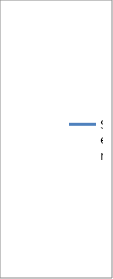
| Category | Series 0 |
|---|---|
| 0 | 8590.865 |
| 1 | 8567.337 |
| 2 | 8543.74 |
| 3 | 8519.288 |
| 4 | 8493.365 |
| 5 | 8468.144 |
| 6 | 8441.712 |
| 7 | 8416.721 |
| 8 | 8391.058 |
| 9 | 8363.827 |
| 10 | 8337.202 |
| 11 | 8310.673 |
| 12 | 8284.644 |
| 13 | 8258.212 |
| 14 | 8231.74 |
| 15 | 8205.144 |
| 16 | 8178.163 |
| 17 | 8151.058 |
| 18 | 8123.683 |
| 19 | 8097.038 |
| 20 | 8070.327 |
| 21 | 8042.817 |
| 22 | 8014.567 |
| 23 | 7988.115 |
| 24 | 7960.673 |
| 25 | 7933.577 |
| 26 | 7905.827 |
| 27 | 7877.971 |
| 28 | 7850.048 |
| 29 | 7822.567 |
| 30 | 7795.356 |
| 31 | 7769.183 |
| 32 | 7742.01 |
| 33 | 7714.462 |
| 34 | 7686.644 |
| 35 | 7658.221 |
| 36 | 7631.788 |
| 37 | 7604.596 |
| 38 | 7576.99 |
| 39 | 7550.231 |
| 40 | 7523.221 |
| 41 | 7495.654 |
| 42 | 7468.663 |
| 43 | 7440.923 |
| 44 | 7413.74 |
| 45 | 7387.481 |
| 46 | 7361.221 |
| 47 | 7334.51 |
| 48 | 7307.625 |
| 49 | 7281.423 |
| 50 | 7256.038 |
| 51 | 7230.106 |
| 52 | 7204.433 |
| 53 | 7177.356 |
| 54 | 7151.067 |
| 55 | 7124.558 |
| 56 | 7098.5 |
| 57 | 7073.923 |
| 58 | 7048.721 |
| 59 | 7023.462 |
| 60 | 6997.192 |
| 61 | 6969.567 |
| 62 | 6943.115 |
| 63 | 6917.76 |
| 64 | 6892.413 |
| 65 | 6866.452 |
| 66 | 6840.24 |
| 67 | 6815.144 |
| 68 | 6789.913 |
| 69 | 6766.029 |
| 70 | 6742.231 |
| 71 | 6718.038 |
| 72 | 6694.019 |
| 73 | 6669.875 |
| 74 | 6645.981 |
| 75 | 6623.077 |
| 76 | 6599.846 |
| 77 | 6576.567 |
| 78 | 6552.673 |
| 79 | 6529.76 |
| 80 | 6507.212 |
| 81 | 6485.385 |
| 82 | 6464.183 |
| 83 | 6441.587 |
| 84 | 6419.423 |
| 85 | 6397.606 |
| 86 | 6376.875 |
| 87 | 6355.76 |
| 88 | 6334.308 |
| 89 | 6313.202 |
| 90 | 6292.115 |
| 91 | 6271.154 |
| 92 | 6251.452 |
| 93 | 6231.317 |
| 94 | 6211.279 |
| 95 | 6191.144 |
| 96 | 6171.442 |
| 97 | 6151.769 |
| 98 | 6132.981 |
| 99 | 6112.462 |
| 100 | 6094.231 |
| 101 | 6075.375 |
| 102 | 6056.981 |
| 103 | 6037.74 |
| 104 | 6020.375 |
| 105 | 6002.317 |
| 106 | 5984.731 |
| 107 | 5967.365 |
| 108 | 5949.327 |
| 109 | 5931.673 |
| 110 | 5914.606 |
| 111 | 5897.712 |
| 112 | 5880.365 |
| 113 | 5863.231 |
| 114 | 5847.894 |
| 115 | 5831.26 |
| 116 | 5814.587 |
| 117 | 5798.394 |
| 118 | 5782.519 |
| 119 | 5767.346 |
| 120 | 5751.481 |
| 121 | 5735.375 |
| 122 | 5720.048 |
| 123 | 5704.538 |
| 124 | 5689.519 |
| 125 | 5673.788 |
| 126 | 5658.337 |
| 127 | 5643.212 |
| 128 | 5628.308 |
| 129 | 5613.596 |
| 130 | 5599.615 |
| 131 | 5584.317 |
| 132 | 5570.173 |
| 133 | 5555.548 |
| 134 | 5540.827 |
| 135 | 5526.856 |
| 136 | 5512.933 |
| 137 | 5498.173 |
| 138 | 5483.885 |
| 139 | 5470.183 |
| 140 | 5455.519 |
| 141 | 5441.567 |
| 142 | 5426.606 |
| 143 | 5413.038 |
| 144 | 5399.25 |
| 145 | 5384.99 |
| 146 | 5370.654 |
| 147 | 5356.673 |
| 148 | 5342.952 |
| 149 | 5329.856 |
| 150 | 5316.019 |
| 151 | 5302.625 |
| 152 | 5289.173 |
| 153 | 5276.712 |
| 154 | 5263.615 |
| 155 | 5250.875 |
| 156 | 5238.673 |
| 157 | 5226.202 |
| 158 | 5213.702 |
| 159 | 5202.125 |
| 160 | 5189.644 |
| 161 | 5177.26 |
| 162 | 5165.029 |
| 163 | 5152.981 |
| 164 | 5141.567 |
| 165 | 5129.481 |
| 166 | 5117.394 |
| 167 | 5105.75 |
| 168 | 5093.779 |
| 169 | 5082.192 |
| 170 | 5071.663 |
| 171 | 5060.49 |
| 172 | 5048.99 |
| 173 | 5038.577 |
| 174 | 5027.106 |
| 175 | 5016.125 |
| 176 | 5005.404 |
| 177 | 4994.615 |
| 178 | 4983.913 |
| 179 | 4973.865 |
| 180 | 4963.106 |
| 181 | 4952.51 |
| 182 | 4942.058 |
| 183 | 4931.923 |
| 184 | 4922.231 |
| 185 | 4912.26 |
| 186 | 4902.51 |
| 187 | 4892.558 |
| 188 | 4882.962 |
| 189 | 4873.423 |
| 190 | 4864.058 |
| 191 | 4853.875 |
| 192 | 4844.529 |
| 193 | 4835.462 |
| 194 | 4827.125 |
| 195 | 4818.192 |
| 196 | 4809 |
| 197 | 4800.538 |
| 198 | 4791.558 |
| 199 | 4782.817 |
| 200 | 4774.663 |
| 201 | 4766.442 |
| 202 | 4757.606 |
| 203 | 4749.029 |
| 204 | 4741.298 |
| 205 | 4733.077 |
| 206 | 4724.452 |
| 207 | 4715.942 |
| 208 | 4708.481 |
| 209 | 4700.74 |
| 210 | 4692.442 |
| 211 | 4685.192 |
| 212 | 4677.683 |
| 213 | 4670.183 |
| 214 | 4662.288 |
| 215 | 4654.712 |
| 216 | 4647.538 |
| 217 | 4640.788 |
| 218 | 4633.99 |
| 219 | 4626.654 |
| 220 | 4619.481 |
| 221 | 4612.827 |
| 222 | 4606.019 |
| 223 | 4598.721 |
| 224 | 4592.115 |
| 225 | 4585.452 |
| 226 | 4578.933 |
| 227 | 4572.481 |
| 228 | 4566.596 |
| 229 | 4560.413 |
| 230 | 4554.221 |
| 231 | 4548.144 |
| 232 | 4542.048 |
| 233 | 4535.76 |
| 234 | 4529.596 |
| 235 | 4523.837 |
| 236 | 4517.875 |
| 237 | 4512.471 |
| 238 | 4506.865 |
| 239 | 4501.654 |
| 240 | 4496.558 |
| 241 | 4491.567 |
| 242 | 4486.433 |
| 243 | 4482.26 |
| 244 | 4477.038 |
| 245 | 4471.971 |
| 246 | 4466.769 |
| 247 | 4462.125 |
| 248 | 4458.519 |
| 249 | 4453.769 |
| 250 | 4448.606 |
| 251 | 4443.76 |
| 252 | 4439.356 |
| 253 | 4434.654 |
| 254 | 4429.567 |
| 255 | 4424.019 |
| 256 | 4418.798 |
| 257 | 4414.308 |
| 258 | 4408.683 |
| 259 | 4404.529 |
| 260 | 4400.135 |
| 261 | 4394.183 |
| 262 | 4387.798 |
| 263 | 4382.452 |
| 264 | 4377.087 |
| 265 | 4371.385 |
| 266 | 4366.192 |
| 267 | 4361.087 |
| 268 | 4356.51 |
| 269 | 4352.077 |
| 270 | 4347.663 |
| 271 | 4343.5 |
| 272 | 4338.913 |
| 273 | 4334.635 |
| 274 | 4331.038 |
| 275 | 4328.394 |
| 276 | 4325.337 |
| 277 | 4322.75 |
| 278 | 4320.135 |
| 279 | 4318.481 |
| 280 | 4316.74 |
| 281 | 4315.327 |
| 282 | 4314.375 |
| 283 | 4313.827 |
| 284 | 4313.942 |
| 285 | 4313.298 |
| 286 | 4312.615 |
| 287 | 4312.327 |
| 288 | 4312.5 |
| 289 | 4314.154 |
| 290 | 4315.308 |
| 291 | 4317.625 |
| 292 | 4319.433 |
| 293 | 4321.596 |
| 294 | 4324.942 |
| 295 | 4327.327 |
| 296 | 4329.279 |
| 297 | 4331.615 |
| 298 | 4335.269 |
| 299 | 4338.894 |
| 300 | 4342.452 |
| 301 | 4347.481 |
| 302 | 4352.423 |
| 303 | 4358.75 |
| 304 | 4365.298 |
| 305 | 4372.51 |
| 306 | 4380.067 |
| 307 | 4387.923 |
| 308 | 4397.038 |
| 309 | 4404.913 |
| 310 | 4413.75 |
| 311 | 4423.365 |
| 312 | 4433.269 |
| 313 | 4443.202 |
| 314 | 4454.846 |
| 315 | 4465.375 |
| 316 | 4476.933 |
| 317 | 4489.192 |
| 318 | 4502.288 |
| 319 | 4514.221 |
| 320 | 4527.952 |
| 321 | 4542.067 |
| 322 | 4557.24 |
| 323 | 4571.846 |
| 324 | 4586.99 |
| 325 | 4603.298 |
| 326 | 4619.327 |
| 327 | 4635.183 |
| 328 | 4652.221 |
| 329 | 4670.433 |
| 330 | 4689.067 |
| 331 | 4708.721 |
| 332 | 4729.356 |
| 333 | 4750.635 |
| 334 | 4771.654 |
| 335 | 4793.587 |
| 336 | 4816.481 |
| 337 | 4840.192 |
| 338 | 4864.702 |
| 339 | 4889.077 |
| 340 | 4913.212 |
| 341 | 4937.019 |
| 342 | 4961.202 |
| 343 | 4986.365 |
| 344 | 5011.471 |
| 345 | 5037.51 |
| 346 | 5063.635 |
| 347 | 5090.394 |
| 348 | 5117.317 |
| 349 | 5143.183 |
| 350 | 5170.567 |
| 351 | 5196.74 |
| 352 | 5222.952 |
| 353 | 5249.077 |
| 354 | 5275.5 |
| 355 | 5301.99 |
| 356 | 5327.952 |
| 357 | 5353.837 |
| 358 | 5379.827 |
| 359 | 5405.837 |
| 360 | 5430.663 |
| 361 | 5457.731 |
| 362 | 5485.173 |
| 363 | 5512.75 |
| 364 | 5539.442 |
| 365 | 5567.173 |
| 366 | 5595.683 |
| 367 | 5623.519 |
| 368 | 5652.5 |
| 369 | 5683.144 |
| 370 | 5713.606 |
| 371 | 5745.548 |
| 372 | 5776.865 |
| 373 | 5809.721 |
| 374 | 5842.029 |
| 375 | 5874.846 |
| 376 | 5908.202 |
| 377 | 5942.163 |
| 378 | 5976.385 |
| 379 | 6010.577 |
| 380 | 6045.49 |
| 381 | 6081.779 |
| 382 | 6118.433 |
| 383 | 6154.538 |
| 384 | 6191.029 |
| 385 | 6227.942 |
| 386 | 6264.731 |
| 387 | 6301.817 |
| 388 | 6338.25 |
| 389 | 6375.615 |
| 390 | 6413.644 |
| 391 | 6452.327 |
| 392 | 6491.067 |
| 393 | 6530.067 |
| 394 | 6569.683 |
| 395 | 6610.635 |
| 396 | 6652.519 |
| 397 | 6693.596 |
| 398 | 6735.356 |
| 399 | 6778.288 |
| 400 | 6819.971 |
| 401 | 6862.346 |
| 402 | 6904.462 |
| 403 | 6946.048 |
| 404 | 6987.731 |
| 405 | 7030.337 |
| 406 | 7071.837 |
| 407 | 7112.394 |
| 408 | 7153.356 |
| 409 | 7193.308 |
| 410 | 7231.481 |
| 411 | 7270.038 |
| 412 | 7307.731 |
| 413 | 7343.904 |
| 414 | 7380.942 |
| 415 | 7416.308 |
| 416 | 7451.048 |
| 417 | 7485.817 |
| 418 | 7520.663 |
| 419 | 7553.587 |
| 420 | 7586.481 |
| 421 | 7618.356 |
| 422 | 7650.567 |
| 423 | 7683.856 |
| 424 | 7717.971 |
| 425 | 7751.538 |
| 426 | 7785.875 |
| 427 | 7820.894 |
| 428 | 7854.51 |
| 429 | 7889.74 |
| 430 | 7923.76 |
| 431 | 7958.125 |
| 432 | 7993.5 |
| 433 | 8028.183 |
| 434 | 8062.712 |
| 435 | 8097.856 |
| 436 | 8132.288 |
| 437 | 8167.115 |
| 438 | 8200.721 |
| 439 | 8235.212 |
| 440 | 8269.76 |
| 441 | 8303.183 |
| 442 | 8337.221 |
| 443 | 8370.163 |
| 444 | 8402.519 |
| 445 | 8435.731 |
| 446 | 8468.269 |
| 447 | 8499.625 |
| 448 | 8530.75 |
| 449 | 8561.519 |
| 450 | 8593.154 |
| 451 | 8623.731 |
| 452 | 8654.288 |
| 453 | 8685.279 |
| 454 | 8715.567 |
| 455 | 8745.625 |
| 456 | 8775.788 |
| 457 | 8803.654 |
| 458 | 8831.837 |
| 459 | 8861.462 |
| 460 | 8889.952 |
| 461 | 8917.99 |
| 462 | 8945.692 |
| 463 | 8973.683 |
| 464 | 9001.827 |
| 465 | 9027.615 |
| 466 | 9054.058 |
| 467 | 9080.202 |
| 468 | 9106.5 |
| 469 | 9131.692 |
| 470 | 9156.798 |
| 471 | 9181.25 |
| 472 | 9205.442 |
| 473 | 9229.731 |
| 474 | 9252.76 |
| 475 | 9276.077 |
| 476 | 9297.885 |
| 477 | 9320.962 |
| 478 | 9342.827 |
| 479 | 9364.606 |
| 480 | 9386.587 |
| 481 | 9407.683 |
| 482 | 9428.615 |
| 483 | 9449.308 |
| 484 | 9469.663 |
| 485 | 9489.317 |
| 486 | 9508.769 |
| 487 | 9528.231 |
| 488 | 9548.019 |
| 489 | 9567.712 |
| 490 | 9587.971 |
| 491 | 9607.26 |
| 492 | 9626.346 |
| 493 | 9645.567 |
| 494 | 9665.212 |
| 495 | 9684.269 |
| 496 | 9703.279 |
| 497 | 9721.788 |
| 498 | 9739.885 |
| 499 | 9758.298 |
| 500 | 9775.635 |
| 501 | 9793.596 |
| 502 | 9810.856 |
| 503 | 9828.529 |
| 504 | 9845.433 |
| 505 | 9861.913 |
| 506 | 9877.615 |
| 507 | 9894.144 |
| 508 | 9909.615 |
| 509 | 9925.221 |
| 510 | 9940.279 |
| 511 | 9954.769 |
| 512 | 9970.087 |
| 513 | 9984.981 |
| 514 | 9999.779 |
| 515 | 10014.058 |
| 516 | 10027.769 |
| 517 | 10042.394 |
| 518 | 10056.019 |
| 519 | 10070.269 |
| 520 | 10083.683 |
| 521 | 10096.731 |
| 522 | 10110.24 |
| 523 | 10122.99 |
| 524 | 10136.077 |
| 525 | 10147.942 |
| 526 | 10160.163 |
| 527 | 10172.212 |
| 528 | 10184.202 |
| 529 | 10195.692 |
| 530 | 10207.212 |
| 531 | 10218.74 |
| 532 | 10229.606 |
| 533 | 10240.279 |
| 534 | 10251.135 |
| 535 | 10261.115 |
| 536 | 10271.558 |
| 537 | 10281.058 |
| 538 | 10290.933 |
| 539 | 10301.067 |
| 540 | 10310.683 |
| 541 | 10320.865 |
| 542 | 10330.125 |
| 543 | 10339.269 |
| 544 | 10348.51 |
| 545 | 10358.433 |
| 546 | 10368.442 |
| 547 | 10377.115 |
| 548 | 10385.894 |
| 549 | 10395.279 |
| 550 | 10404.087 |
| 551 | 10413.221 |
| 552 | 10422.221 |
| 553 | 10431.327 |
| 554 | 10439.837 |
| 555 | 10448.663 |
| 556 | 10456.077 |
| 557 | 10464.567 |
| 558 | 10472.394 |
| 559 | 10480.279 |
| 560 | 10488.24 |
| 561 | 10496.308 |
| 562 | 10504.279 |
| 563 | 10511.923 |
| 564 | 10519.394 |
| 565 | 10526.606 |
| 566 | 10533.567 |
| 567 | 10541.231 |
| 568 | 10546.981 |
| 569 | 10553.202 |
| 570 | 10559.971 |
| 571 | 10566.327 |
| 572 | 10573.279 |
| 573 | 10579.692 |
| 574 | 10585.817 |
| 575 | 10591.731 |
| 576 | 10597.481 |
| 577 | 10603.712 |
| 578 | 10609.462 |
| 579 | 10614.76 |
| 580 | 10620.538 |
| 581 | 10625.913 |
| 582 | 10630.952 |
| 583 | 10636.221 |
| 584 | 10641.74 |
| 585 | 10646.952 |
| 586 | 10651.615 |
| 587 | 10657.442 |
| 588 | 10662.221 |
| 589 | 10667.163 |
| 590 | 10671.702 |
| 591 | 10675.962 |
| 592 | 10680.606 |
| 593 | 10684.529 |
| 594 | 10688.548 |
| 595 | 10692.308 |
| 596 | 10695.731 |
| 597 | 10699.337 |
| 598 | 10702.385 |
| 599 | 10706.298 |
| 600 | 10709.221 |
| 601 | 10712.423 |
| 602 | 10714.981 |
| 603 | 10718.019 |
| 604 | 10721.087 |
| 605 | 10723.981 |
| 606 | 10727.096 |
| 607 | 10729.712 |
| 608 | 10733.692 |
| 609 | 10736.76 |
| 610 | 10739.365 |
| 611 | 10742.481 |
| 612 | 10745.692 |
| 613 | 10748.25 |
| 614 | 10751.096 |
| 615 | 10754.135 |
| 616 | 10757.067 |
| 617 | 10760.154 |
| 618 | 10762.644 |
| 619 | 10765.135 |
| 620 | 10768.096 |
| 621 | 10770.885 |
| 622 | 10774.452 |
| 623 | 10777.038 |
| 624 | 10779.346 |
| 625 | 10781.865 |
| 626 | 10784.74 |
| 627 | 10787.192 |
| 628 | 10789.99 |
| 629 | 10792.846 |
| 630 | 10795.798 |
| 631 | 10798.192 |
| 632 | 10800.837 |
| 633 | 10803.519 |
| 634 | 10806.01 |
| 635 | 10808.538 |
| 636 | 10811.183 |
| 637 | 10813.567 |
| 638 | 10815.798 |
| 639 | 10818.5 |
| 640 | 10821.365 |
| 641 | 10823.558 |
| 642 | 10826 |
| 643 | 10828.721 |
| 644 | 10830.606 |
| 645 | 10832.913 |
| 646 | 10835.327 |
| 647 | 10837.837 |
| 648 | 10839.481 |
| 649 | 10841.654 |
| 650 | 10843.404 |
| 651 | 10845.087 |
| 652 | 10846.683 |
| 653 | 10848.029 |
| 654 | 10849.981 |
| 655 | 10851.346 |
| 656 | 10852.577 |
| 657 | 10853.846 |
| 658 | 10855 |
| 659 | 10855.837 |
| 660 | 10856.894 |
| 661 | 10857.394 |
| 662 | 10858.615 |
| 663 | 10859.74 |
| 664 | 10860.615 |
| 665 | 10862.596 |
| 666 | 10863.567 |
| 667 | 10865.01 |
| 668 | 10866.279 |
| 669 | 10867.51 |
| 670 | 10869.413 |
| 671 | 10871.404 |
| 672 | 10872.933 |
| 673 | 10874.452 |
| 674 | 10876.269 |
| 675 | 10877.99 |
| 676 | 10879.442 |
| 677 | 10880.615 |
| 678 | 10882.288 |
| 679 | 10883.788 |
| 680 | 10885.308 |
| 681 | 10886.577 |
| 682 | 10888.202 |
| 683 | 10889.673 |
| 684 | 10890.971 |
| 685 | 10892.231 |
| 686 | 10893.519 |
| 687 | 10895.375 |
| 688 | 10896.731 |
| 689 | 10897.971 |
| 690 | 10899.385 |
| 691 | 10901.029 |
| 692 | 10902.587 |
| 693 | 10903.846 |
| 694 | 10905.24 |
| 695 | 10906.51 |
| 696 | 10908.5 |
| 697 | 10909.942 |
| 698 | 10911.183 |
| 699 | 10912.673 |
| 700 | 10914.038 |
| 701 | 10915.221 |
| 702 | 10916.01 |
| 703 | 10916.942 |
| 704 | 10918.202 |
| 705 | 10919.26 |
| 706 | 10920.269 |
| 707 | 10921.702 |
| 708 | 10922.51 |
| 709 | 10923.769 |
| 710 | 10924.529 |
| 711 | 10925.317 |
| 712 | 10926.019 |
| 713 | 10926.26 |
| 714 | 10926.702 |
| 715 | 10926.779 |
| 716 | 10926.644 |
| 717 | 10926.596 |
| 718 | 10926.221 |
| 719 | 10926.817 |
| 720 | 10926.26 |
| 721 | 10925.654 |
| 722 | 10925.548 |
| 723 | 10925.856 |
| 724 | 10925.808 |
| 725 | 10925.673 |
| 726 | 10926.154 |
| 727 | 10926.106 |
| 728 | 10926.394 |
| 729 | 10926.779 |
| 730 | 10926.577 |
| 731 | 10926.702 |
| 732 | 10927.327 |
| 733 | 10927.538 |
| 734 | 10927.24 |
| 735 | 10927.692 |
| 736 | 10927.962 |
| 737 | 10927.567 |
| 738 | 10927.587 |
| 739 | 10927.365 |
| 740 | 10927.115 |
| 741 | 10927.221 |
| 742 | 10926.894 |
| 743 | 10925.808 |
| 744 | 10925.519 |
| 745 | 10924.481 |
| 746 | 10923.442 |
| 747 | 10922.26 |
| 748 | 10921.462 |
| 749 | 10920.029 |
| 750 | 10918.913 |
| 751 | 10918.558 |
| 752 | 10917.731 |
| 753 | 10916.288 |
| 754 | 10915.346 |
| 755 | 10914.49 |
| 756 | 10913.712 |
| 757 | 10912.548 |
| 758 | 10911.019 |
| 759 | 10909.827 |
| 760 | 10909.221 |
| 761 | 10908.327 |
| 762 | 10907.317 |
| 763 | 10906.875 |
| 764 | 10906.279 |
| 765 | 10905.413 |
| 766 | 10904.471 |
| 767 | 10902.837 |
| 768 | 10901.173 |
| 769 | 10899.538 |
| 770 | 10897.952 |
| 771 | 10896.096 |
| 772 | 10894.856 |
| 773 | 10892.808 |
| 774 | 10890.798 |
| 775 | 10888.942 |
| 776 | 10887.356 |
| 777 | 10885.308 |
| 778 | 10883.029 |
| 779 | 10880.721 |
| 780 | 10878.462 |
| 781 | 10876.173 |
| 782 | 10874.192 |
| 783 | 10872.462 |
| 784 | 10870.231 |
| 785 | 10868.308 |
| 786 | 10865.76 |
| 787 | 10864.769 |
| 788 | 10863.25 |
| 789 | 10861.269 |
| 790 | 10859.788 |
| 791 | 10857.827 |
| 792 | 10856.096 |
| 793 | 10854.106 |
| 794 | 10852.154 |
| 795 | 10850.413 |
| 796 | 10848.394 |
| 797 | 10846.183 |
| 798 | 10844.548 |
| 799 | 10842.288 |
| 800 | 10839.346 |
| 801 | 10836.971 |
| 802 | 10834.413 |
| 803 | 10831.49 |
| 804 | 10828.663 |
| 805 | 10826.019 |
| 806 | 10823.221 |
| 807 | 10820.183 |
| 808 | 10817.144 |
| 809 | 10814.019 |
| 810 | 10811.183 |
| 811 | 10808.221 |
| 812 | 10805.038 |
| 813 | 10802.24 |
| 814 | 10799.183 |
| 815 | 10795.471 |
| 816 | 10792.529 |
| 817 | 10788.769 |
| 818 | 10784.692 |
| 819 | 10782.067 |
| 820 | 10778.183 |
| 821 | 10773.952 |
| 822 | 10770.885 |
| 823 | 10767.154 |
| 824 | 10763.087 |
| 825 | 10757.923 |
| 826 | 10753.25 |
| 827 | 10748.971 |
| 828 | 10744.337 |
| 829 | 10738.856 |
| 830 | 10733.856 |
| 831 | 10727.971 |
| 832 | 10722.471 |
| 833 | 10717.288 |
| 834 | 10711.529 |
| 835 | 10705.923 |
| 836 | 10700.192 |
| 837 | 10693.913 |
| 838 | 10687.529 |
| 839 | 10681.221 |
| 840 | 10674.423 |
| 841 | 10667.673 |
| 842 | 10662.058 |
| 843 | 10655.519 |
| 844 | 10649.702 |
| 845 | 10643.423 |
| 846 | 10638.25 |
| 847 | 10632.433 |
| 848 | 10627.356 |
| 849 | 10620.837 |
| 850 | 10614.846 |
| 851 | 10608.846 |
| 852 | 10602.365 |
| 853 | 10595.625 |
| 854 | 10588.356 |
| 855 | 10581.644 |
| 856 | 10573.904 |
| 857 | 10566.096 |
| 858 | 10558.442 |
| 859 | 10550.038 |
| 860 | 10541.577 |
| 861 | 10533.058 |
| 862 | 10523.731 |
| 863 | 10515.413 |
| 864 | 10506.721 |
| 865 | 10498.144 |
| 866 | 10488.596 |
| 867 | 10478.798 |
| 868 | 10469.365 |
| 869 | 10459.317 |
| 870 | 10450.029 |
| 871 | 10440.731 |
| 872 | 10429.923 |
| 873 | 10420.471 |
| 874 | 10409.817 |
| 875 | 10398.471 |
| 876 | 10388.25 |
| 877 | 10377.827 |
| 878 | 10367.048 |
| 879 | 10356.144 |
| 880 | 10345.048 |
| 881 | 10333.096 |
| 882 | 10320.788 |
| 883 | 10308.538 |
| 884 | 10295.981 |
| 885 | 10284.058 |
| 886 | 10271.154 |
| 887 | 10256.99 |
| 888 | 10243.769 |
| 889 | 10228.75 |
| 890 | 10213.692 |
| 891 | 10198.683 |
| 892 | 10184.567 |
| 893 | 10168.99 |
| 894 | 10154.279 |
| 895 | 10137.673 |
| 896 | 10121.885 |
| 897 | 10105.538 |
| 898 | 10089.952 |
| 899 | 10073.606 |
| 900 | 10056.173 |
| 901 | 10040.038 |
| 902 | 10026.26 |
| 903 | 10010.529 |
| 904 | 9995.375 |
| 905 | 9980.942 |
| 906 | 9966.077 |
| 907 | 9950.394 |
| 908 | 9935.308 |
| 909 | 9918.788 |
| 910 | 9902.394 |
| 911 | 9887.173 |
| 912 | 9871.087 |
| 913 | 9854.865 |
| 914 | 9837.673 |
| 915 | 9820.317 |
| 916 | 9802.375 |
| 917 | 9783.99 |
| 918 | 9766.125 |
| 919 | 9745.875 |
| 920 | 9726.115 |
| 921 | 9706.212 |
| 922 | 9686.212 |
| 923 | 9665.212 |
| 924 | 9643.298 |
| 925 | 9621.904 |
| 926 | 9598.923 |
| 927 | 9576.096 |
| 928 | 9554.779 |
| 929 | 9532.721 |
| 930 | 9511.096 |
| 931 | 9488.933 |
| 932 | 9464.577 |
| 933 | 9440.635 |
| 934 | 9418.269 |
| 935 | 9394.327 |
| 936 | 9370.144 |
| 937 | 9345.923 |
| 938 | 9320.115 |
| 939 | 9294.135 |
| 940 | 9269.894 |
| 941 | 9243.837 |
| 942 | 9217.202 |
| 943 | 9189.327 |
| 944 | 9161.115 |
| 945 | 9132.981 |
| 946 | 9103.298 |
| 947 | 9073.894 |
| 948 | 9045.971 |
| 949 | 9016.837 |
| 950 | 8986.683 |
| 951 | 8955.615 |
| 952 | 8925.269 |
| 953 | 8896.317 |
| 954 | 8865.75 |
| 955 | 8835.788 |
| 956 | 8806.731 |
| 957 | 8777.962 |
| 958 | 8748.25 |
| 959 | 8718.731 |
| 960 | 8691.308 |
| 961 | 8664.567 |
| 962 | 8638.308 |
| 963 | 8612.096 |
| 964 | 8587.221 |
| 965 | 8563.019 |
| 966 | 8538.952 |
| 967 | 8515.51 |
| 968 | 8491.25 |
| 969 | 8468.856 |
| 970 | 8446.625 |
| 971 | 8423.798 |
| 972 | 8402.346 |
| 973 | 8379.75 |
| 974 | 8359.952 |
| 975 | 8337.231 |
| 976 | 8315.154 |
| 977 | 8292.221 |
| 978 | 8267.663 |
| 979 | 8245.74 |
| 980 | 8221.01 |
| 981 | 8199.904 |
| 982 | 8177.125 |
| 983 | 8155.135 |
| 984 | 8132.115 |
| 985 | 8109.692 |
| 986 | 8087.885 |
| 987 | 8069.173 |
| 988 | 8050.096 |
| 989 | 8031.471 |
| 990 | 8016.144 |
| 991 | 8000.471 |
| 992 | 7985.452 |
| 993 | 7972.625 |
| 994 | 7961.923 |
| 995 | 7950.221 |
| 996 | 7940.673 |
| 997 | 7932.221 |
| 998 | 7923.846 |
| 999 | 7916.288 |
| 1000 | 7907.865 |
| 1001 | 7902.49 |
| 1002 | 7896.202 |
| 1003 | 7891.952 |
| 1004 | 7888.279 |
| 1005 | 7888.625 |
| 1006 | 7888.885 |
| 1007 | 7889.779 |
| 1008 | 7892.029 |
| 1009 | 7896.173 |
| 1010 | 7901.731 |
| 1011 | 7909.577 |
| 1012 | 7917.202 |
| 1013 | 7928.019 |
| 1014 | 7938.817 |
| 1015 | 7952.135 |
| 1016 | 7968.75 |
| 1017 | 7986.865 |
| 1018 | 8006.981 |
| 1019 | 8027.808 |
| 1020 | 8050.75 |
| 1021 | 8076.356 |
| 1022 | 8103.558 |
| 1023 | 8134.221 |
| 1024 | 8166.308 |
| 1025 | 8201.567 |
| 1026 | 8238.981 |
| 1027 | 8278.846 |
| 1028 | 8318.808 |
| 1029 | 8360.558 |
| 1030 | 8402.846 |
| 1031 | 8445.606 |
| 1032 | 8490.798 |
| 1033 | 8536.769 |
| 1034 | 8582.865 |
| 1035 | 8629.673 |
| 1036 | 8675.644 |
| 1037 | 8721.087 |
| 1038 | 8768.577 |
| 1039 | 8815.115 |
| 1040 | 8860.144 |
| 1041 | 8905.577 |
| 1042 | 8950.51 |
| 1043 | 8994.817 |
| 1044 | 9039.337 |
| 1045 | 9082 |
| 1046 | 9124.712 |
| 1047 | 9168.192 |
| 1048 | 9212.058 |
| 1049 | 9254.452 |
| 1050 | 9298.837 |
| 1051 | 9341.144 |
| 1052 | 9384.635 |
| 1053 | 9425.731 |
| 1054 | 9467.202 |
| 1055 | 9508.125 |
| 1056 | 9548.462 |
| 1057 | 9589.865 |
| 1058 | 9631.375 |
| 1059 | 9670.779 |
| 1060 | 9709.827 |
| 1061 | 9749.404 |
| 1062 | 9788.067 |
| 1063 | 9826.49 |
| 1064 | 9865.183 |
| 1065 | 9902.692 |
| 1066 | 9939.587 |
| 1067 | 9974.548 |
| 1068 | 10010.433 |
| 1069 | 10046 |
| 1070 | 10080.538 |
| 1071 | 10114.923 |
| 1072 | 10148.183 |
| 1073 | 10180.135 |
| 1074 | 10213.635 |
| 1075 | 10244.269 |
| 1076 | 10276.019 |
| 1077 | 10304.952 |
| 1078 | 10334.212 |
| 1079 | 10363.24 |
| 1080 | 10391.385 |
| 1081 | 10420.087 |
| 1082 | 10447.24 |
| 1083 | 10475.087 |
| 1084 | 10502.904 |
| 1085 | 10531.077 |
| 1086 | 10557.663 |
| 1087 | 10584.837 |
| 1088 | 10612.337 |
| 1089 | 10638.26 |
| 1090 | 10663.144 |
| 1091 | 10688.24 |
| 1092 | 10714.24 |
| 1093 | 10738.462 |
| 1094 | 10762.635 |
| 1095 | 10785.644 |
| 1096 | 10807.615 |
| 1097 | 10829.74 |
| 1098 | 10852.423 |
| 1099 | 10873.827 |
| 1100 | 10894.577 |
| 1101 | 10915.106 |
| 1102 | 10934.798 |
| 1103 | 10952.712 |
| 1104 | 10971.385 |
| 1105 | 10990.26 |
| 1106 | 11007.529 |
| 1107 | 11024.538 |
| 1108 | 11041.462 |
| 1109 | 11057.481 |
| 1110 | 11072.606 |
| 1111 | 11087.894 |
| 1112 | 11102.952 |
| 1113 | 11117.154 |
| 1114 | 11131.923 |
| 1115 | 11146.413 |
| 1116 | 11160.673 |
| 1117 | 11175.404 |
| 1118 | 11189.587 |
| 1119 | 11203.846 |
| 1120 | 11216.346 |
| 1121 | 11229.019 |
| 1122 | 11241.856 |
| 1123 | 11253.712 |
| 1124 | 11265.394 |
| 1125 | 11276.356 |
| 1126 | 11287.798 |
| 1127 | 11299.029 |
| 1128 | 11309.885 |
| 1129 | 11320 |
| 1130 | 11330.875 |
| 1131 | 11341.125 |
| 1132 | 11350.779 |
| 1133 | 11360.548 |
| 1134 | 11369.5 |
| 1135 | 11378 |
| 1136 | 11387.221 |
| 1137 | 11395.433 |
| 1138 | 11403.663 |
| 1139 | 11412.279 |
| 1140 | 11419.76 |
| 1141 | 11427.817 |
| 1142 | 11434.971 |
| 1143 | 11441.827 |
| 1144 | 11448.663 |
| 1145 | 11455.702 |
| 1146 | 11463.317 |
| 1147 | 11470.49 |
| 1148 | 11477.683 |
| 1149 | 11484.827 |
| 1150 | 11491.26 |
| 1151 | 11498.25 |
| 1152 | 11504.644 |
| 1153 | 11511.692 |
| 1154 | 11517.596 |
| 1155 | 11523.673 |
| 1156 | 11529.317 |
| 1157 | 11534.865 |
| 1158 | 11541.029 |
| 1159 | 11545.837 |
| 1160 | 11552.269 |
| 1161 | 11557.913 |
| 1162 | 11562.913 |
| 1163 | 11567.856 |
| 1164 | 11572.644 |
| 1165 | 11577.26 |
| 1166 | 11581.76 |
| 1167 | 11585.808 |
| 1168 | 11589.635 |
| 1169 | 11593.673 |
| 1170 | 11596.923 |
| 1171 | 11600.048 |
| 1172 | 11603.51 |
| 1173 | 11606.375 |
| 1174 | 11609.058 |
| 1175 | 11611.202 |
| 1176 | 11614.01 |
| 1177 | 11616.519 |
| 1178 | 11618.75 |
| 1179 | 11620.846 |
| 1180 | 11622.529 |
| 1181 | 11624.077 |
| 1182 | 11626.692 |
| 1183 | 11628.385 |
| 1184 | 11629.952 |
| 1185 | 11631.202 |
| 1186 | 11632.462 |
| 1187 | 11633.885 |
| 1188 | 11635.192 |
| 1189 | 11636.452 |
| 1190 | 11637.904 |
| 1191 | 11638.404 |
| 1192 | 11639.279 |
| 1193 | 11640.058 |
| 1194 | 11640.433 |
| 1195 | 11640.615 |
| 1196 | 11641.231 |
| 1197 | 11641.933 |
| 1198 | 11642.192 |
| 1199 | 11642.558 |
| 1200 | 11642.135 |
| 1201 | 11642.298 |
| 1202 | 11642.702 |
| 1203 | 11643.26 |
| 1204 | 11643.51 |
| 1205 | 11643.577 |
| 1206 | 11643.596 |
| 1207 | 11643.5 |
| 1208 | 11643.192 |
| 1209 | 11643.481 |
| 1210 | 11644.24 |
| 1211 | 11644.298 |
| 1212 | 11644.471 |
| 1213 | 11644.702 |
| 1214 | 11645.346 |
| 1215 | 11644.952 |
| 1216 | 11644.481 |
| 1217 | 11643.75 |
| 1218 | 11642.894 |
| 1219 | 11641.942 |
| 1220 | 11640.933 |
| 1221 | 11639.827 |
| 1222 | 11639.077 |
| 1223 | 11638.404 |
| 1224 | 11637.231 |
| 1225 | 11636.692 |
| 1226 | 11635.635 |
| 1227 | 11634.452 |
| 1228 | 11633.538 |
| 1229 | 11632.288 |
| 1230 | 11630.933 |
| 1231 | 11629.615 |
| 1232 | 11627.702 |
| 1233 | 11626.837 |
| 1234 | 11625.144 |
| 1235 | 11623.279 |
| 1236 | 11621.817 |
| 1237 | 11620.615 |
| 1238 | 11619.144 |
| 1239 | 11617.471 |
| 1240 | 11615.692 |
| 1241 | 11614.192 |
| 1242 | 11612.26 |
| 1243 | 11609.971 |
| 1244 | 11607.567 |
| 1245 | 11605.538 |
| 1246 | 11603.135 |
| 1247 | 11600.76 |
| 1248 | 11598.721 |
| 1249 | 11596.788 |
| 1250 | 11594.712 |
| 1251 | 11592.5 |
| 1252 | 11590.163 |
| 1253 | 11587.692 |
| 1254 | 11585.365 |
| 1255 | 11583.019 |
| 1256 | 11580.106 |
| 1257 | 11577.452 |
| 1258 | 11574.49 |
| 1259 | 11571.913 |
| 1260 | 11569.337 |
| 1261 | 11566.423 |
| 1262 | 11563.721 |
| 1263 | 11561.577 |
| 1264 | 11558.875 |
| 1265 | 11555.894 |
| 1266 | 11552.885 |
| 1267 | 11550.212 |
| 1268 | 11547.356 |
| 1269 | 11544.49 |
| 1270 | 11541.702 |
| 1271 | 11538.837 |
| 1272 | 11536 |
| 1273 | 11532.308 |
| 1274 | 11528.952 |
| 1275 | 11525.731 |
| 1276 | 11522.067 |
| 1277 | 11518.923 |
| 1278 | 11515 |
| 1279 | 11511.452 |
| 1280 | 11508.221 |
| 1281 | 11504.74 |
| 1282 | 11501.337 |
| 1283 | 11497.106 |
| 1284 | 11492.952 |
| 1285 | 11488.577 |
| 1286 | 11484.077 |
| 1287 | 11479.365 |
| 1288 | 11475.327 |
| 1289 | 11471.144 |
| 1290 | 11466.644 |
| 1291 | 11462.423 |
| 1292 | 11458.481 |
| 1293 | 11454.087 |
| 1294 | 11449.75 |
| 1295 | 11445.096 |
| 1296 | 11439.981 |
| 1297 | 11435.356 |
| 1298 | 11430.221 |
| 1299 | 11425.24 |
| 1300 | 11420.462 |
| 1301 | 11415.154 |
| 1302 | 11410.519 |
| 1303 | 11405.683 |
| 1304 | 11400.615 |
| 1305 | 11395.404 |
| 1306 | 11389.654 |
| 1307 | 11383.548 |
| 1308 | 11378.279 |
| 1309 | 11371.846 |
| 1310 | 11366.173 |
| 1311 | 11360.654 |
| 1312 | 11355.231 |
| 1313 | 11349.644 |
| 1314 | 11343.269 |
| 1315 | 11337.519 |
| 1316 | 11331.135 |
| 1317 | 11324.808 |
| 1318 | 11319.087 |
| 1319 | 11312.577 |
| 1320 | 11306.404 |
| 1321 | 11299.865 |
| 1322 | 11293.558 |
| 1323 | 11287.404 |
| 1324 | 11280.846 |
| 1325 | 11273.625 |
| 1326 | 11266.913 |
| 1327 | 11259.894 |
| 1328 | 11252.673 |
| 1329 | 11245.808 |
| 1330 | 11238.452 |
| 1331 | 11230.942 |
| 1332 | 11223.01 |
| 1333 | 11215.51 |
| 1334 | 11207.529 |
| 1335 | 11198.769 |
| 1336 | 11190.808 |
| 1337 | 11182.577 |
| 1338 | 11174.192 |
| 1339 | 11165.337 |
| 1340 | 11156.615 |
| 1341 | 11147.125 |
| 1342 | 11138.529 |
| 1343 | 11129.202 |
| 1344 | 11119.26 |
| 1345 | 11109.923 |
| 1346 | 11100.625 |
| 1347 | 11090.567 |
| 1348 | 11080.846 |
| 1349 | 11070.75 |
| 1350 | 11060.135 |
| 1351 | 11048.913 |
| 1352 | 11038.625 |
| 1353 | 11027.529 |
| 1354 | 11015.952 |
| 1355 | 11004.135 |
| 1356 | 10992.769 |
| 1357 | 10981.365 |
| 1358 | 10969.26 |
| 1359 | 10956.433 |
| 1360 | 10944.798 |
| 1361 | 10931.442 |
| 1362 | 10918.548 |
| 1363 | 10905.471 |
| 1364 | 10892.712 |
| 1365 | 10878.856 |
| 1366 | 10865.183 |
| 1367 | 10850.808 |
| 1368 | 10836.519 |
| 1369 | 10822.202 |
| 1370 | 10808.327 |
| 1371 | 10793.413 |
| 1372 | 10777.74 |
| 1373 | 10761.962 |
| 1374 | 10746.702 |
| 1375 | 10730.654 |
| 1376 | 10714.615 |
| 1377 | 10698.673 |
| 1378 | 10682.279 |
| 1379 | 10665.404 |
| 1380 | 10649.087 |
| 1381 | 10631.904 |
| 1382 | 10614.385 |
| 1383 | 10596.933 |
| 1384 | 10578.923 |
| 1385 | 10561.058 |
| 1386 | 10542.606 |
| 1387 | 10523.423 |
| 1388 | 10504.644 |
| 1389 | 10485 |
| 1390 | 10465.702 |
| 1391 | 10445.798 |
| 1392 | 10426.019 |
| 1393 | 10405.269 |
| 1394 | 10383.798 |
| 1395 | 10361.779 |
| 1396 | 10340.712 |
| 1397 | 10319.115 |
| 1398 | 10297.481 |
| 1399 | 10275.01 |
| 1400 | 10252.163 |
| 1401 | 10229 |
| 1402 | 10205.721 |
| 1403 | 10181.654 |
| 1404 | 10157.385 |
| 1405 | 10132.769 |
| 1406 | 10107.692 |
| 1407 | 10083.49 |
| 1408 | 10058.202 |
| 1409 | 10031.904 |
| 1410 | 10006.106 |
| 1411 | 9979.731 |
| 1412 | 9952.894 |
| 1413 | 9926.298 |
| 1414 | 9898.721 |
| 1415 | 9871.673 |
| 1416 | 9844.288 |
| 1417 | 9816.702 |
| 1418 | 9788.192 |
| 1419 | 9759.837 |
| 1420 | 9731.423 |
| 1421 | 9702.913 |
| 1422 | 9674.356 |
| 1423 | 9644.712 |
| 1424 | 9614.019 |
| 1425 | 9584.279 |
| 1426 | 9553.885 |
| 1427 | 9523.885 |
| 1428 | 9493.327 |
| 1429 | 9462.865 |
| 1430 | 9432.087 |
| 1431 | 9401.962 |
| 1432 | 9370.308 |
| 1433 | 9339.038 |
| 1434 | 9307.26 |
| 1435 | 9275 |
| 1436 | 9242.385 |
| 1437 | 9210.75 |
| 1438 | 9178.308 |
| 1439 | 9145.298 |
| 1440 | 9089.885 |
| 1441 | 9058.529 |
| 1442 | 9027.337 |
| 1443 | 8994.577 |
| 1444 | 8961.558 |
| 1445 | 8928.442 |
| 1446 | 8895.875 |
| 1447 | 8861.231 |
| 1448 | 8826.865 |
| 1449 | 8793.731 |
| 1450 | 8759.115 |
| 1451 | 8724.519 |
| 1452 | 8690.99 |
| 1453 | 8655.577 |
| 1454 | 8621.087 |
| 1455 | 8586.029 |
| 1456 | 8551.385 |
| 1457 | 8516.76 |
| 1458 | 8481.856 |
| 1459 | 8446.519 |
| 1460 | 8412.077 |
| 1461 | 8377.596 |
| 1462 | 8341.067 |
| 1463 | 8305.596 |
| 1464 | 8270.077 |
| 1465 | 8235.135 |
| 1466 | 8198.663 |
| 1467 | 8163.663 |
| 1468 | 8127.144 |
| 1469 | 8092.173 |
| 1470 | 8056.375 |
| 1471 | 8021.942 |
| 1472 | 7986.933 |
| 1473 | 7952.317 |
| 1474 | 7918.173 |
| 1475 | 7884.452 |
| 1476 | 7849.5 |
| 1477 | 7814.202 |
| 1478 | 7779.933 |
| 1479 | 7745.702 |
| 1480 | 7711.933 |
| 1481 | 7677.683 |
| 1482 | 7643.692 |
| 1483 | 7608.99 |
| 1484 | 7575.413 |
| 1485 | 7541.365 |
| 1486 | 7507.913 |
| 1487 | 7474.952 |
| 1488 | 7441.567 |
| 1489 | 7407.779 |
| 1490 | 7375.231 |
| 1491 | 7343.442 |
| 1492 | 7310.933 |
| 1493 | 7277.827 |
| 1494 | 7245.721 |
| 1495 | 7213.058 |
| 1496 | 7180.615 |
| 1497 | 7149.038 |
| 1498 | 7117.375 |
| 1499 | 7087.673 |
| 1500 | 7056.788 |
| 1501 | 7026.75 |
| 1502 | 6996.673 |
| 1503 | 6966.615 |
| 1504 | 6935.856 |
| 1505 | 6905.115 |
| 1506 | 6874.654 |
| 1507 | 6844.327 |
| 1508 | 6814.212 |
| 1509 | 6785.125 |
| 1510 | 6755.76 |
| 1511 | 6727.231 |
| 1512 | 6697.308 |
| 1513 | 6667.894 |
| 1514 | 6638.596 |
| 1515 | 6610.51 |
| 1516 | 6581.962 |
| 1517 | 6554.202 |
| 1518 | 6525.529 |
| 1519 | 6497.798 |
| 1520 | 6468.221 |
| 1521 | 6441.365 |
| 1522 | 6413.654 |
| 1523 | 6386.058 |
| 1524 | 6358.231 |
| 1525 | 6330.375 |
| 1526 | 6303.712 |
| 1527 | 6277.923 |
| 1528 | 6250.481 |
| 1529 | 6224.202 |
| 1530 | 6197.779 |
| 1531 | 6172.067 |
| 1532 | 6146.885 |
| 1533 | 6122.577 |
| 1534 | 6098.317 |
| 1535 | 6072.49 |
| 1536 | 6047.01 |
| 1537 | 6022.442 |
| 1538 | 5998.269 |
| 1539 | 5974.356 |
| 1540 | 5950.538 |
| 1541 | 5926.913 |
| 1542 | 5905.356 |
| 1543 | 5882.471 |
| 1544 | 5859.269 |
| 1545 | 5836.577 |
| 1546 | 5813.971 |
| 1547 | 5792.01 |
| 1548 | 5769.75 |
| 1549 | 5748.327 |
| 1550 | 5727.337 |
| 1551 | 5706.731 |
| 1552 | 5685.587 |
| 1553 | 5664.856 |
| 1554 | 5644.519 |
| 1555 | 5623.952 |
| 1556 | 5604.606 |
| 1557 | 5584.904 |
| 1558 | 5565.115 |
| 1559 | 5545.712 |
| 1560 | 5526.635 |
| 1561 | 5507.75 |
| 1562 | 5488.702 |
| 1563 | 5469.971 |
| 1564 | 5451.971 |
| 1565 | 5433.481 |
| 1566 | 5415.135 |
| 1567 | 5397.115 |
| 1568 | 5378.596 |
| 1569 | 5360.769 |
| 1570 | 5343.288 |
| 1571 | 5325.606 |
| 1572 | 5307.606 |
| 1573 | 5289.375 |
| 1574 | 5272.01 |
| 1575 | 5254.692 |
| 1576 | 5236.75 |
| 1577 | 5219.135 |
| 1578 | 5201.385 |
| 1579 | 5184.788 |
| 1580 | 5167.51 |
| 1581 | 5151.25 |
| 1582 | 5134.5 |
| 1583 | 5118.26 |
| 1584 | 5101.5 |
| 1585 | 5085.125 |
| 1586 | 5068.567 |
| 1587 | 5052.038 |
| 1588 | 5035.875 |
| 1589 | 5019.683 |
| 1590 | 5003.99 |
| 1591 | 4988.692 |
| 1592 | 4973.452 |
| 1593 | 4958.548 |
| 1594 | 4942.548 |
| 1595 | 4926.904 |
| 1596 | 4912.135 |
| 1597 | 4897.788 |
| 1598 | 4883.221 |
| 1599 | 4869.26 |
| 1600 | 4855.317 |
| 1601 | 4841.154 |
| 1602 | 4827.808 |
| 1603 | 4813.519 |
| 1604 | 4799.385 |
| 1605 | 4785.183 |
| 1606 | 4770.846 |
| 1607 | 4757.26 |
| 1608 | 4744.375 |
| 1609 | 4731.24 |
| 1610 | 4718.01 |
| 1611 | 4704.779 |
| 1612 | 4691.654 |
| 1613 | 4679.24 |
| 1614 | 4666.538 |
| 1615 | 4654.221 |
| 1616 | 4641.788 |
| 1617 | 4628.837 |
| 1618 | 4617.048 |
| 1619 | 4604.769 |
| 1620 | 4592.538 |
| 1621 | 4580.183 |
| 1622 | 4568.606 |
| 1623 | 4557.173 |
| 1624 | 4545.087 |
| 1625 | 4534.385 |
| 1626 | 4523.731 |
| 1627 | 4513.298 |
| 1628 | 4501.308 |
| 1629 | 4490.75 |
| 1630 | 4480.048 |
| 1631 | 4469.788 |
| 1632 | 4459.346 |
| 1633 | 4448.346 |
| 1634 | 4437.894 |
| 1635 | 4427.635 |
| 1636 | 4416.952 |
| 1637 | 4407.462 |
| 1638 | 4398.029 |
| 1639 | 4388.337 |
| 1640 | 4378.692 |
| 1641 | 4368.75 |
| 1642 | 4358.731 |
| 1643 | 4349.423 |
| 1644 | 4339.885 |
| 1645 | 4330.615 |
| 1646 | 4321.721 |
| 1647 | 4312.327 |
| 1648 | 4303.279 |
| 1649 | 4294.606 |
| 1650 | 4285.635 |
| 1651 | 4276.365 |
| 1652 | 4267.654 |
| 1653 | 4259.933 |
| 1654 | 4250.971 |
| 1655 | 4242.452 |
| 1656 | 4234.596 |
| 1657 | 4226.221 |
| 1658 | 4218.106 |
| 1659 | 4210.452 |
| 1660 | 4202.394 |
| 1661 | 4194.962 |
| 1662 | 4187.337 |
| 1663 | 4179.058 |
| 1664 | 4171.471 |
| 1665 | 4163.221 |
| 1666 | 4155.413 |
| 1667 | 4147.942 |
| 1668 | 4140.433 |
| 1669 | 4132.346 |
| 1670 | 4125.308 |
| 1671 | 4118.288 |
| 1672 | 4111.75 |
| 1673 | 4105.394 |
| 1674 | 4098.74 |
| 1675 | 4092.442 |
| 1676 | 4085.981 |
| 1677 | 4079.163 |
| 1678 | 4072.577 |
| 1679 | 4066.183 |
| 1680 | 4059.817 |
| 1681 | 4053.288 |
| 1682 | 4047.202 |
| 1683 | 4041.317 |
| 1684 | 4035.99 |
| 1685 | 4030.519 |
| 1686 | 4024.702 |
| 1687 | 4018.971 |
| 1688 | 4013.442 |
| 1689 | 4007.519 |
| 1690 | 4001.846 |
| 1691 | 3995.75 |
| 1692 | 3989.817 |
| 1693 | 3983.952 |
| 1694 | 3978.356 |
| 1695 | 3972.538 |
| 1696 | 3966.481 |
| 1697 | 3960.779 |
| 1698 | 3954.606 |
| 1699 | 3948.529 |
| 1700 | 3942.721 |
| 1701 | 3936.308 |
| 1702 | 3930.904 |
| 1703 | 3923.673 |
| 1704 | 3917.49 |
| 1705 | 3911.798 |
| 1706 | 3906.058 |
| 1707 | 3900.154 |
| 1708 | 3894.856 |
| 1709 | 3889.702 |
| 1710 | 3884.702 |
| 1711 | 3880.115 |
| 1712 | 3875.115 |
| 1713 | 3870.894 |
| 1714 | 3866.51 |
| 1715 | 3863.577 |
| 1716 | 3860.346 |
| 1717 | 3857.356 |
| 1718 | 3853.529 |
| 1719 | 3852.192 |
| 1720 | 3849.827 |
| 1721 | 3847.981 |
| 1722 | 3846.038 |
| 1723 | 3845.875 |
| 1724 | 3846.25 |
| 1725 | 3845.452 |
| 1726 | 3845.337 |
| 1727 | 3845.788 |
| 1728 | 3845.712 |
| 1729 | 3846.769 |
| 1730 | 3847.75 |
| 1731 | 3849.846 |
| 1732 | 3851.74 |
| 1733 | 3853.471 |
| 1734 | 3855.971 |
| 1735 | 3859.01 |
| 1736 | 3861.269 |
| 1737 | 3863.798 |
| 1738 | 3866.635 |
| 1739 | 3869.865 |
| 1740 | 3873.327 |
| 1741 | 3877.327 |
| 1742 | 3882.308 |
| 1743 | 3888.24 |
| 1744 | 3894.904 |
| 1745 | 3901.26 |
| 1746 | 3908.894 |
| 1747 | 3916.192 |
| 1748 | 3923.49 |
| 1749 | 3930.952 |
| 1750 | 3939.856 |
| 1751 | 3949.683 |
| 1752 | 3960.442 |
| 1753 | 3969.529 |
| 1754 | 3980.558 |
| 1755 | 3991.702 |
| 1756 | 4004.25 |
| 1757 | 4017.452 |
| 1758 | 4030.529 |
| 1759 | 4043.981 |
| 1760 | 4057.769 |
| 1761 | 4072.048 |
| 1762 | 4087.125 |
| 1763 | 4102.702 |
| 1764 | 4118.115 |
| 1765 | 4134.029 |
| 1766 | 4151.269 |
| 1767 | 4168.885 |
| 1768 | 4187.519 |
| 1769 | 4206.106 |
| 1770 | 4227.663 |
| 1771 | 4248.971 |
| 1772 | 4271.798 |
| 1773 | 4296.519 |
| 1774 | 4321.904 |
| 1775 | 4347.163 |
| 1776 | 4373.115 |
| 1777 | 4400.5 |
| 1778 | 4428.038 |
| 1779 | 4456.385 |
| 1780 | 4484.971 |
| 1781 | 4512.769 |
| 1782 | 4540.346 |
| 1783 | 4569.269 |
| 1784 | 4599.077 |
| 1785 | 4629.25 |
| 1786 | 4660.279 |
| 1787 | 4691.231 |
| 1788 | 4723.163 |
| 1789 | 4755.038 |
| 1790 | 4786.308 |
| 1791 | 4815.644 |
| 1792 | 4845.788 |
| 1793 | 4875.548 |
| 1794 | 4905.269 |
| 1795 | 4934.51 |
| 1796 | 4964.413 |
| 1797 | 4994.673 |
| 1798 | 5023.923 |
| 1799 | 5054.087 |
| 1800 | 5083.413 |
| 1801 | 5114.163 |
| 1802 | 5144.212 |
| 1803 | 5175.587 |
| 1804 | 5207.01 |
| 1805 | 5238.663 |
| 1806 | 5271.269 |
| 1807 | 5303.221 |
| 1808 | 5336.615 |
| 1809 | 5369.423 |
| 1810 | 5405.269 |
| 1811 | 5440.221 |
| 1812 | 5476.587 |
| 1813 | 5514.067 |
| 1814 | 5552.596 |
| 1815 | 5591.173 |
| 1816 | 5630.471 |
| 1817 | 5670.125 |
| 1818 | 5710.635 |
| 1819 | 5751.212 |
| 1820 | 5792.74 |
| 1821 | 5835.212 |
| 1822 | 5878.404 |
| 1823 | 5921.173 |
| 1824 | 5965.279 |
| 1825 | 6010.202 |
| 1826 | 6055.173 |
| 1827 | 6098.663 |
| 1828 | 6142.798 |
| 1829 | 6189.038 |
| 1830 | 6233.913 |
| 1831 | 6277.846 |
| 1832 | 6323.317 |
| 1833 | 6370.212 |
| 1834 | 6417.923 |
| 1835 | 6466.288 |
| 1836 | 6516.76 |
| 1837 | 6567.933 |
| 1838 | 6618.981 |
| 1839 | 6669.413 |
| 1840 | 6720.163 |
| 1841 | 6772.375 |
| 1842 | 6823.481 |
| 1843 | 6875.913 |
| 1844 | 6929.327 |
| 1845 | 6983.202 |
| 1846 | 7033.75 |
| 1847 | 7085.721 |
| 1848 | 7137.635 |
| 1849 | 7187.077 |
| 1850 | 7235.548 |
| 1851 | 7282.077 |
| 1852 | 7330.269 |
| 1853 | 7377.346 |
| 1854 | 7421.375 |
| 1855 | 7466.24 |
| 1856 | 7509.163 |
| 1857 | 7551.106 |
| 1858 | 7593.058 |
| 1859 | 7634.625 |
| 1860 | 7676.26 |
| 1861 | 7718.51 |
| 1862 | 7758.894 |
| 1863 | 7799.933 |
| 1864 | 7840.413 |
| 1865 | 7881.538 |
| 1866 | 7923.346 |
| 1867 | 7965.894 |
| 1868 | 8009.346 |
| 1869 | 8053.394 |
| 1870 | 8096.635 |
| 1871 | 8140.077 |
| 1872 | 8184.288 |
| 1873 | 8228.596 |
| 1874 | 8273.817 |
| 1875 | 8318.183 |
| 1876 | 8362.317 |
| 1877 | 8405.471 |
| 1878 | 8448.856 |
| 1879 | 8493.356 |
| 1880 | 8536.904 |
| 1881 | 8580.817 |
| 1882 | 8623.433 |
| 1883 | 8665.067 |
| 1884 | 8706.24 |
| 1885 | 8748.75 |
| 1886 | 8789.971 |
| 1887 | 8831.01 |
| 1888 | 8872 |
| 1889 | 8912.548 |
| 1890 | 8952.019 |
| 1891 | 8992.163 |
| 1892 | 9031.548 |
| 1893 | 9069.067 |
| 1894 | 9107.702 |
| 1895 | 9145.865 |
| 1896 | 9183.606 |
| 1897 | 9221.279 |
| 1898 | 9259.404 |
| 1899 | 9296.279 |
| 1900 | 9332.558 |
| 1901 | 9368.423 |
| 1902 | 9404.058 |
| 1903 | 9438.798 |
| 1904 | 9473 |
| 1905 | 9505.087 |
| 1906 | 9539.75 |
| 1907 | 9572.481 |
| 1908 | 9603.788 |
| 1909 | 9635.721 |
| 1910 | 9666.385 |
| 1911 | 9696.981 |
| 1912 | 9728.183 |
| 1913 | 9758.721 |
| 1914 | 9788.087 |
| 1915 | 9816.202 |
| 1916 | 9843.635 |
| 1917 | 9871.567 |
| 1918 | 9898.885 |
| 1919 | 9926.558 |
| 1920 | 9953.183 |
| 1921 | 9979.26 |
| 1922 | 10004.606 |
| 1923 | 10030.288 |
| 1924 | 10055.567 |
| 1925 | 10080.115 |
| 1926 | 10105.587 |
| 1927 | 10131.385 |
| 1928 | 10155.933 |
| 1929 | 10182.798 |
| 1930 | 10207.308 |
| 1931 | 10231.298 |
| 1932 | 10254.221 |
| 1933 | 10277.942 |
| 1934 | 10301.971 |
| 1935 | 10325.558 |
| 1936 | 10349.606 |
| 1937 | 10372.644 |
| 1938 | 10395.712 |
| 1939 | 10420.356 |
| 1940 | 10443.192 |
| 1941 | 10465.337 |
| 1942 | 10487.202 |
| 1943 | 10508.212 |
| 1944 | 10529.596 |
| 1945 | 10549.769 |
| 1946 | 10569.5 |
| 1947 | 10589.798 |
| 1948 | 10609.24 |
| 1949 | 10628.567 |
| 1950 | 10647.125 |
| 1951 | 10664.894 |
| 1952 | 10683.683 |
| 1953 | 10701.5 |
| 1954 | 10719.452 |
| 1955 | 10736.433 |
| 1956 | 10754.346 |
| 1957 | 10771.26 |
| 1958 | 10787.827 |
| 1959 | 10803.904 |
| 1960 | 10820.837 |
| 1961 | 10836.808 |
| 1962 | 10852.365 |
| 1963 | 10867.577 |
| 1964 | 10882.99 |
| 1965 | 10897.375 |
| 1966 | 10911.827 |
| 1967 | 10926.394 |
| 1968 | 10940.144 |
| 1969 | 10954.51 |
| 1970 | 10968.981 |
| 1971 | 10982.096 |
| 1972 | 10995.317 |
| 1973 | 11008.048 |
| 1974 | 11020.577 |
| 1975 | 11032.798 |
| 1976 | 11045.346 |
| 1977 | 11057.481 |
| 1978 | 11068.567 |
| 1979 | 11079.894 |
| 1980 | 11091.125 |
| 1981 | 11101.596 |
| 1982 | 11112.769 |
| 1983 | 11124.058 |
| 1984 | 11135 |
| 1985 | 11145.769 |
| 1986 | 11156.731 |
| 1987 | 11167.317 |
| 1988 | 11177.827 |
| 1989 | 11188.692 |
| 1990 | 11199.183 |
| 1991 | 11209.635 |
| 1992 | 11219.5 |
| 1993 | 11230.192 |
| 1994 | 11240.529 |
| 1995 | 11250.096 |
| 1996 | 11260.74 |
| 1997 | 11269.904 |
| 1998 | 11279.692 |
| 1999 | 11289.337 |
| 2000 | 11298.769 |
| 2001 | 11307.654 |
| 2002 | 11316.385 |
| 2003 | 11324.673 |
| 2004 | 11333.298 |
| 2005 | 11341.615 |
| 2006 | 11349.846 |
| 2007 | 11357.635 |
| 2008 | 11365.692 |
| 2009 | 11373.558 |
| 2010 | 11381.317 |
| 2011 | 11388.702 |
| 2012 | 11396.163 |
| 2013 | 11402.971 |
| 2014 | 11410.058 |
| 2015 | 11416.356 |
| 2016 | 11423.442 |
| 2017 | 11429.971 |
| 2018 | 11437.077 |
| 2019 | 11443.913 |
| 2020 | 11450.606 |
| 2021 | 11457.394 |
| 2022 | 11463.808 |
| 2023 | 11470.279 |
| 2024 | 11476.74 |
| 2025 | 11483.106 |
| 2026 | 11489.442 |
| 2027 | 11494.702 |
| 2028 | 11500.769 |
| 2029 | 11506.625 |
| 2030 | 11511.933 |
| 2031 | 11517.25 |
| 2032 | 11522.048 |
| 2033 | 11526.933 |
| 2034 | 11531.567 |
| 2035 | 11536 |
| 2036 | 11540.538 |
| 2037 | 11544.529 |
| 2038 | 11548.683 |
| 2039 | 11552.769 |
| 2040 | 11556.875 |
| 2041 | 11560.769 |
| 2042 | 11564.221 |
| 2043 | 11567.538 |
| 2044 | 11571.721 |
| 2045 | 11575.087 |
| 2046 | 11579.125 |
| 2047 | 11582.356 |
| 2048 | 11586 |
| 2049 | 11589.769 |
| 2050 | 11592.625 |
| 2051 | 11596.356 |
| 2052 | 11600.173 |
| 2053 | 11603.683 |
| 2054 | 11607.144 |
| 2055 | 11610.885 |
| 2056 | 11614.01 |
| 2057 | 11617.904 |
| 2058 | 11620.904 |
| 2059 | 11624.135 |
| 2060 | 11626.875 |
| 2061 | 11629.798 |
| 2062 | 11633.519 |
| 2063 | 11636.894 |
| 2064 | 11640.115 |
| 2065 | 11643.308 |
| 2066 | 11646.538 |
| 2067 | 11649.788 |
| 2068 | 11652.192 |
| 2069 | 11655.077 |
| 2070 | 11658.173 |
| 2071 | 11660.817 |
| 2072 | 11663.827 |
| 2073 | 11666.49 |
| 2074 | 11669.529 |
| 2075 | 11672.067 |
| 2076 | 11674.625 |
| 2077 | 11677.49 |
| 2078 | 11680.019 |
| 2079 | 11682.471 |
| 2080 | 11685.25 |
| 2081 | 11687.75 |
| 2082 | 11690.49 |
| 2083 | 11693.25 |
| 2084 | 11695.394 |
| 2085 | 11696.981 |
| 2086 | 11699.154 |
| 2087 | 11701.529 |
| 2088 | 11703.327 |
| 2089 | 11705.817 |
| 2090 | 11707.654 |
| 2091 | 11709.01 |
| 2092 | 11710.154 |
| 2093 | 11712.106 |
| 2094 | 11713.298 |
| 2095 | 11714.837 |
| 2096 | 11716.644 |
| 2097 | 11718.067 |
| 2098 | 11718.76 |
| 2099 | 11720.019 |
| 2100 | 11721.548 |
| 2101 | 11722.683 |
| 2102 | 11723.75 |
| 2103 | 11724.654 |
| 2104 | 11725.702 |
| 2105 | 11726.99 |
| 2106 | 11728.327 |
| 2107 | 11729.346 |
| 2108 | 11730.183 |
| 2109 | 11730.644 |
| 2110 | 11731.76 |
| 2111 | 11733.385 |
| 2112 | 11734.856 |
| 2113 | 11735.49 |
| 2114 | 11736.51 |
| 2115 | 11737.606 |
| 2116 | 11738.385 |
| 2117 | 11739.356 |
| 2118 | 11740.163 |
| 2119 | 11741.788 |
| 2120 | 11742.625 |
| 2121 | 11743.606 |
| 2122 | 11744.413 |
| 2123 | 11745.519 |
| 2124 | 11746.173 |
| 2125 | 11747.077 |
| 2126 | 11748.135 |
| 2127 | 11748.942 |
| 2128 | 11749.846 |
| 2129 | 11750.731 |
| 2130 | 11751.298 |
| 2131 | 11752.577 |
| 2132 | 11752.769 |
| 2133 | 11753.644 |
| 2134 | 11754.885 |
| 2135 | 11755.49 |
| 2136 | 11755.942 |
| 2137 | 11756.981 |
| 2138 | 11757.683 |
| 2139 | 11758.952 |
| 2140 | 11759.971 |
| 2141 | 11760.74 |
| 2142 | 11761.212 |
| 2143 | 11762.019 |
| 2144 | 11762.048 |
| 2145 | 11762.798 |
| 2146 | 11763.413 |
| 2147 | 11763.933 |
| 2148 | 11764.26 |
| 2149 | 11764.615 |
| 2150 | 11765.029 |
| 2151 | 11765.192 |
| 2152 | 11765.212 |
| 2153 | 11765.327 |
| 2154 | 11765.49 |
| 2155 | 11765.471 |
| 2156 | 11765.471 |
| 2157 | 11764.846 |
| 2158 | 11764.231 |
| 2159 | 11764.125 |
| 2160 | 11763.606 |
| 2161 | 11762.942 |
| 2162 | 11762.51 |
| 2163 | 11762.144 |
| 2164 | 11761.654 |
| 2165 | 11760.817 |
| 2166 | 11760.413 |
| 2167 | 11759.673 |
| 2168 | 11759.702 |
| 2169 | 11759.288 |
| 2170 | 11758.75 |
| 2171 | 11758.183 |
| 2172 | 11757.837 |
| 2173 | 11757.154 |
| 2174 | 11756.567 |
| 2175 | 11755.298 |
| 2176 | 11754.5 |
| 2177 | 11753.692 |
| 2178 | 11752.885 |
| 2179 | 11751.981 |
| 2180 | 11750.221 |
| 2181 | 11748.875 |
| 2182 | 11747.625 |
| 2183 | 11745.933 |
| 2184 | 11744.981 |
| 2185 | 11743.106 |
| 2186 | 11741.712 |
| 2187 | 11739.731 |
| 2188 | 11738.019 |
| 2189 | 11736.01 |
| 2190 | 11734.163 |
| 2191 | 11732.452 |
| 2192 | 11730.048 |
| 2193 | 11727.827 |
| 2194 | 11725.798 |
| 2195 | 11723.731 |
| 2196 | 11721.519 |
| 2197 | 11719.519 |
| 2198 | 11717.077 |
| 2199 | 11714.779 |
| 2200 | 11712.74 |
| 2201 | 11710.99 |
| 2202 | 11708.952 |
| 2203 | 11706.865 |
| 2204 | 11704.846 |
| 2205 | 11702.269 |
| 2206 | 11699.933 |
| 2207 | 11697.74 |
| 2208 | 11694.856 |
| 2209 | 11692.731 |
| 2210 | 11690.135 |
| 2211 | 11687.394 |
| 2212 | 11684.096 |
| 2213 | 11680.788 |
| 2214 | 11677.673 |
| 2215 | 11674.279 |
| 2216 | 11669.567 |
| 2217 | 11666.356 |
| 2218 | 11662.567 |
| 2219 | 11658.673 |
| 2220 | 11654.683 |
| 2221 | 11650.135 |
| 2222 | 11645.875 |
| 2223 | 11641.846 |
| 2224 | 11637.692 |
| 2225 | 11634.481 |
| 2226 | 11630.769 |
| 2227 | 11626.788 |
| 2228 | 11623.442 |
| 2229 | 11619.192 |
| 2230 | 11615.75 |
| 2231 | 11611.654 |
| 2232 | 11607.365 |
| 2233 | 11603.029 |
| 2234 | 11598.606 |
| 2235 | 11594.452 |
| 2236 | 11590.702 |
| 2237 | 11586.365 |
| 2238 | 11581.875 |
| 2239 | 11578.019 |
| 2240 | 11573.471 |
| 2241 | 11569 |
| 2242 | 11564.731 |
| 2243 | 11560.067 |
| 2244 | 11555.163 |
| 2245 | 11549.692 |
| 2246 | 11545.212 |
| 2247 | 11540.423 |
| 2248 | 11535.615 |
| 2249 | 11530.308 |
| 2250 | 11524.885 |
| 2251 | 11519.596 |
| 2252 | 11514.808 |
| 2253 | 11508.99 |
| 2254 | 11503.558 |
| 2255 | 11498.067 |
| 2256 | 11492.269 |
| 2257 | 11487.096 |
| 2258 | 11481.548 |
| 2259 | 11475.596 |
| 2260 | 11470.442 |
| 2261 | 11463.942 |
| 2262 | 11457.779 |
| 2263 | 11451.096 |
| 2264 | 11444.231 |
| 2265 | 11437.721 |
| 2266 | 11430.942 |
| 2267 | 11423.51 |
| 2268 | 11415.433 |
| 2269 | 11408.154 |
| 2270 | 11400.096 |
| 2271 | 11390.779 |
| 2272 | 11382.308 |
| 2273 | 11373.337 |
| 2274 | 11364.269 |
| 2275 | 11355.067 |
| 2276 | 11345.837 |
| 2277 | 11335.856 |
| 2278 | 11326.192 |
| 2279 | 11316.356 |
| 2280 | 11305.923 |
| 2281 | 11296.452 |
| 2282 | 11285.808 |
| 2283 | 11276.048 |
| 2284 | 11266.529 |
| 2285 | 11256.654 |
| 2286 | 11246.846 |
| 2287 | 11236.279 |
| 2288 | 11227.962 |
| 2289 | 11217.779 |
| 2290 | 11207.548 |
| 2291 | 11197.76 |
| 2292 | 11187.558 |
| 2293 | 11177.413 |
| 2294 | 11166.692 |
| 2295 | 11155.538 |
| 2296 | 11143.846 |
| 2297 | 11132.029 |
| 2298 | 11120.567 |
| 2299 | 11109.048 |
| 2300 | 11096.385 |
| 2301 | 11083.606 |
| 2302 | 11070.337 |
| 2303 | 11057.183 |
| 2304 | 11043.115 |
| 2305 | 11029.942 |
| 2306 | 11015.519 |
| 2307 | 11000.99 |
| 2308 | 10986.135 |
| 2309 | 10972.231 |
| 2310 | 10957.827 |
| 2311 | 10943.01 |
| 2312 | 10927.856 |
| 2313 | 10913.423 |
| 2314 | 10898.356 |
| 2315 | 10882.163 |
| 2316 | 10866.125 |
| 2317 | 10850.135 |
| 2318 | 10834.26 |
| 2319 | 10818.087 |
| 2320 | 10801.442 |
| 2321 | 10784.394 |
| 2322 | 10766.913 |
| 2323 | 10749.971 |
| 2324 | 10731.788 |
| 2325 | 10713.731 |
| 2326 | 10695.394 |
| 2327 | 10676.365 |
| 2328 | 10656.731 |
| 2329 | 10636.635 |
| 2330 | 10615.337 |
| 2331 | 10594.981 |
| 2332 | 10574.49 |
| 2333 | 10553.971 |
| 2334 | 10532.712 |
| 2335 | 10511.702 |
| 2336 | 10489.837 |
| 2337 | 10468.798 |
| 2338 | 10446.452 |
| 2339 | 10423.5 |
| 2340 | 10400.721 |
| 2341 | 10379.452 |
| 2342 | 10356.269 |
| 2343 | 10333.288 |
| 2344 | 10312.135 |
| 2345 | 10290.337 |
| 2346 | 10268.49 |
| 2347 | 10246.24 |
| 2348 | 10224.577 |
| 2349 | 10202.558 |
| 2350 | 10181.577 |
| 2351 | 10158.106 |
| 2352 | 10134.74 |
| 2353 | 10111.673 |
| 2354 | 10086.981 |
| 2355 | 10063.163 |
| 2356 | 10037.308 |
| 2357 | 10011.913 |
| 2358 | 9986.683 |
| 2359 | 9960.538 |
| 2360 | 9932.981 |
| 2361 | 9905.25 |
| 2362 | 9877.029 |
| 2363 | 9847.423 |
| 2364 | 9818.808 |
| 2365 | 9789.644 |
| 2366 | 9759.683 |
| 2367 | 9730.019 |
| 2368 | 9699.144 |
| 2369 | 9669.087 |
| 2370 | 9638 |
| 2371 | 9606.5 |
| 2372 | 9573.875 |
| 2373 | 9541.481 |
| 2374 | 9509.163 |
| 2375 | 9476.702 |
| 2376 | 9442.808 |
| 2377 | 9409.221 |
| 2378 | 9375.163 |
| 2379 | 9338.817 |
| 2380 | 9303.971 |
| 2381 | 9269 |
| 2382 | 9231.663 |
| 2383 | 9195.846 |
| 2384 | 9157.981 |
| 2385 | 9120.846 |
| 2386 | 9082.865 |
| 2387 | 9044.471 |
| 2388 | 9005.644 |
| 2389 | 8965.308 |
| 2390 | 8924.135 |
| 2391 | 8884.346 |
| 2392 | 8842.577 |
| 2393 | 8801.01 |
| 2394 | 8759.048 |
| 2395 | 8717.933 |
| 2396 | 8674.25 |
| 2397 | 8633.952 |
| 2398 | 8591.74 |
| 2399 | 8550.981 |
| 2400 | 8509.433 |
| 2401 | 8470.481 |
| 2402 | 8430.49 |
| 2403 | 8392.337 |
| 2404 | 8355.865 |
| 2405 | 8320.529 |
| 2406 | 8284.74 |
| 2407 | 8250.173 |
| 2408 | 8214.163 |
| 2409 | 8179.327 |
| 2410 | 8144.75 |
| 2411 | 8111.067 |
| 2412 | 8076.875 |
| 2413 | 8041.673 |
| 2414 | 8007.096 |
| 2415 | 7974.337 |
| 2416 | 7940.519 |
| 2417 | 7906.394 |
| 2418 | 7873.577 |
| 2419 | 7838.221 |
| 2420 | 7802.76 |
| 2421 | 7767.913 |
| 2422 | 7732.856 |
| 2423 | 7699.288 |
| 2424 | 7665.577 |
| 2425 | 7632.192 |
| 2426 | 7600.346 |
| 2427 | 7569.51 |
| 2428 | 7539.654 |
| 2429 | 7511.385 |
| 2430 | 7482.654 |
| 2431 | 7454.365 |
| 2432 | 7428.942 |
| 2433 | 7405.106 |
| 2434 | 7379.587 |
| 2435 | 7356.567 |
| 2436 | 7334.26 |
| 2437 | 7313.856 |
| 2438 | 7293.885 |
| 2439 | 7275.808 |
| 2440 | 7257.971 |
| 2441 | 7241.202 |
| 2442 | 7224.885 |
| 2443 | 7211.788 |
| 2444 | 7196.923 |
| 2445 | 7184.635 |
| 2446 | 7174.115 |
| 2447 | 7163.875 |
| 2448 | 7156.51 |
| 2449 | 7150.962 |
| 2450 | 7147.875 |
| 2451 | 7145.192 |
| 2452 | 7143.76 |
| 2453 | 7146.731 |
| 2454 | 7150.779 |
| 2455 | 7158.587 |
| 2456 | 7168.221 |
| 2457 | 7182.529 |
| 2458 | 7199.019 |
| 2459 | 7217.288 |
| 2460 | 7238.279 |
| 2461 | 7262.692 |
| 2462 | 7293.029 |
| 2463 | 7325.875 |
| 2464 | 7361.452 |
| 2465 | 7400.529 |
| 2466 | 7444.077 |
| 2467 | 7489.615 |
| 2468 | 7536.019 |
| 2469 | 7585.798 |
| 2470 | 7635.279 |
| 2471 | 7688.606 |
| 2472 | 7742.769 |
| 2473 | 7798 |
| 2474 | 7852.654 |
| 2475 | 7910.288 |
| 2476 | 7967.721 |
| 2477 | 8024.529 |
| 2478 | 8081 |
| 2479 | 8139.49 |
| 2480 | 8198.519 |
| 2481 | 8253.308 |
| 2482 | 8309.183 |
| 2483 | 8365.288 |
| 2484 | 8421.423 |
| 2485 | 8477.529 |
| 2486 | 8531.74 |
| 2487 | 8584.644 |
| 2488 | 8637.029 |
| 2489 | 8690.702 |
| 2490 | 8742.337 |
| 2491 | 8795.106 |
| 2492 | 8847.087 |
| 2493 | 8899.702 |
| 2494 | 8951.712 |
| 2495 | 9004.058 |
| 2496 | 9054.923 |
| 2497 | 9105.817 |
| 2498 | 9157.442 |
| 2499 | 9208.885 |
| 2500 | 9259.683 |
| 2501 | 9310.923 |
| 2502 | 9360.606 |
| 2503 | 9411.087 |
| 2504 | 9458.933 |
| 2505 | 9506.587 |
| 2506 | 9552.067 |
| 2507 | 9598.413 |
| 2508 | 9644.683 |
| 2509 | 9689.683 |
| 2510 | 9734.269 |
| 2511 | 9778.51 |
| 2512 | 9821.5 |
| 2513 | 9864.096 |
| 2514 | 9906.769 |
| 2515 | 9947.144 |
| 2516 | 9987.644 |
| 2517 | 10026.913 |
| 2518 | 10065.846 |
| 2519 | 10105.952 |
| 2520 | 10144.875 |
| 2521 | 10183.577 |
| 2522 | 10221.846 |
| 2523 | 10259.288 |
| 2524 | 10295.337 |
| 2525 | 10331.606 |
| 2526 | 10367.76 |
| 2527 | 10404.125 |
| 2528 | 10440.279 |
| 2529 | 10476.01 |
| 2530 | 10509.712 |
| 2531 | 10543.298 |
| 2532 | 10577.971 |
| 2533 | 10610.202 |
| 2534 | 10641.76 |
| 2535 | 10673.183 |
| 2536 | 10704.423 |
| 2537 | 10735.394 |
| 2538 | 10764.337 |
| 2539 | 10792.894 |
| 2540 | 10822.587 |
| 2541 | 10850.154 |
| 2542 | 10877.51 |
| 2543 | 10904.433 |
| 2544 | 10929.51 |
| 2545 | 10954.654 |
| 2546 | 10978.058 |
| 2547 | 11002.029 |
| 2548 | 11025.029 |
| 2549 | 11047.048 |
| 2550 | 11069.26 |
| 2551 | 11089.779 |
| 2552 | 11111.442 |
| 2553 | 11132.452 |
| 2554 | 11152.481 |
| 2555 | 11172.317 |
| 2556 | 11191.135 |
| 2557 | 11210.923 |
| 2558 | 11229.683 |
| 2559 | 11248.144 |
| 2560 | 11266.817 |
| 2561 | 11283.827 |
| 2562 | 11300.385 |
| 2563 | 11317.721 |
| 2564 | 11333.827 |
| 2565 | 11350.279 |
| 2566 | 11365.827 |
| 2567 | 11381.337 |
| 2568 | 11395.625 |
| 2569 | 11410.269 |
| 2570 | 11425.106 |
| 2571 | 11439.913 |
| 2572 | 11453.952 |
| 2573 | 11467.75 |
| 2574 | 11480.769 |
| 2575 | 11493.048 |
| 2576 | 11505.231 |
| 2577 | 11517.212 |
| 2578 | 11528.077 |
| 2579 | 11539.135 |
| 2580 | 11550.288 |
| 2581 | 11561.606 |
| 2582 | 11572.663 |
| 2583 | 11583.529 |
| 2584 | 11594.346 |
| 2585 | 11604.769 |
| 2586 | 11615.442 |
| 2587 | 11625.413 |
| 2588 | 11636.423 |
| 2589 | 11646.846 |
| 2590 | 11656.538 |
| 2591 | 11667.019 |
| 2592 | 11676.779 |
| 2593 | 11686.5 |
| 2594 | 11697.125 |
| 2595 | 11706.894 |
| 2596 | 11716.529 |
| 2597 | 11725.558 |
| 2598 | 11734.74 |
| 2599 | 11743.769 |
| 2600 | 11751.971 |
| 2601 | 11760.423 |
| 2602 | 11768.673 |
| 2603 | 11776.99 |
| 2604 | 11784.827 |
| 2605 | 11791.779 |
| 2606 | 11798.433 |
| 2607 | 11805.519 |
| 2608 | 11812.183 |
| 2609 | 11818.721 |
| 2610 | 11825.692 |
| 2611 | 11831.548 |
| 2612 | 11837 |
| 2613 | 11842.596 |
| 2614 | 11848.346 |
| 2615 | 11853.798 |
| 2616 | 11859.942 |
| 2617 | 11864.885 |
| 2618 | 11870.01 |
| 2619 | 11875.058 |
| 2620 | 11880.288 |
| 2621 | 11884.923 |
| 2622 | 11889.25 |
| 2623 | 11893.019 |
| 2624 | 11896.904 |
| 2625 | 11901.029 |
| 2626 | 11904.635 |
| 2627 | 11908.683 |
| 2628 | 11912.115 |
| 2629 | 11916.058 |
| 2630 | 11919.923 |
| 2631 | 11923.452 |
| 2632 | 11926.577 |
| 2633 | 11929.462 |
| 2634 | 11932.779 |
| 2635 | 11935.394 |
| 2636 | 11938.808 |
| 2637 | 11941.404 |
| 2638 | 11943.538 |
| 2639 | 11945.846 |
| 2640 | 11948.394 |
| 2641 | 11950.298 |
| 2642 | 11952.875 |
| 2643 | 11955.25 |
| 2644 | 11958.135 |
| 2645 | 11960.51 |
| 2646 | 11962.817 |
| 2647 | 11964.846 |
| 2648 | 11967.712 |
| 2649 | 11970.423 |
| 2650 | 11972.913 |
| 2651 | 11975.721 |
| 2652 | 11977.904 |
| 2653 | 11980.587 |
| 2654 | 11982.904 |
| 2655 | 11985.202 |
| 2656 | 11987.385 |
| 2657 | 11988.952 |
| 2658 | 11991.288 |
| 2659 | 11992.183 |
| 2660 | 11994.029 |
| 2661 | 11995.548 |
| 2662 | 11997.144 |
| 2663 | 11998.596 |
| 2664 | 11999.817 |
| 2665 | 12001.192 |
| 2666 | 12001.885 |
| 2667 | 12003.269 |
| 2668 | 12003.606 |
| 2669 | 12004.692 |
| 2670 | 12005.904 |
| 2671 | 12006.731 |
| 2672 | 12007.375 |
| 2673 | 12008.067 |
| 2674 | 12008.663 |
| 2675 | 12009.212 |
| 2676 | 12008.904 |
| 2677 | 12010.135 |
| 2678 | 12010.038 |
| 2679 | 12009.933 |
| 2680 | 12009.654 |
| 2681 | 12009.442 |
| 2682 | 12009.5 |
| 2683 | 12009.923 |
| 2684 | 12009.952 |
| 2685 | 12009.375 |
| 2686 | 12009.49 |
| 2687 | 12009.423 |
| 2688 | 12009.24 |
| 2689 | 12008.942 |
| 2690 | 12008.356 |
| 2691 | 12007.731 |
| 2692 | 12007.433 |
| 2693 | 12007.135 |
| 2694 | 12006.317 |
| 2695 | 12005.471 |
| 2696 | 12005.433 |
| 2697 | 12004.942 |
| 2698 | 12004.24 |
| 2699 | 12004.048 |
| 2700 | 12003.442 |
| 2701 | 12002.875 |
| 2702 | 12002.144 |
| 2703 | 12001.74 |
| 2704 | 12000.596 |
| 2705 | 11999.529 |
| 2706 | 11998.279 |
| 2707 | 11997.606 |
| 2708 | 11996.942 |
| 2709 | 11995.837 |
| 2710 | 11994.933 |
| 2711 | 11993.654 |
| 2712 | 11992.654 |
| 2713 | 11990.971 |
| 2714 | 11989.769 |
| 2715 | 11988.788 |
| 2716 | 11987.49 |
| 2717 | 11986.096 |
| 2718 | 11985.183 |
| 2719 | 11983.596 |
| 2720 | 11981.327 |
| 2721 | 11979.5 |
| 2722 | 11977.683 |
| 2723 | 11976.192 |
| 2724 | 11974.596 |
| 2725 | 11972.731 |
| 2726 | 11971.019 |
| 2727 | 11969.067 |
| 2728 | 11967.548 |
| 2729 | 11965.587 |
| 2730 | 11963.702 |
| 2731 | 11960.923 |
| 2732 | 11959 |
| 2733 | 11956.144 |
| 2734 | 11954.221 |
| 2735 | 11951.692 |
| 2736 | 11948.798 |
| 2737 | 11946.481 |
| 2738 | 11944.125 |
| 2739 | 11941.558 |
| 2740 | 11938.981 |
| 2741 | 11936.865 |
| 2742 | 11933.587 |
| 2743 | 11930.356 |
| 2744 | 11927.365 |
| 2745 | 11924.106 |
| 2746 | 11921.51 |
| 2747 | 11918.606 |
| 2748 | 11915.192 |
| 2749 | 11911.846 |
| 2750 | 11908.913 |
| 2751 | 11905.635 |
| 2752 | 11902.413 |
| 2753 | 11899.423 |
| 2754 | 11895.663 |
| 2755 | 11891.942 |
| 2756 | 11888.375 |
| 2757 | 11885.327 |
| 2758 | 11881.298 |
| 2759 | 11877.76 |
| 2760 | 11873.971 |
| 2761 | 11869.962 |
| 2762 | 11866.404 |
| 2763 | 11862.567 |
| 2764 | 11858.625 |
| 2765 | 11854.385 |
| 2766 | 11850.231 |
| 2767 | 11845.952 |
| 2768 | 11841.202 |
| 2769 | 11836.577 |
| 2770 | 11832.154 |
| 2771 | 11827.837 |
| 2772 | 11822.712 |
| 2773 | 11818.019 |
| 2774 | 11813.337 |
| 2775 | 11808.183 |
| 2776 | 11802.856 |
| 2777 | 11797.221 |
| 2778 | 11791.413 |
| 2779 | 11785.279 |
| 2780 | 11779.163 |
| 2781 | 11773.192 |
| 2782 | 11766.99 |
| 2783 | 11760.346 |
| 2784 | 11754.558 |
| 2785 | 11748.452 |
| 2786 | 11741.885 |
| 2787 | 11735.548 |
| 2788 | 11728.971 |
| 2789 | 11722.087 |
| 2790 | 11715.154 |
| 2791 | 11707.673 |
| 2792 | 11700.25 |
| 2793 | 11692.529 |
| 2794 | 11684.827 |
| 2795 | 11677.375 |
| 2796 | 11669.462 |
| 2797 | 11661.471 |
| 2798 | 11653.26 |
| 2799 | 11644.779 |
| 2800 | 11636.077 |
| 2801 | 11627.346 |
| 2802 | 11618.375 |
| 2803 | 11608.962 |
| 2804 | 11599.413 |
| 2805 | 11590.635 |
| 2806 | 11580.971 |
| 2807 | 11571.567 |
| 2808 | 11560.827 |
| 2809 | 11551.346 |
| 2810 | 11540.5 |
| 2811 | 11529.519 |
| 2812 | 11518.202 |
| 2813 | 11506.663 |
| 2814 | 11494.904 |
| 2815 | 11482.981 |
| 2816 | 11470.913 |
| 2817 | 11458.644 |
| 2818 | 11446.423 |
| 2819 | 11432.99 |
| 2820 | 11419.798 |
| 2821 | 11407.019 |
| 2822 | 11394.279 |
| 2823 | 11380.615 |
| 2824 | 11367.519 |
| 2825 | 11353.933 |
| 2826 | 11340.548 |
| 2827 | 11326.269 |
| 2828 | 11312.202 |
| 2829 | 11297.173 |
| 2830 | 11282.385 |
| 2831 | 11266.99 |
| 2832 | 11249.865 |
| 2833 | 11233.394 |
| 2834 | 11216.615 |
| 2835 | 11198.962 |
| 2836 | 11181.452 |
| 2837 | 11163.279 |
| 2838 | 11144.99 |
| 2839 | 11125.942 |
| 2840 | 11105.923 |
| 2841 | 11086.173 |
| 2842 | 11065.058 |
| 2843 | 11045.029 |
| 2844 | 11024.423 |
| 2845 | 11002.587 |
| 2846 | 10981.058 |
| 2847 | 10957.971 |
| 2848 | 10934.942 |
| 2849 | 10912.096 |
| 2850 | 10888.135 |
| 2851 | 10864.865 |
| 2852 | 10840.577 |
| 2853 | 10816.952 |
| 2854 | 10792.587 |
| 2855 | 10768.817 |
| 2856 | 10743.817 |
| 2857 | 10717.269 |
| 2858 | 10690.192 |
| 2859 | 10664.538 |
| 2860 | 10636.365 |
| 2861 | 10609.423 |
| 2862 | 10581.471 |
| 2863 | 10554.788 |
| 2864 | 10526.654 |
| 2865 | 10497.077 |
| 2866 | 10467.798 |
| 2867 | 10438.173 |
| 2868 | 10407.548 |
| 2869 | 10377.346 |
| 2870 | 10346.654 |
| 2871 | 10315.817 |
| 2872 | 10284.952 |
| 2873 | 10252.933 |
| 2874 | 10221.798 |
| 2875 | 10189.827 |
| 2876 | 10157.24 |
| 2877 | 10125.615 |
| 2878 | 10093.01 |
| 2879 | 10060.144 |
| 2880 | 9913.133 |
| 2881 | 9881.631 |
| 2882 | 9850.969 |
| 2883 | 9819.246 |
| 2884 | 9786.847 |
| 2885 | 9755.526 |
| 2886 | 9724.505 |
| 2887 | 9691.556 |
| 2888 | 9659.403 |
| 2889 | 9627.921 |
| 2890 | 9595.436 |
| 2891 | 9562.174 |
| 2892 | 9528.665 |
| 2893 | 9495.592 |
| 2894 | 9462.432 |
| 2895 | 9428.922 |
| 2896 | 9395.125 |
| 2897 | 9360.975 |
| 2898 | 9327.022 |
| 2899 | 9290.669 |
| 2900 | 9256.119 |
| 2901 | 9220.458 |
| 2902 | 9182.85 |
| 2903 | 9145.994 |
| 2904 | 9109.059 |
| 2905 | 9070.516 |
| 2906 | 9033.296 |
| 2907 | 8995.837 |
| 2908 | 8957.38 |
| 2909 | 8918.288 |
| 2910 | 8879.314 |
| 2911 | 8840.682 |
| 2912 | 8801.299 |
| 2913 | 8761.3 |
| 2914 | 8722.398 |
| 2915 | 8682.238 |
| 2916 | 8642.245 |
| 2917 | 8602.635 |
| 2918 | 8563.706 |
| 2919 | 8524.354 |
| 2920 | 8485.218 |
| 2921 | 8446.189 |
| 2922 | 8407.349 |
| 2923 | 8369.02 |
| 2924 | 8328.974 |
| 2925 | 8289.196 |
| 2926 | 8250.494 |
| 2927 | 8211.098 |
| 2928 | 8171.183 |
| 2929 | 8131.986 |
| 2930 | 8092.936 |
| 2931 | 8053.583 |
| 2932 | 8014.794 |
| 2933 | 7976.224 |
| 2934 | 7937.3 |
| 2935 | 7898.888 |
| 2936 | 7859.11 |
| 2937 | 7821.744 |
| 2938 | 7784.432 |
| 2939 | 7747.49 |
| 2940 | 7710.877 |
| 2941 | 7674.301 |
| 2942 | 7636.808 |
| 2943 | 7600.152 |
| 2944 | 7563.687 |
| 2945 | 7527.313 |
| 2946 | 7491.442 |
| 2947 | 7455.302 |
| 2948 | 7419.812 |
| 2949 | 7382.566 |
| 2950 | 7346.679 |
| 2951 | 7311.43 |
| 2952 | 7276.236 |
| 2953 | 7240.179 |
| 2954 | 7205.114 |
| 2955 | 7169.86 |
| 2956 | 7134.967 |
| 2957 | 7101.221 |
| 2958 | 7067.461 |
| 2959 | 7033.36 |
| 2960 | 6998.736 |
| 2961 | 6964.917 |
| 2962 | 6930.802 |
| 2963 | 6897.589 |
| 2964 | 6863.661 |
| 2965 | 6830.384 |
| 2966 | 6798.051 |
| 2967 | 6766.095 |
| 2968 | 6734.264 |
| 2969 | 6701.388 |
| 2970 | 6669.914 |
| 2971 | 6638.558 |
| 2972 | 6606.176 |
| 2973 | 6575.24 |
| 2974 | 6545.309 |
| 2975 | 6514.75 |
| 2976 | 6484.197 |
| 2977 | 6454.622 |
| 2978 | 6424.122 |
| 2979 | 6394.936 |
| 2980 | 6365.917 |
| 2981 | 6338.345 |
| 2982 | 6309.053 |
| 2983 | 6280.388 |
| 2984 | 6252.228 |
| 2985 | 6224.007 |
| 2986 | 6196.723 |
| 2987 | 6169.614 |
| 2988 | 6141.577 |
| 2989 | 6115.136 |
| 2990 | 6088.953 |
| 2991 | 6062.257 |
| 2992 | 6036.082 |
| 2993 | 6010.851 |
| 2994 | 5984.603 |
| 2995 | 5959.682 |
| 2996 | 5934.471 |
| 2997 | 5910.011 |
| 2998 | 5885.428 |
| 2999 | 5861.182 |
| 3000 | 5837.815 |
| 3001 | 5814.426 |
| 3002 | 5791.595 |
| 3003 | 5768.55 |
| 3004 | 5745.71 |
| 3005 | 5724.013 |
| 3006 | 5701.391 |
| 3007 | 5679.498 |
| 3008 | 5657.425 |
| 3009 | 5636.011 |
| 3010 | 5613.141 |
| 3011 | 5592.233 |
| 3012 | 5570.958 |
| 3013 | 5549.057 |
| 3014 | 5528.407 |
| 3015 | 5507.659 |
| 3016 | 5486.077 |
| 3017 | 5464.76 |
| 3018 | 5443.69 |
| 3019 | 5422.198 |
| 3020 | 5401.463 |
| 3021 | 5381.247 |
| 3022 | 5360.221 |
| 3023 | 5340.181 |
| 3024 | 5320.421 |
| 3025 | 5300.491 |
| 3026 | 5280.781 |
| 3027 | 5261.137 |
| 3028 | 5241.216 |
| 3029 | 5221.437 |
| 3030 | 5202.838 |
| 3031 | 5184.026 |
| 3032 | 5164.696 |
| 3033 | 5146.624 |
| 3034 | 5128.113 |
| 3035 | 5110.014 |
| 3036 | 5091.953 |
| 3037 | 5074.449 |
| 3038 | 5056.738 |
| 3039 | 5038.612 |
| 3040 | 5021.196 |
| 3041 | 5004.133 |
| 3042 | 4987.232 |
| 3043 | 4970.36 |
| 3044 | 4952.956 |
| 3045 | 4936.718 |
| 3046 | 4920.294 |
| 3047 | 4904.43 |
| 3048 | 4887.968 |
| 3049 | 4872.649 |
| 3050 | 4856.221 |
| 3051 | 4839.906 |
| 3052 | 4823.865 |
| 3053 | 4808.701 |
| 3054 | 4793.673 |
| 3055 | 4778.337 |
| 3056 | 4763.304 |
| 3057 | 4747.862 |
| 3058 | 4732.427 |
| 3059 | 4717.809 |
| 3060 | 4703.468 |
| 3061 | 4688.413 |
| 3062 | 4673.771 |
| 3063 | 4659.391 |
| 3064 | 4644.919 |
| 3065 | 4630.643 |
| 3066 | 4617.341 |
| 3067 | 4603.737 |
| 3068 | 4589.365 |
| 3069 | 4576.448 |
| 3070 | 4563.229 |
| 3071 | 4549.686 |
| 3072 | 4536.478 |
| 3073 | 4522.731 |
| 3074 | 4509.433 |
| 3075 | 4496.44 |
| 3076 | 4483.025 |
| 3077 | 4469.974 |
| 3078 | 4456.902 |
| 3079 | 4444.617 |
| 3080 | 4432.247 |
| 3081 | 4419.792 |
| 3082 | 4407.287 |
| 3083 | 4394.516 |
| 3084 | 4381.729 |
| 3085 | 4369.74 |
| 3086 | 4358.225 |
| 3087 | 4346.599 |
| 3088 | 4334.557 |
| 3089 | 4322.983 |
| 3090 | 4312.138 |
| 3091 | 4300.531 |
| 3092 | 4289.621 |
| 3093 | 4278.191 |
| 3094 | 4266.396 |
| 3095 | 4255.209 |
| 3096 | 4244.312 |
| 3097 | 4233.577 |
| 3098 | 4222.412 |
| 3099 | 4211.651 |
| 3100 | 4200.603 |
| 3101 | 4191.189 |
| 3102 | 4180.511 |
| 3103 | 4170.117 |
| 3104 | 4160.296 |
| 3105 | 4150.798 |
| 3106 | 4141.64 |
| 3107 | 4131.954 |
| 3108 | 4122.679 |
| 3109 | 4113.063 |
| 3110 | 4103.308 |
| 3111 | 4093.858 |
| 3112 | 4083.949 |
| 3113 | 4074.282 |
| 3114 | 4065.553 |
| 3115 | 4056.111 |
| 3116 | 4048.033 |
| 3117 | 4039.107 |
| 3118 | 4029.96 |
| 3119 | 4022.029 |
| 3120 | 4012.683 |
| 3121 | 4004.039 |
| 3122 | 3995.335 |
| 3123 | 3987.444 |
| 3124 | 3978.59 |
| 3125 | 3970.592 |
| 3126 | 3962.376 |
| 3127 | 3953.926 |
| 3128 | 3946.116 |
| 3129 | 3937.976 |
| 3130 | 3929.49 |
| 3131 | 3920.615 |
| 3132 | 3911.512 |
| 3133 | 3903.054 |
| 3134 | 3893.578 |
| 3135 | 3885.241 |
| 3136 | 3876.256 |
| 3137 | 3866.939 |
| 3138 | 3857.766 |
| 3139 | 3848.229 |
| 3140 | 3838.94 |
| 3141 | 3829.433 |
| 3142 | 3820.437 |
| 3143 | 3811.497 |
| 3144 | 3802.155 |
| 3145 | 3792.681 |
| 3146 | 3784.28 |
| 3147 | 3776.049 |
| 3148 | 3767.257 |
| 3149 | 3758.77 |
| 3150 | 3751.061 |
| 3151 | 3742.38 |
| 3152 | 3734.46 |
| 3153 | 3726.819 |
| 3154 | 3719.971 |
| 3155 | 3713.306 |
| 3156 | 3706.676 |
| 3157 | 3700.28 |
| 3158 | 3694.047 |
| 3159 | 3688.523 |
| 3160 | 3683.669 |
| 3161 | 3678.222 |
| 3162 | 3673.47 |
| 3163 | 3670.115 |
| 3164 | 3667.214 |
| 3165 | 3664.259 |
| 3166 | 3662.011 |
| 3167 | 3660.331 |
| 3168 | 3658.429 |
| 3169 | 3657.273 |
| 3170 | 3656.647 |
| 3171 | 3656.664 |
| 3172 | 3657.262 |
| 3173 | 3657.736 |
| 3174 | 3658.312 |
| 3175 | 3658.734 |
| 3176 | 3660.182 |
| 3177 | 3661.334 |
| 3178 | 3662.549 |
| 3179 | 3664.63 |
| 3180 | 3665.683 |
| 3181 | 3667.687 |
| 3182 | 3670.476 |
| 3183 | 3673.87 |
| 3184 | 3677.966 |
| 3185 | 3683.159 |
| 3186 | 3688.607 |
| 3187 | 3694.497 |
| 3188 | 3700.462 |
| 3189 | 3707.668 |
| 3190 | 3715.629 |
| 3191 | 3724.955 |
| 3192 | 3732.906 |
| 3193 | 3741.828 |
| 3194 | 3751.32 |
| 3195 | 3761.091 |
| 3196 | 3772.48 |
| 3197 | 3784.196 |
| 3198 | 3795.475 |
| 3199 | 3808.443 |
| 3200 | 3821.761 |
| 3201 | 3835.049 |
| 3202 | 3849.285 |
| 3203 | 3864.585 |
| 3204 | 3879.134 |
| 3205 | 3894.328 |
| 3206 | 3911.41 |
| 3207 | 3929.612 |
| 3208 | 3948.01 |
| 3209 | 3965.939 |
| 3210 | 3986.12 |
| 3211 | 4007.389 |
| 3212 | 4029.589 |
| 3213 | 4052.651 |
| 3214 | 4076.09 |
| 3215 | 4099.826 |
| 3216 | 4125.133 |
| 3217 | 4151.942 |
| 3218 | 4179.286 |
| 3219 | 4206.459 |
| 3220 | 4235.505 |
| 3221 | 4263.694 |
| 3222 | 4292.323 |
| 3223 | 4321.753 |
| 3224 | 4351.876 |
| 3225 | 4382.972 |
| 3226 | 4415.113 |
| 3227 | 4446.53 |
| 3228 | 4477.8 |
| 3229 | 4509.677 |
| 3230 | 4541.516 |
| 3231 | 4573.693 |
| 3232 | 4605.321 |
| 3233 | 4635.506 |
| 3234 | 4666.546 |
| 3235 | 4697.244 |
| 3236 | 4726.853 |
| 3237 | 4757.377 |
| 3238 | 4787.409 |
| 3239 | 4818.342 |
| 3240 | 4848.803 |
| 3241 | 4879.206 |
| 3242 | 4910.71 |
| 3243 | 4942.911 |
| 3244 | 4975.314 |
| 3245 | 5007.347 |
| 3246 | 5040.715 |
| 3247 | 5074.741 |
| 3248 | 5109.058 |
| 3249 | 5143.952 |
| 3250 | 5180.182 |
| 3251 | 5217.153 |
| 3252 | 5255.268 |
| 3253 | 5293.664 |
| 3254 | 5334.344 |
| 3255 | 5375.857 |
| 3256 | 5415.778 |
| 3257 | 5457.152 |
| 3258 | 5499.011 |
| 3259 | 5541.98 |
| 3260 | 5586.491 |
| 3261 | 5630.109 |
| 3262 | 5674.998 |
| 3263 | 5721.914 |
| 3264 | 5767.373 |
| 3265 | 5813.001 |
| 3266 | 5859.248 |
| 3267 | 5904.776 |
| 3268 | 5951.138 |
| 3269 | 5997.347 |
| 3270 | 6043.998 |
| 3271 | 6090.356 |
| 3272 | 6139.233 |
| 3273 | 6189.739 |
| 3274 | 6240.588 |
| 3275 | 6293.722 |
| 3276 | 6346.169 |
| 3277 | 6399.831 |
| 3278 | 6455.054 |
| 3279 | 6509.695 |
| 3280 | 6565.688 |
| 3281 | 6621.11 |
| 3282 | 6678.065 |
| 3283 | 6733.426 |
| 3284 | 6789.308 |
| 3285 | 6844.275 |
| 3286 | 6898.951 |
| 3287 | 6953.232 |
| 3288 | 7006.275 |
| 3289 | 7058.372 |
| 3290 | 7109.603 |
| 3291 | 7160.043 |
| 3292 | 7209.452 |
| 3293 | 7257.597 |
| 3294 | 7306.367 |
| 3295 | 7354.042 |
| 3296 | 7400.21 |
| 3297 | 7445.163 |
| 3298 | 7489.589 |
| 3299 | 7532.5 |
| 3300 | 7576.019 |
| 3301 | 7619.725 |
| 3302 | 7663.184 |
| 3303 | 7705.713 |
| 3304 | 7750.065 |
| 3305 | 7794.194 |
| 3306 | 7840.572 |
| 3307 | 7886.115 |
| 3308 | 7932.538 |
| 3309 | 7979.608 |
| 3310 | 8027.278 |
| 3311 | 8074.92 |
| 3312 | 8123.261 |
| 3313 | 8172.355 |
| 3314 | 8220.501 |
| 3315 | 8269.433 |
| 3316 | 8317.567 |
| 3317 | 8366.073 |
| 3318 | 8412.43 |
| 3319 | 8459.665 |
| 3320 | 8506.224 |
| 3321 | 8552.802 |
| 3322 | 8599.11 |
| 3323 | 8643.924 |
| 3324 | 8687.819 |
| 3325 | 8732.151 |
| 3326 | 8775.014 |
| 3327 | 8816.695 |
| 3328 | 8858.275 |
| 3329 | 8899.634 |
| 3330 | 8940.106 |
| 3331 | 8981.527 |
| 3332 | 9022.808 |
| 3333 | 9064.287 |
| 3334 | 9105.747 |
| 3335 | 9146.945 |
| 3336 | 9185.828 |
| 3337 | 9227.733 |
| 3338 | 9267.869 |
| 3339 | 9308.51 |
| 3340 | 9348.583 |
| 3341 | 9386.674 |
| 3342 | 9425.221 |
| 3343 | 9462.2 |
| 3344 | 9498.286 |
| 3345 | 9533.567 |
| 3346 | 9568.289 |
| 3347 | 9603.145 |
| 3348 | 9636.948 |
| 3349 | 9670.924 |
| 3350 | 9704.32 |
| 3351 | 9737.987 |
| 3352 | 9769.97 |
| 3353 | 9802.241 |
| 3354 | 9832.649 |
| 3355 | 9862.603 |
| 3356 | 9892.338 |
| 3357 | 9921.641 |
| 3358 | 9949.979 |
| 3359 | 9977.784 |
| 3360 | 10004.606 |
| 3361 | 10031.039 |
| 3362 | 10057.837 |
| 3363 | 10084.745 |
| 3364 | 10111.344 |
| 3365 | 10137.851 |
| 3366 | 10164.442 |
| 3367 | 10191.492 |
| 3368 | 10217.072 |
| 3369 | 10242.517 |
| 3370 | 10268.661 |
| 3371 | 10294.256 |
| 3372 | 10319.096 |
| 3373 | 10344.021 |
| 3374 | 10368.564 |
| 3375 | 10394.187 |
| 3376 | 10419.129 |
| 3377 | 10442.724 |
| 3378 | 10466.954 |
| 3379 | 10490.165 |
| 3380 | 10512.638 |
| 3381 | 10534.975 |
| 3382 | 10556.992 |
| 3383 | 10579.366 |
| 3384 | 10601.231 |
| 3385 | 10622.247 |
| 3386 | 10641.817 |
| 3387 | 10662.086 |
| 3388 | 10682.3 |
| 3389 | 10701.771 |
| 3390 | 10721.162 |
| 3391 | 10739.84 |
| 3392 | 10758.048 |
| 3393 | 10775.045 |
| 3394 | 10792.329 |
| 3395 | 10810.365 |
| 3396 | 10827.209 |
| 3397 | 10844.689 |
| 3398 | 10861.968 |
| 3399 | 10878.003 |
| 3400 | 10894.277 |
| 3401 | 10911.481 |
| 3402 | 10927.565 |
| 3403 | 10942.981 |
| 3404 | 10958.33 |
| 3405 | 10973.246 |
| 3406 | 10988.063 |
| 3407 | 11003.153 |
| 3408 | 11017.988 |
| 3409 | 11031.775 |
| 3410 | 11045.435 |
| 3411 | 11058.798 |
| 3412 | 11071.261 |
| 3413 | 11084.194 |
| 3414 | 11096.574 |
| 3415 | 11109.247 |
| 3416 | 11121.837 |
| 3417 | 11132.877 |
| 3418 | 11143.744 |
| 3419 | 11155.313 |
| 3420 | 11167.095 |
| 3421 | 11178.515 |
| 3422 | 11188.924 |
| 3423 | 11199.789 |
| 3424 | 11210.123 |
| 3425 | 11220.718 |
| 3426 | 11231.475 |
| 3427 | 11241.733 |
| 3428 | 11252.355 |
| 3429 | 11262.747 |
| 3430 | 11273.294 |
| 3431 | 11283.589 |
| 3432 | 11293.669 |
| 3433 | 11304.539 |
| 3434 | 11314.916 |
| 3435 | 11324.206 |
| 3436 | 11334.743 |
| 3437 | 11344.218 |
| 3438 | 11353.387 |
| 3439 | 11363.028 |
| 3440 | 11372.449 |
| 3441 | 11381.618 |
| 3442 | 11391.118 |
| 3443 | 11400.043 |
| 3444 | 11408.933 |
| 3445 | 11417.88 |
| 3446 | 11426.958 |
| 3447 | 11435.089 |
| 3448 | 11443.237 |
| 3449 | 11451.213 |
| 3450 | 11459.532 |
| 3451 | 11467.271 |
| 3452 | 11474.577 |
| 3453 | 11481.575 |
| 3454 | 11488.87 |
| 3455 | 11496.222 |
| 3456 | 11502.996 |
| 3457 | 11510.087 |
| 3458 | 11517.062 |
| 3459 | 11523.914 |
| 3460 | 11530.985 |
| 3461 | 11538.183 |
| 3462 | 11544.927 |
| 3463 | 11551.859 |
| 3464 | 11557.79 |
| 3465 | 11564.125 |
| 3466 | 11570.168 |
| 3467 | 11575.759 |
| 3468 | 11581.047 |
| 3469 | 11586.996 |
| 3470 | 11592.09 |
| 3471 | 11597.055 |
| 3472 | 11602.578 |
| 3473 | 11607.228 |
| 3474 | 11611.804 |
| 3475 | 11616.393 |
| 3476 | 11620.99 |
| 3477 | 11625.121 |
| 3478 | 11629.33 |
| 3479 | 11633.837 |
| 3480 | 11638.092 |
| 3481 | 11642.89 |
| 3482 | 11646.878 |
| 3483 | 11651.716 |
| 3484 | 11655.477 |
| 3485 | 11659.357 |
| 3486 | 11663.238 |
| 3487 | 11666.721 |
| 3488 | 11670.409 |
| 3489 | 11674.919 |
| 3490 | 11679.134 |
| 3491 | 11683.045 |
| 3492 | 11686.637 |
| 3493 | 11690.824 |
| 3494 | 11694.03 |
| 3495 | 11697.471 |
| 3496 | 11701.1 |
| 3497 | 11704.689 |
| 3498 | 11708.912 |
| 3499 | 11712.598 |
| 3500 | 11716.386 |
| 3501 | 11720.299 |
| 3502 | 11724.269 |
| 3503 | 11727.851 |
| 3504 | 11731.494 |
| 3505 | 11734.932 |
| 3506 | 11737.567 |
| 3507 | 11741.074 |
| 3508 | 11744.394 |
| 3509 | 11747.346 |
| 3510 | 11750.733 |
| 3511 | 11753.987 |
| 3512 | 11757.348 |
| 3513 | 11759.896 |
| 3514 | 11763.142 |
| 3515 | 11766.487 |
| 3516 | 11769.617 |
| 3517 | 11772.426 |
| 3518 | 11775.58 |
| 3519 | 11778.961 |
| 3520 | 11781.871 |
| 3521 | 11784.926 |
| 3522 | 11788.028 |
| 3523 | 11791.292 |
| 3524 | 11793.804 |
| 3525 | 11796.771 |
| 3526 | 11799.256 |
| 3527 | 11801.433 |
| 3528 | 11803.709 |
| 3529 | 11806.468 |
| 3530 | 11808.351 |
| 3531 | 11810.998 |
| 3532 | 11813.472 |
| 3533 | 11815.365 |
| 3534 | 11817.171 |
| 3535 | 11819.112 |
| 3536 | 11820.874 |
| 3537 | 11822.591 |
| 3538 | 11824.532 |
| 3539 | 11825.825 |
| 3540 | 11827.623 |
| 3541 | 11828.853 |
| 3542 | 11830.529 |
| 3543 | 11832.672 |
| 3544 | 11833.955 |
| 3545 | 11835.905 |
| 3546 | 11837.292 |
| 3547 | 11839.603 |
| 3548 | 11841.346 |
| 3549 | 11843.368 |
| 3550 | 11845.069 |
| 3551 | 11846.516 |
| 3552 | 11848.304 |
| 3553 | 11849.728 |
| 3554 | 11851.469 |
| 3555 | 11853.464 |
| 3556 | 11855.142 |
| 3557 | 11856.712 |
| 3558 | 11858.695 |
| 3559 | 11860.469 |
| 3560 | 11862.048 |
| 3561 | 11863.577 |
| 3562 | 11865.289 |
| 3563 | 11867.152 |
| 3564 | 11868.821 |
| 3565 | 11870.29 |
| 3566 | 11872.004 |
| 3567 | 11872.619 |
| 3568 | 11874.417 |
| 3569 | 11875.883 |
| 3570 | 11876.996 |
| 3571 | 11878.224 |
| 3572 | 11879.221 |
| 3573 | 11880.69 |
| 3574 | 11882.2 |
| 3575 | 11883.863 |
| 3576 | 11885.673 |
| 3577 | 11886.329 |
| 3578 | 11887.614 |
| 3579 | 11888.982 |
| 3580 | 11889.839 |
| 3581 | 11890.79 |
| 3582 | 11891.119 |
| 3583 | 11892.469 |
| 3584 | 11893.767 |
| 3585 | 11894.708 |
| 3586 | 11895.375 |
| 3587 | 11896.708 |
| 3588 | 11897.308 |
| 3589 | 11898.249 |
| 3590 | 11898.744 |
| 3591 | 11899.507 |
| 3592 | 11899.836 |
| 3593 | 11899.908 |
| 3594 | 11900.05 |
| 3595 | 11900.219 |
| 3596 | 11899.96 |
| 3597 | 11900.286 |
| 3598 | 11900.267 |
| 3599 | 11900.236 |
| 3600 | 11900.021 |
| 3601 | 11899.611 |
| 3602 | 11899.294 |
| 3603 | 11899 |
| 3604 | 11898.693 |
| 3605 | 11898.091 |
| 3606 | 11897.684 |
| 3607 | 11897.34 |
| 3608 | 11897.154 |
| 3609 | 11896.805 |
| 3610 | 11896.92 |
| 3611 | 11896.952 |
| 3612 | 11896.99 |
| 3613 | 11896.776 |
| 3614 | 11896.516 |
| 3615 | 11896.443 |
| 3616 | 11895.587 |
| 3617 | 11895.106 |
| 3618 | 11894.24 |
| 3619 | 11892.993 |
| 3620 | 11892.203 |
| 3621 | 11891.089 |
| 3622 | 11890.338 |
| 3623 | 11889.183 |
| 3624 | 11887.751 |
| 3625 | 11886.512 |
| 3626 | 11884.965 |
| 3627 | 11883.485 |
| 3628 | 11881.456 |
| 3629 | 11880.106 |
| 3630 | 11878.36 |
| 3631 | 11877.134 |
| 3632 | 11875.278 |
| 3633 | 11873.345 |
| 3634 | 11871.921 |
| 3635 | 11870.253 |
| 3636 | 11868.16 |
| 3637 | 11866.704 |
| 3638 | 11864.674 |
| 3639 | 11863.125 |
| 3640 | 11861.815 |
| 3641 | 11859.89 |
| 3642 | 11857.453 |
| 3643 | 11855.376 |
| 3644 | 11853.163 |
| 3645 | 11851.214 |
| 3646 | 11849.691 |
| 3647 | 11847.003 |
| 3648 | 11844.794 |
| 3649 | 11841.965 |
| 3650 | 11839.453 |
| 3651 | 11836.114 |
| 3652 | 11833.627 |
| 3653 | 11830.888 |
| 3654 | 11827.277 |
| 3655 | 11824.537 |
| 3656 | 11821.698 |
| 3657 | 11818.86 |
| 3658 | 11815.173 |
| 3659 | 11810.857 |
| 3660 | 11806.939 |
| 3661 | 11803.375 |
| 3662 | 11799.181 |
| 3663 | 11795.485 |
| 3664 | 11791.905 |
| 3665 | 11788.358 |
| 3666 | 11784.996 |
| 3667 | 11781.467 |
| 3668 | 11777.881 |
| 3669 | 11774.12 |
| 3670 | 11770.97 |
| 3671 | 11767.331 |
| 3672 | 11763.541 |
| 3673 | 11760.001 |
| 3674 | 11756.259 |
| 3675 | 11752.385 |
| 3676 | 11748.367 |
| 3677 | 11745.067 |
| 3678 | 11741.179 |
| 3679 | 11737.143 |
| 3680 | 11733.145 |
| 3681 | 11728.64 |
| 3682 | 11724.013 |
| 3683 | 11719.632 |
| 3684 | 11714.923 |
| 3685 | 11710.391 |
| 3686 | 11706.267 |
| 3687 | 11701.504 |
| 3688 | 11696.936 |
| 3689 | 11691.053 |
| 3690 | 11686.326 |
| 3691 | 11680.606 |
| 3692 | 11675.713 |
| 3693 | 11670.667 |
| 3694 | 11665.189 |
| 3695 | 11659.75 |
| 3696 | 11654.278 |
| 3697 | 11648.663 |
| 3698 | 11641.938 |
| 3699 | 11635.327 |
| 3700 | 11629.465 |
| 3701 | 11622.305 |
| 3702 | 11615.79 |
| 3703 | 11608.343 |
| 3704 | 11601.689 |
| 3705 | 11594.203 |
| 3706 | 11586.957 |
| 3707 | 11580.104 |
| 3708 | 11572.115 |
| 3709 | 11563.829 |
| 3710 | 11556.676 |
| 3711 | 11547.308 |
| 3712 | 11538.668 |
| 3713 | 11530.033 |
| 3714 | 11519.982 |
| 3715 | 11511.358 |
| 3716 | 11501.924 |
| 3717 | 11492.157 |
| 3718 | 11481.942 |
| 3719 | 11472.249 |
| 3720 | 11462.293 |
| 3721 | 11451.761 |
| 3722 | 11441.316 |
| 3723 | 11432.134 |
| 3724 | 11422.297 |
| 3725 | 11412.055 |
| 3726 | 11401.768 |
| 3727 | 11391.977 |
| 3728 | 11381.728 |
| 3729 | 11370.575 |
| 3730 | 11359.749 |
| 3731 | 11349.47 |
| 3732 | 11338.687 |
| 3733 | 11328.001 |
| 3734 | 11316.608 |
| 3735 | 11305.45 |
| 3736 | 11294.558 |
| 3737 | 11282.761 |
| 3738 | 11270.132 |
| 3739 | 11258.285 |
| 3740 | 11244.83 |
| 3741 | 11232.39 |
| 3742 | 11219.049 |
| 3743 | 11204.564 |
| 3744 | 11190.54 |
| 3745 | 11176.893 |
| 3746 | 11162.223 |
| 3747 | 11147.079 |
| 3748 | 11132.367 |
| 3749 | 11117.774 |
| 3750 | 11102.899 |
| 3751 | 11088.317 |
| 3752 | 11073.561 |
| 3753 | 11058.898 |
| 3754 | 11043.695 |
| 3755 | 11028.239 |
| 3756 | 11011.968 |
| 3757 | 10995.651 |
| 3758 | 10978.5 |
| 3759 | 10961.311 |
| 3760 | 10943.769 |
| 3761 | 10925.435 |
| 3762 | 10907.524 |
| 3763 | 10889.616 |
| 3764 | 10870.653 |
| 3765 | 10852.008 |
| 3766 | 10833.57 |
| 3767 | 10814.318 |
| 3768 | 10794.511 |
| 3769 | 10774.028 |
| 3770 | 10752.852 |
| 3771 | 10731.997 |
| 3772 | 10711.525 |
| 3773 | 10689 |
| 3774 | 10665.91 |
| 3775 | 10643.128 |
| 3776 | 10619.746 |
| 3777 | 10595.592 |
| 3778 | 10572.636 |
| 3779 | 10549.238 |
| 3780 | 10526.21 |
| 3781 | 10503.317 |
| 3782 | 10480.048 |
| 3783 | 10457.372 |
| 3784 | 10434.847 |
| 3785 | 10411.447 |
| 3786 | 10387.877 |
| 3787 | 10364.174 |
| 3788 | 10340.047 |
| 3789 | 10316.433 |
| 3790 | 10293.423 |
| 3791 | 10268.856 |
| 3792 | 10244.666 |
| 3793 | 10220.131 |
| 3794 | 10194.988 |
| 3795 | 10169.772 |
| 3796 | 10143.516 |
| 3797 | 10116.141 |
| 3798 | 10090.465 |
| 3799 | 10062.076 |
| 3800 | 10034.747 |
| 3801 | 10004.804 |
| 3802 | 9975.286 |
| 3803 | 9945.174 |
| 3804 | 9913.788 |
| 3805 | 9882.583 |
| 3806 | 9851.631 |
| 3807 | 9819.849 |
| 3808 | 9786.965 |
| 3809 | 9753.378 |
| 3810 | 9719.7 |
| 3811 | 9685.914 |
| 3812 | 9652.665 |
| 3813 | 9618.198 |
| 3814 | 9584.616 |
| 3815 | 9550.391 |
| 3816 | 9515.118 |
| 3817 | 9478.311 |
| 3818 | 9442.575 |
| 3819 | 9406.809 |
| 3820 | 9370.053 |
| 3821 | 9333.417 |
| 3822 | 9295.147 |
| 3823 | 9257.31 |
| 3824 | 9219.293 |
| 3825 | 9181.093 |
| 3826 | 9140.723 |
| 3827 | 9100.066 |
| 3828 | 9058.423 |
| 3829 | 9015.905 |
| 3830 | 8973.916 |
| 3831 | 8932.618 |
| 3832 | 8889.347 |
| 3833 | 8846.4 |
| 3834 | 8802.685 |
| 3835 | 8758.664 |
| 3836 | 8714.907 |
| 3837 | 8670.142 |
| 3838 | 8626.983 |
| 3839 | 8582.109 |
| 3840 | 8540.001 |
| 3841 | 8499.081 |
| 3842 | 8456.984 |
| 3843 | 8417.095 |
| 3844 | 8379.791 |
| 3845 | 8341.584 |
| 3846 | 8304.361 |
| 3847 | 8267.777 |
| 3848 | 8230.347 |
| 3849 | 8191.667 |
| 3850 | 8157.347 |
| 3851 | 8122.509 |
| 3852 | 8085.914 |
| 3853 | 8051.411 |
| 3854 | 8014.46 |
| 3855 | 7979.624 |
| 3856 | 7943.551 |
| 3857 | 7906.603 |
| 3858 | 7870.409 |
| 3859 | 7834.048 |
| 3860 | 7796.602 |
| 3861 | 7761.174 |
| 3862 | 7726.206 |
| 3863 | 7690.383 |
| 3864 | 7652.625 |
| 3865 | 7618.811 |
| 3866 | 7584.829 |
| 3867 | 7551.568 |
| 3868 | 7519.133 |
| 3869 | 7488.936 |
| 3870 | 7457.634 |
| 3871 | 7428.983 |
| 3872 | 7400.467 |
| 3873 | 7372.671 |
| 3874 | 7347.167 |
| 3875 | 7322.864 |
| 3876 | 7295.367 |
| 3877 | 7272.201 |
| 3878 | 7251.317 |
| 3879 | 7229.276 |
| 3880 | 7208.603 |
| 3881 | 7188.559 |
| 3882 | 7170.72 |
| 3883 | 7153.693 |
| 3884 | 7136.818 |
| 3885 | 7121.943 |
| 3886 | 7106.843 |
| 3887 | 7094.683 |
| 3888 | 7084.657 |
| 3889 | 7076.607 |
| 3890 | 7069.66 |
| 3891 | 7066.854 |
| 3892 | 7066.87 |
| 3893 | 7066.64 |
| 3894 | 7071.725 |
| 3895 | 7077.879 |
| 3896 | 7087.047 |
| 3897 | 7099.243 |
| 3898 | 7113.413 |
| 3899 | 7130.818 |
| 3900 | 7152.897 |
| 3901 | 7178.457 |
| 3902 | 7207.683 |
| 3903 | 7240.415 |
| 3904 | 7277.158 |
| 3905 | 7318.016 |
| 3906 | 7360.645 |
| 3907 | 7407.029 |
| 3908 | 7454.71 |
| 3909 | 7506.676 |
| 3910 | 7558.102 |
| 3911 | 7612.626 |
| 3912 | 7667.132 |
| 3913 | 7723.01 |
| 3914 | 7780.085 |
| 3915 | 7839.23 |
| 3916 | 7897.41 |
| 3917 | 7956.201 |
| 3918 | 8016.864 |
| 3919 | 8074.038 |
| 3920 | 8133.063 |
| 3921 | 8193.985 |
| 3922 | 8254.37 |
| 3923 | 8313.281 |
| 3924 | 8372.684 |
| 3925 | 8431.565 |
| 3926 | 8489.456 |
| 3927 | 8545.995 |
| 3928 | 8603.614 |
| 3929 | 8659.411 |
| 3930 | 8716.346 |
| 3931 | 8773.886 |
| 3932 | 8829.189 |
| 3933 | 8884.813 |
| 3934 | 8941.234 |
| 3935 | 8997.012 |
| 3936 | 9052.728 |
| 3937 | 9108.161 |
| 3938 | 9163.99 |
| 3939 | 9216.085 |
| 3940 | 9270.63 |
| 3941 | 9323.329 |
| 3942 | 9376.754 |
| 3943 | 9428.767 |
| 3944 | 9480.639 |
| 3945 | 9531.876 |
| 3946 | 9582.257 |
| 3947 | 9631.726 |
| 3948 | 9679.194 |
| 3949 | 9727.054 |
| 3950 | 9773.125 |
| 3951 | 9820.275 |
| 3952 | 9866.935 |
| 3953 | 9913.384 |
| 3954 | 9957.586 |
| 3955 | 10000.143 |
| 3956 | 10043.923 |
| 3957 | 10086.506 |
| 3958 | 10128.203 |
| 3959 | 10169.214 |
| 3960 | 10208.726 |
| 3961 | 10249.333 |
| 3962 | 10287.109 |
| 3963 | 10324.914 |
| 3964 | 10363.887 |
| 3965 | 10402.332 |
| 3966 | 10440.65 |
| 3967 | 10478.51 |
| 3968 | 10514.573 |
| 3969 | 10550.216 |
| 3970 | 10586.278 |
| 3971 | 10621.515 |
| 3972 | 10656.184 |
| 3973 | 10689.566 |
| 3974 | 10722.479 |
| 3975 | 10755.208 |
| 3976 | 10786.955 |
| 3977 | 10818.773 |
| 3978 | 10848.813 |
| 3979 | 10878.806 |
| 3980 | 10907.388 |
| 3981 | 10935.24 |
| 3982 | 10962.574 |
| 3983 | 10990.533 |
| 3984 | 11017.843 |
| 3985 | 11043.96 |
| 3986 | 11069.363 |
| 3987 | 11094.758 |
| 3988 | 11118.842 |
| 3989 | 11141.421 |
| 3990 | 11165.005 |
| 3991 | 11187.476 |
| 3992 | 11209.987 |
| 3993 | 11231.824 |
| 3994 | 11253.937 |
| 3995 | 11274.428 |
| 3996 | 11295.356 |
| 3997 | 11315.927 |
| 3998 | 11335.558 |
| 3999 | 11355.448 |
| 4000 | 11373.529 |
| 4001 | 11392.084 |
| 4002 | 11409.885 |
| 4003 | 11427.292 |
| 4004 | 11444.67 |
| 4005 | 11462.481 |
| 4006 | 11478.975 |
| 4007 | 11495.65 |
| 4008 | 11511.612 |
| 4009 | 11527.147 |
| 4010 | 11543.446 |
| 4011 | 11558.382 |
| 4012 | 11572.902 |
| 4013 | 11586.866 |
| 4014 | 11601.254 |
| 4015 | 11615.249 |
| 4016 | 11628.676 |
| 4017 | 11642.011 |
| 4018 | 11654.315 |
| 4019 | 11667.645 |
| 4020 | 11680.315 |
| 4021 | 11691.204 |
| 4022 | 11703.215 |
| 4023 | 11714.884 |
| 4024 | 11726.064 |
| 4025 | 11737.576 |
| 4026 | 11749.099 |
| 4027 | 11760.435 |
| 4028 | 11771.864 |
| 4029 | 11782.789 |
| 4030 | 11794.388 |
| 4031 | 11804.685 |
| 4032 | 11815.872 |
| 4033 | 11826.431 |
| 4034 | 11837.107 |
| 4035 | 11847.128 |
| 4036 | 11856.952 |
| 4037 | 11866.958 |
| 4038 | 11876.842 |
| 4039 | 11886.029 |
| 4040 | 11895.528 |
| 4041 | 11904.482 |
| 4042 | 11912.554 |
| 4043 | 11920.908 |
| 4044 | 11928.18 |
| 4045 | 11935.889 |
| 4046 | 11943.912 |
| 4047 | 11951.804 |
| 4048 | 11958.873 |
| 4049 | 11966.875 |
| 4050 | 11974.136 |
| 4051 | 11980.122 |
| 4052 | 11986.679 |
| 4053 | 11993.316 |
| 4054 | 11998.521 |
| 4055 | 12004.675 |
| 4056 | 12010.168 |
| 4057 | 12015.898 |
| 4058 | 12021.576 |
| 4059 | 12026.942 |
| 4060 | 12032.103 |
| 4061 | 12037.531 |
| 4062 | 12042.433 |
| 4063 | 12046.453 |
| 4064 | 12051.09 |
| 4065 | 12055.347 |
| 4066 | 12059.449 |
| 4067 | 12063.568 |
| 4068 | 12067.838 |
| 4069 | 12072.463 |
| 4070 | 12077.045 |
| 4071 | 12080.741 |
| 4072 | 12084.135 |
| 4073 | 12088.19 |
| 4074 | 12090.897 |
| 4075 | 12094.122 |
| 4076 | 12096.177 |
| 4077 | 12099.358 |
| 4078 | 12102.021 |
| 4079 | 12105.101 |
| 4080 | 12107.374 |
| 4081 | 12109.918 |
| 4082 | 12112.758 |
| 4083 | 12115.637 |
| 4084 | 12118.395 |
| 4085 | 12121.408 |
| 4086 | 12123.742 |
| 4087 | 12126.104 |
| 4088 | 12128.647 |
| 4089 | 12131.136 |
| 4090 | 12133.464 |
| 4091 | 12135.856 |
| 4092 | 12137.555 |
| 4093 | 12140.046 |
| 4094 | 12141.928 |
| 4095 | 12143.937 |
| 4096 | 12145.646 |
| 4097 | 12147.971 |
| 4098 | 12150.163 |
| 4099 | 12151.684 |
| 4100 | 12152.605 |
| 4101 | 12154.126 |
| 4102 | 12155.565 |
| 4103 | 12157.577 |
| 4104 | 12158.318 |
| 4105 | 12159.18 |
| 4106 | 12159.982 |
| 4107 | 12161.202 |
| 4108 | 12161.967 |
| 4109 | 12163.284 |
| 4110 | 12164.284 |
| 4111 | 12165.575 |
| 4112 | 12166.288 |
| 4113 | 12166.741 |
| 4114 | 12167.976 |
| 4115 | 12168.911 |
| 4116 | 12169.196 |
| 4117 | 12169.485 |
| 4118 | 12170.283 |
| 4119 | 12170.512 |
| 4120 | 12171.212 |
| 4121 | 12171.644 |
| 4122 | 12172.152 |
| 4123 | 12172.361 |
| 4124 | 12172.909 |
| 4125 | 12172.808 |
| 4126 | 12172.94 |
| 4127 | 12172.37 |
| 4128 | 12172.472 |
| 4129 | 12172.012 |
| 4130 | 12171.544 |
| 4131 | 12171.798 |
| 4132 | 12171.76 |
| 4133 | 12171.235 |
| 4134 | 12170.938 |
| 4135 | 12170.325 |
| 4136 | 12170.4 |
| 4137 | 12170.211 |
| 4138 | 12169.627 |
| 4139 | 12168.825 |
| 4140 | 12168.521 |
| 4141 | 12168.053 |
| 4142 | 12168.073 |
| 4143 | 12167.606 |
| 4144 | 12166.956 |
| 4145 | 12166.117 |
| 4146 | 12165.022 |
| 4147 | 12164.614 |
| 4148 | 12163.973 |
| 4149 | 12163.134 |
| 4150 | 12162.104 |
| 4151 | 12161.532 |
| 4152 | 12160.89 |
| 4153 | 12159.795 |
| 4154 | 12159.083 |
| 4155 | 12158.175 |
| 4156 | 12156.977 |
| 4157 | 12155.683 |
| 4158 | 12154.15 |
| 4159 | 12152.664 |
| 4160 | 12151.332 |
| 4161 | 12149.361 |
| 4162 | 12148.046 |
| 4163 | 12146.511 |
| 4164 | 12145.166 |
| 4165 | 12143.635 |
| 4166 | 12142.288 |
| 4167 | 12141.029 |
| 4168 | 12139.787 |
| 4169 | 12137.71 |
| 4170 | 12136.176 |
| 4171 | 12134.698 |
| 4172 | 12132.935 |
| 4173 | 12131.089 |
| 4174 | 12129.076 |
| 4175 | 12127.618 |
| 4176 | 12125.485 |
| 4177 | 12123.801 |
| 4178 | 12122.104 |
| 4179 | 12120.208 |
| 4180 | 12117.747 |
| 4181 | 12115.173 |
| 4182 | 12113.115 |
| 4183 | 12110.36 |
| 4184 | 12108.189 |
| 4185 | 12105.521 |
| 4186 | 12102.714 |
| 4187 | 12100.294 |
| 4188 | 12097.812 |
| 4189 | 12094.872 |
| 4190 | 12091.332 |
| 4191 | 12088.417 |
| 4192 | 12085.131 |
| 4193 | 12082.097 |
| 4194 | 12078.823 |
| 4195 | 12075.66 |
| 4196 | 12072.827 |
| 4197 | 12069.272 |
| 4198 | 12065.837 |
| 4199 | 12062.655 |
| 4200 | 12059.791 |
| 4201 | 12056.977 |
| 4202 | 12053.271 |
| 4203 | 12050.259 |
| 4204 | 12046.907 |
| 4205 | 12043.593 |
| 4206 | 12040.081 |
| 4207 | 12036.262 |
| 4208 | 12032.983 |
| 4209 | 12029.172 |
| 4210 | 12025.453 |
| 4211 | 12021.935 |
| 4212 | 12017.579 |
| 4213 | 12013.716 |
| 4214 | 12009.422 |
| 4215 | 12005.764 |
| 4216 | 12001.477 |
| 4217 | 11996.698 |
| 4218 | 11992.455 |
| 4219 | 11987.413 |
| 4220 | 11982.608 |
| 4221 | 11977.492 |
| 4222 | 11972.151 |
| 4223 | 11967.674 |
| 4224 | 11962.409 |
| 4225 | 11957.454 |
| 4226 | 11951.901 |
| 4227 | 11946.222 |
| 4228 | 11941.319 |
| 4229 | 11935.64 |
| 4230 | 11930.469 |
| 4231 | 11925.093 |
| 4232 | 11919.416 |
| 4233 | 11913.645 |
| 4234 | 11907.817 |
| 4235 | 11902.072 |
| 4236 | 11896.397 |
| 4237 | 11890.296 |
| 4238 | 11884.161 |
| 4239 | 11877.348 |
| 4240 | 11871.127 |
| 4241 | 11864.495 |
| 4242 | 11858.148 |
| 4243 | 11851.367 |
| 4244 | 11844.684 |
| 4245 | 11837.153 |
| 4246 | 11829.434 |
| 4247 | 11822.411 |
| 4248 | 11814.641 |
| 4249 | 11806.505 |
| 4250 | 11798.587 |
| 4251 | 11790.257 |
| 4252 | 11781.867 |
| 4253 | 11772.802 |
| 4254 | 11764.529 |
| 4255 | 11755.041 |
| 4256 | 11745.766 |
| 4257 | 11737.019 |
| 4258 | 11728.172 |
| 4259 | 11718.15 |
| 4260 | 11708.452 |
| 4261 | 11698.749 |
| 4262 | 11688.533 |
| 4263 | 11679.08 |
| 4264 | 11668.715 |
| 4265 | 11658.019 |
| 4266 | 11647.649 |
| 4267 | 11636.743 |
| 4268 | 11626.046 |
| 4269 | 11615.443 |
| 4270 | 11604.017 |
| 4271 | 11591.671 |
| 4272 | 11579.3 |
| 4273 | 11567.054 |
| 4274 | 11553.706 |
| 4275 | 11540.732 |
| 4276 | 11527.187 |
| 4277 | 11514 |
| 4278 | 11499.913 |
| 4279 | 11485.543 |
| 4280 | 11470.554 |
| 4281 | 11455.769 |
| 4282 | 11440.068 |
| 4283 | 11424.995 |
| 4284 | 11409.217 |
| 4285 | 11392.93 |
| 4286 | 11376.291 |
| 4287 | 11359.185 |
| 4288 | 11342.336 |
| 4289 | 11325.271 |
| 4290 | 11307.836 |
| 4291 | 11289.678 |
| 4292 | 11270.415 |
| 4293 | 11251.389 |
| 4294 | 11231.366 |
| 4295 | 11210.663 |
| 4296 | 11190.971 |
| 4297 | 11170.642 |
| 4298 | 11150.181 |
| 4299 | 11129.488 |
| 4300 | 11106.92 |
| 4301 | 11084.852 |
| 4302 | 11062.326 |
| 4303 | 11039.505 |
| 4304 | 11016.514 |
| 4305 | 10993.634 |
| 4306 | 10969.375 |
| 4307 | 10944.552 |
| 4308 | 10919.872 |
| 4309 | 10894.835 |
| 4310 | 10868.663 |
| 4311 | 10842.726 |
| 4312 | 10816.355 |
| 4313 | 10790.197 |
| 4314 | 10763.523 |
| 4315 | 10735.163 |
| 4316 | 10707.468 |
| 4317 | 10678.856 |
| 4318 | 10651.579 |
| 4319 | 10623.535 |
| 4320 | 10574.529 |
| 4321 | 10545.482 |
| 4322 | 10516.917 |
| 4323 | 10487.496 |
| 4324 | 10456.944 |
| 4325 | 10425.38 |
| 4326 | 10394.697 |
| 4327 | 10362.808 |
| 4328 | 10330.538 |
| 4329 | 10297.329 |
| 4330 | 10264.393 |
| 4331 | 10230.513 |
| 4332 | 10196.017 |
| 4333 | 10161.555 |
| 4334 | 10127.953 |
| 4335 | 10092.669 |
| 4336 | 10056.586 |
| 4337 | 10020.276 |
| 4338 | 9984.044 |
| 4339 | 9948.06 |
| 4340 | 9912.296 |
| 4341 | 9874.86 |
| 4342 | 9837.36 |
| 4343 | 9799.79 |
| 4344 | 9762.445 |
| 4345 | 9724.865 |
| 4346 | 9687.009 |
| 4347 | 9647.956 |
| 4348 | 9609.866 |
| 4349 | 9570.206 |
| 4350 | 9531.64 |
| 4351 | 9492.812 |
| 4352 | 9453.792 |
| 4353 | 9414.883 |
| 4354 | 9374.938 |
| 4355 | 9335.167 |
| 4356 | 9294.674 |
| 4357 | 9252.713 |
| 4358 | 9212.115 |
| 4359 | 9172.001 |
| 4360 | 9131.211 |
| 4361 | 9089.934 |
| 4362 | 9049.402 |
| 4363 | 9008.913 |
| 4364 | 8967.835 |
| 4365 | 8926.837 |
| 4366 | 8886.745 |
| 4367 | 8846.356 |
| 4368 | 8805.137 |
| 4369 | 8763.573 |
| 4370 | 8721.517 |
| 4371 | 8680.694 |
| 4372 | 8638.88 |
| 4373 | 8597.765 |
| 4374 | 8556.257 |
| 4375 | 8515.506 |
| 4376 | 8474.965 |
| 4377 | 8434.581 |
| 4378 | 8394.395 |
| 4379 | 8353.273 |
| 4380 | 8312.575 |
| 4381 | 8273.368 |
| 4382 | 8234.129 |
| 4383 | 8194.027 |
| 4384 | 8154.373 |
| 4385 | 8115.16 |
| 4386 | 8074.698 |
| 4387 | 8034.695 |
| 4388 | 7995.975 |
| 4389 | 7955.741 |
| 4390 | 7916.903 |
| 4391 | 7878.182 |
| 4392 | 7840.253 |
| 4393 | 7801.392 |
| 4394 | 7762.468 |
| 4395 | 7722.672 |
| 4396 | 7684.067 |
| 4397 | 7646.488 |
| 4398 | 7608.469 |
| 4399 | 7570.788 |
| 4400 | 7532.598 |
| 4401 | 7494.67 |
| 4402 | 7457.603 |
| 4403 | 7420.549 |
| 4404 | 7382.448 |
| 4405 | 7346.485 |
| 4406 | 7310.391 |
| 4407 | 7274.638 |
| 4408 | 7239.191 |
| 4409 | 7205.276 |
| 4410 | 7170.666 |
| 4411 | 7135.333 |
| 4412 | 7101.433 |
| 4413 | 7066.882 |
| 4414 | 7033.321 |
| 4415 | 6999.573 |
| 4416 | 6965.376 |
| 4417 | 6931.699 |
| 4418 | 6898.469 |
| 4419 | 6864.834 |
| 4420 | 6832.201 |
| 4421 | 6798.364 |
| 4422 | 6765.675 |
| 4423 | 6733.594 |
| 4424 | 6702.024 |
| 4425 | 6670.906 |
| 4426 | 6638.761 |
| 4427 | 6607.635 |
| 4428 | 6576.936 |
| 4429 | 6545.76 |
| 4430 | 6516.234 |
| 4431 | 6486.207 |
| 4432 | 6455.966 |
| 4433 | 6426.461 |
| 4434 | 6397.518 |
| 4435 | 6368.065 |
| 4436 | 6339.82 |
| 4437 | 6311.826 |
| 4438 | 6284.153 |
| 4439 | 6256.592 |
| 4440 | 6228.77 |
| 4441 | 6202.17 |
| 4442 | 6174.367 |
| 4443 | 6148.271 |
| 4444 | 6121.173 |
| 4445 | 6094.842 |
| 4446 | 6068.763 |
| 4447 | 6042.637 |
| 4448 | 6017.528 |
| 4449 | 5993.159 |
| 4450 | 5966.939 |
| 4451 | 5941.403 |
| 4452 | 5915.54 |
| 4453 | 5890.624 |
| 4454 | 5865.834 |
| 4455 | 5840.683 |
| 4456 | 5816.554 |
| 4457 | 5791.114 |
| 4458 | 5766.759 |
| 4459 | 5742.173 |
| 4460 | 5717.228 |
| 4461 | 5692.501 |
| 4462 | 5667.719 |
| 4463 | 5644.146 |
| 4464 | 5620.999 |
| 4465 | 5597.42 |
| 4466 | 5572.898 |
| 4467 | 5549.584 |
| 4468 | 5527.178 |
| 4469 | 5504.815 |
| 4470 | 5482.753 |
| 4471 | 5459.312 |
| 4472 | 5436.874 |
| 4473 | 5415.409 |
| 4474 | 5393.456 |
| 4475 | 5372.472 |
| 4476 | 5351.223 |
| 4477 | 5329.554 |
| 4478 | 5307.717 |
| 4479 | 5286.698 |
| 4480 | 5267.038 |
| 4481 | 5246.648 |
| 4482 | 5225.299 |
| 4483 | 5204.876 |
| 4484 | 5185.3 |
| 4485 | 5165.71 |
| 4486 | 5146.027 |
| 4487 | 5127.005 |
| 4488 | 5107.717 |
| 4489 | 5088.554 |
| 4490 | 5070.238 |
| 4491 | 5051.585 |
| 4492 | 5032.789 |
| 4493 | 5014.429 |
| 4494 | 4996.536 |
| 4495 | 4978.815 |
| 4496 | 4960.982 |
| 4497 | 4942.678 |
| 4498 | 4925.365 |
| 4499 | 4907.368 |
| 4500 | 4889.485 |
| 4501 | 4871.915 |
| 4502 | 4854.96 |
| 4503 | 4837.915 |
| 4504 | 4821.274 |
| 4505 | 4804.164 |
| 4506 | 4787.477 |
| 4507 | 4771.282 |
| 4508 | 4755.03 |
| 4509 | 4739.119 |
| 4510 | 4722.566 |
| 4511 | 4706.48 |
| 4512 | 4690.165 |
| 4513 | 4674.834 |
| 4514 | 4659.445 |
| 4515 | 4644.163 |
| 4516 | 4629.135 |
| 4517 | 4615.245 |
| 4518 | 4599.463 |
| 4519 | 4584.929 |
| 4520 | 4570.292 |
| 4521 | 4555.858 |
| 4522 | 4541.698 |
| 4523 | 4527.338 |
| 4524 | 4512.349 |
| 4525 | 4498.096 |
| 4526 | 4483.664 |
| 4527 | 4470.071 |
| 4528 | 4456.497 |
| 4529 | 4442.961 |
| 4530 | 4430.074 |
| 4531 | 4416.394 |
| 4532 | 4403.56 |
| 4533 | 4390.615 |
| 4534 | 4377.649 |
| 4535 | 4364.858 |
| 4536 | 4352.214 |
| 4537 | 4339.401 |
| 4538 | 4326.757 |
| 4539 | 4313.156 |
| 4540 | 4300.263 |
| 4541 | 4288.048 |
| 4542 | 4276.479 |
| 4543 | 4263.827 |
| 4544 | 4251.998 |
| 4545 | 4240.604 |
| 4546 | 4228.158 |
| 4547 | 4216.833 |
| 4548 | 4205.629 |
| 4549 | 4194.45 |
| 4550 | 4182.983 |
| 4551 | 4171.71 |
| 4552 | 4159.875 |
| 4553 | 4148.673 |
| 4554 | 4137.069 |
| 4555 | 4126.497 |
| 4556 | 4115.587 |
| 4557 | 4103.791 |
| 4558 | 4092.807 |
| 4559 | 4082.115 |
| 4560 | 4070.799 |
| 4561 | 4060.801 |
| 4562 | 4050.722 |
| 4563 | 4040.659 |
| 4564 | 4030.853 |
| 4565 | 4020.866 |
| 4566 | 4009.893 |
| 4567 | 3999.945 |
| 4568 | 3988.777 |
| 4569 | 3978.591 |
| 4570 | 3967.779 |
| 4571 | 3956.87 |
| 4572 | 3946.704 |
| 4573 | 3935.394 |
| 4574 | 3924.872 |
| 4575 | 3914.454 |
| 4576 | 3902.928 |
| 4577 | 3890.441 |
| 4578 | 3878.109 |
| 4579 | 3866.331 |
| 4580 | 3854.769 |
| 4581 | 3842.899 |
| 4582 | 3831.35 |
| 4583 | 3819.583 |
| 4584 | 3807.897 |
| 4585 | 3796.49 |
| 4586 | 3784.087 |
| 4587 | 3773.337 |
| 4588 | 3763.649 |
| 4589 | 3753.768 |
| 4590 | 3744.04 |
| 4591 | 3734.216 |
| 4592 | 3723.853 |
| 4593 | 3714.847 |
| 4594 | 3705.435 |
| 4595 | 3695.554 |
| 4596 | 3687.369 |
| 4597 | 3678.705 |
| 4598 | 3671.213 |
| 4599 | 3663.624 |
| 4600 | 3656.406 |
| 4601 | 3649.665 |
| 4602 | 3642.487 |
| 4603 | 3637.022 |
| 4604 | 3631.161 |
| 4605 | 3626.654 |
| 4606 | 3622.305 |
| 4607 | 3617.445 |
| 4608 | 3614.585 |
| 4609 | 3611.412 |
| 4610 | 3609.12 |
| 4611 | 3606.814 |
| 4612 | 3605.284 |
| 4613 | 3604.14 |
| 4614 | 3603.134 |
| 4615 | 3601.721 |
| 4616 | 3601.741 |
| 4617 | 3601.465 |
| 4618 | 3601.121 |
| 4619 | 3600.6 |
| 4620 | 3601.901 |
| 4621 | 3604.148 |
| 4622 | 3606.63 |
| 4623 | 3609.668 |
| 4624 | 3613.372 |
| 4625 | 3617.276 |
| 4626 | 3622.018 |
| 4627 | 3626.609 |
| 4628 | 3632.232 |
| 4629 | 3638.776 |
| 4630 | 3646.014 |
| 4631 | 3654.568 |
| 4632 | 3663.257 |
| 4633 | 3672.552 |
| 4634 | 3681.816 |
| 4635 | 3691.323 |
| 4636 | 3701.596 |
| 4637 | 3712.463 |
| 4638 | 3725.379 |
| 4639 | 3738.126 |
| 4640 | 3751.894 |
| 4641 | 3765.748 |
| 4642 | 3780.15 |
| 4643 | 3794.539 |
| 4644 | 3809.875 |
| 4645 | 3825.683 |
| 4646 | 3842.321 |
| 4647 | 3858.99 |
| 4648 | 3877.099 |
| 4649 | 3897.091 |
| 4650 | 3917.247 |
| 4651 | 3937.732 |
| 4652 | 3960.062 |
| 4653 | 3983.439 |
| 4654 | 4008.246 |
| 4655 | 4033.7 |
| 4656 | 4058.737 |
| 4657 | 4085.009 |
| 4658 | 4112.635 |
| 4659 | 4140.789 |
| 4660 | 4170.323 |
| 4661 | 4199.729 |
| 4662 | 4228.116 |
| 4663 | 4257.968 |
| 4664 | 4288.784 |
| 4665 | 4319.679 |
| 4666 | 4350.063 |
| 4667 | 4382.684 |
| 4668 | 4414.757 |
| 4669 | 4447.185 |
| 4670 | 4478.867 |
| 4671 | 4510.342 |
| 4672 | 4541.378 |
| 4673 | 4572.408 |
| 4674 | 4603.222 |
| 4675 | 4633.55 |
| 4676 | 4664.849 |
| 4677 | 4694.973 |
| 4678 | 4725.15 |
| 4679 | 4755.299 |
| 4680 | 4787.141 |
| 4681 | 4818.09 |
| 4682 | 4850.004 |
| 4683 | 4882.016 |
| 4684 | 4914.683 |
| 4685 | 4947.595 |
| 4686 | 4981.967 |
| 4687 | 5016.311 |
| 4688 | 5051.434 |
| 4689 | 5088.383 |
| 4690 | 5125.285 |
| 4691 | 5163.752 |
| 4692 | 5202.785 |
| 4693 | 5242.367 |
| 4694 | 5283.087 |
| 4695 | 5324.454 |
| 4696 | 5366.345 |
| 4697 | 5406.885 |
| 4698 | 5449.527 |
| 4699 | 5491.908 |
| 4700 | 5535.148 |
| 4701 | 5579.419 |
| 4702 | 5626.23 |
| 4703 | 5672.687 |
| 4704 | 5720.25 |
| 4705 | 5767.401 |
| 4706 | 5815.594 |
| 4707 | 5861.667 |
| 4708 | 5908.736 |
| 4709 | 5957.26 |
| 4710 | 6006.613 |
| 4711 | 6055.073 |
| 4712 | 6104.419 |
| 4713 | 6155.194 |
| 4714 | 6207.383 |
| 4715 | 6261.48 |
| 4716 | 6315.146 |
| 4717 | 6370.202 |
| 4718 | 6425.342 |
| 4719 | 6479.851 |
| 4720 | 6535.66 |
| 4721 | 6591.79 |
| 4722 | 6647.722 |
| 4723 | 6703.837 |
| 4724 | 6760.322 |
| 4725 | 6814.866 |
| 4726 | 6870.88 |
| 4727 | 6924.429 |
| 4728 | 6980.574 |
| 4729 | 7034.133 |
| 4730 | 7087.845 |
| 4731 | 7137.614 |
| 4732 | 7189.051 |
| 4733 | 7238.821 |
| 4734 | 7287.548 |
| 4735 | 7335.353 |
| 4736 | 7381.613 |
| 4737 | 7427.194 |
| 4738 | 7472.242 |
| 4739 | 7517.041 |
| 4740 | 7561.565 |
| 4741 | 7606.505 |
| 4742 | 7650.633 |
| 4743 | 7695.007 |
| 4744 | 7738.55 |
| 4745 | 7783.916 |
| 4746 | 7829.769 |
| 4747 | 7875.781 |
| 4748 | 7922.294 |
| 4749 | 7969.512 |
| 4750 | 8016.578 |
| 4751 | 8064.071 |
| 4752 | 8111.315 |
| 4753 | 8157.28 |
| 4754 | 8206.361 |
| 4755 | 8254.11 |
| 4756 | 8301.358 |
| 4757 | 8349.035 |
| 4758 | 8395.162 |
| 4759 | 8441.985 |
| 4760 | 8489.954 |
| 4761 | 8536.931 |
| 4762 | 8582.549 |
| 4763 | 8626.685 |
| 4764 | 8672.451 |
| 4765 | 8716.071 |
| 4766 | 8759.882 |
| 4767 | 8803.257 |
| 4768 | 8845.897 |
| 4769 | 8889.039 |
| 4770 | 8931.885 |
| 4771 | 8973.566 |
| 4772 | 9015.454 |
| 4773 | 9055.811 |
| 4774 | 9096.2 |
| 4775 | 9136.166 |
| 4776 | 9176.492 |
| 4777 | 9216.773 |
| 4778 | 9256.46 |
| 4779 | 9295.273 |
| 4780 | 9334.132 |
| 4781 | 9371.992 |
| 4782 | 9409.921 |
| 4783 | 9446.552 |
| 4784 | 9483.238 |
| 4785 | 9519.484 |
| 4786 | 9554.779 |
| 4787 | 9589.573 |
| 4788 | 9624.173 |
| 4789 | 9658.46 |
| 4790 | 9690.9 |
| 4791 | 9723.831 |
| 4792 | 9755.674 |
| 4793 | 9787.743 |
| 4794 | 9819.025 |
| 4795 | 9850.046 |
| 4796 | 9879.286 |
| 4797 | 9909.124 |
| 4798 | 9937.235 |
| 4799 | 9964.455 |
| 4800 | 9990.964 |
| 4801 | 10018.812 |
| 4802 | 10045.651 |
| 4803 | 10072.248 |
| 4804 | 10098.552 |
| 4805 | 10124.271 |
| 4806 | 10150.511 |
| 4807 | 10176.671 |
| 4808 | 10202.962 |
| 4809 | 10228.012 |
| 4810 | 10254.25 |
| 4811 | 10279.453 |
| 4812 | 10305.544 |
| 4813 | 10330.769 |
| 4814 | 10356.404 |
| 4815 | 10381.175 |
| 4816 | 10405.983 |
| 4817 | 10430.426 |
| 4818 | 10453.749 |
| 4819 | 10477.621 |
| 4820 | 10500.45 |
| 4821 | 10523.055 |
| 4822 | 10544.753 |
| 4823 | 10565.601 |
| 4824 | 10587.089 |
| 4825 | 10607.626 |
| 4826 | 10628.38 |
| 4827 | 10648.91 |
| 4828 | 10668.779 |
| 4829 | 10688.209 |
| 4830 | 10706.602 |
| 4831 | 10724.939 |
| 4832 | 10744.259 |
| 4833 | 10762.698 |
| 4834 | 10781.088 |
| 4835 | 10798.207 |
| 4836 | 10815.936 |
| 4837 | 10833.025 |
| 4838 | 10850.925 |
| 4839 | 10868.682 |
| 4840 | 10885.424 |
| 4841 | 10901.93 |
| 4842 | 10918.147 |
| 4843 | 10933.843 |
| 4844 | 10949.98 |
| 4845 | 10965.536 |
| 4846 | 10980.062 |
| 4847 | 10994.569 |
| 4848 | 11009.657 |
| 4849 | 11023.696 |
| 4850 | 11038.591 |
| 4851 | 11052.697 |
| 4852 | 11066.538 |
| 4853 | 11079.262 |
| 4854 | 11092.088 |
| 4855 | 11104.875 |
| 4856 | 11116.988 |
| 4857 | 11128.911 |
| 4858 | 11140.552 |
| 4859 | 11152.313 |
| 4860 | 11163.438 |
| 4861 | 11174.124 |
| 4862 | 11185.302 |
| 4863 | 11196.338 |
| 4864 | 11208.125 |
| 4865 | 11218.39 |
| 4866 | 11228.831 |
| 4867 | 11239.907 |
| 4868 | 11250.168 |
| 4869 | 11260.573 |
| 4870 | 11271.237 |
| 4871 | 11282.008 |
| 4872 | 11291.933 |
| 4873 | 11302.252 |
| 4874 | 11312.812 |
| 4875 | 11322.877 |
| 4876 | 11333.018 |
| 4877 | 11343.324 |
| 4878 | 11352.728 |
| 4879 | 11362.017 |
| 4880 | 11371.333 |
| 4881 | 11380.638 |
| 4882 | 11389.772 |
| 4883 | 11398.701 |
| 4884 | 11407.155 |
| 4885 | 11416.245 |
| 4886 | 11424.805 |
| 4887 | 11433.255 |
| 4888 | 11441.913 |
| 4889 | 11450.336 |
| 4890 | 11458.059 |
| 4891 | 11465.445 |
| 4892 | 11472.607 |
| 4893 | 11479.828 |
| 4894 | 11487.526 |
| 4895 | 11494.551 |
| 4896 | 11501.783 |
| 4897 | 11509.713 |
| 4898 | 11516.192 |
| 4899 | 11523.79 |
| 4900 | 11530.776 |
| 4901 | 11537.632 |
| 4902 | 11543.652 |
| 4903 | 11550.641 |
| 4904 | 11557.375 |
| 4905 | 11563.51 |
| 4906 | 11569.476 |
| 4907 | 11576.291 |
| 4908 | 11582.881 |
| 4909 | 11588.839 |
| 4910 | 11594.386 |
| 4911 | 11599.858 |
| 4912 | 11604.937 |
| 4913 | 11609.957 |
| 4914 | 11614.391 |
| 4915 | 11619.747 |
| 4916 | 11624.108 |
| 4917 | 11628.628 |
| 4918 | 11633.65 |
| 4919 | 11637.383 |
| 4920 | 11641.918 |
| 4921 | 11646.129 |
| 4922 | 11650.116 |
| 4923 | 11654.026 |
| 4924 | 11658.24 |
| 4925 | 11662.006 |
| 4926 | 11665.883 |
| 4927 | 11670.009 |
| 4928 | 11674.133 |
| 4929 | 11677.954 |
| 4930 | 11681.602 |
| 4931 | 11685.272 |
| 4932 | 11689.349 |
| 4933 | 11693.512 |
| 4934 | 11697.941 |
| 4935 | 11701.515 |
| 4936 | 11705.006 |
| 4937 | 11708.781 |
| 4938 | 11712.791 |
| 4939 | 11716.609 |
| 4940 | 11720.087 |
| 4941 | 11724.432 |
| 4942 | 11728.196 |
| 4943 | 11731.634 |
| 4944 | 11734.645 |
| 4945 | 11738.158 |
| 4946 | 11741.587 |
| 4947 | 11744.618 |
| 4948 | 11748.379 |
| 4949 | 11751.901 |
| 4950 | 11754.931 |
| 4951 | 11758.293 |
| 4952 | 11761.939 |
| 4953 | 11764.785 |
| 4954 | 11767.994 |
| 4955 | 11771.277 |
| 4956 | 11774.607 |
| 4957 | 11777.873 |
| 4958 | 11780.92 |
| 4959 | 11783.988 |
| 4960 | 11787.003 |
| 4961 | 11790.354 |
| 4962 | 11792.976 |
| 4963 | 11795.642 |
| 4964 | 11799.087 |
| 4965 | 11802.07 |
| 4966 | 11804.54 |
| 4967 | 11807.431 |
| 4968 | 11809.842 |
| 4969 | 11812.009 |
| 4970 | 11815.341 |
| 4971 | 11817.765 |
| 4972 | 11820.425 |
| 4973 | 11822.789 |
| 4974 | 11824.779 |
| 4975 | 11827.379 |
| 4976 | 11829.465 |
| 4977 | 11831.882 |
| 4978 | 11834.345 |
| 4979 | 11835.947 |
| 4980 | 11837.708 |
| 4981 | 11839.869 |
| 4982 | 11841.688 |
| 4983 | 11843.101 |
| 4984 | 11844.498 |
| 4985 | 11845.87 |
| 4986 | 11847.884 |
| 4987 | 11849.491 |
| 4988 | 11851.513 |
| 4989 | 11853.34 |
| 4990 | 11854.842 |
| 4991 | 11856.481 |
| 4992 | 11858.32 |
| 4993 | 11860.404 |
| 4994 | 11862.091 |
| 4995 | 11864.042 |
| 4996 | 11865.982 |
| 4997 | 11867.591 |
| 4998 | 11869.354 |
| 4999 | 11871.297 |
| 5000 | 11873.127 |
| 5001 | 11874.79 |
| 5002 | 11876.334 |
| 5003 | 11878.208 |
| 5004 | 11879.928 |
| 5005 | 11880.795 |
| 5006 | 11882.028 |
| 5007 | 11883.481 |
| 5008 | 11884.542 |
| 5009 | 11885.858 |
| 5010 | 11887.38 |
| 5011 | 11889.161 |
| 5012 | 11890.546 |
| 5013 | 11892.084 |
| 5014 | 11893.698 |
| 5015 | 11895.11 |
| 5016 | 11896.71 |
| 5017 | 11897.841 |
| 5018 | 11899.621 |
| 5019 | 11901.066 |
| 5020 | 11902.123 |
| 5021 | 11903.663 |
| 5022 | 11905.02 |
| 5023 | 11906.128 |
| 5024 | 11907.44 |
| 5025 | 11908.573 |
| 5026 | 11909.845 |
| 5027 | 11910.667 |
| 5028 | 11911.074 |
| 5029 | 11912.626 |
| 5030 | 11913.871 |
| 5031 | 11914.545 |
| 5032 | 11915.568 |
| 5033 | 11915.195 |
| 5034 | 11915.278 |
| 5035 | 11915.21 |
| 5036 | 11915.112 |
| 5037 | 11914.934 |
| 5038 | 11914.651 |
| 5039 | 11914.536 |
| 5040 | 11914.446 |
| 5041 | 11914.565 |
| 5042 | 11914.281 |
| 5043 | 11914.101 |
| 5044 | 11913.49 |
| 5045 | 11913.196 |
| 5046 | 11912.843 |
| 5047 | 11912.741 |
| 5048 | 11912.104 |
| 5049 | 11912.329 |
| 5050 | 11912.483 |
| 5051 | 11911.633 |
| 5052 | 11911.668 |
| 5053 | 11911.474 |
| 5054 | 11911.009 |
| 5055 | 11910.37 |
| 5056 | 11910.245 |
| 5057 | 11909.795 |
| 5058 | 11909.453 |
| 5059 | 11908.603 |
| 5060 | 11907.935 |
| 5061 | 11906.697 |
| 5062 | 11906.136 |
| 5063 | 11904.704 |
| 5064 | 11902.725 |
| 5065 | 11901.999 |
| 5066 | 11900.972 |
| 5067 | 11899.57 |
| 5068 | 11897.774 |
| 5069 | 11896.221 |
| 5070 | 11893.888 |
| 5071 | 11892.031 |
| 5072 | 11890.218 |
| 5073 | 11888.294 |
| 5074 | 11886.482 |
| 5075 | 11884.25 |
| 5076 | 11881.833 |
| 5077 | 11880.348 |
| 5078 | 11878.087 |
| 5079 | 11876.018 |
| 5080 | 11874.245 |
| 5081 | 11872.461 |
| 5082 | 11870.353 |
| 5083 | 11868.321 |
| 5084 | 11866.307 |
| 5085 | 11863.927 |
| 5086 | 11861.667 |
| 5087 | 11859.145 |
| 5088 | 11856.062 |
| 5089 | 11853.57 |
| 5090 | 11851.402 |
| 5091 | 11847.99 |
| 5092 | 11845.376 |
| 5093 | 11841.868 |
| 5094 | 11838.364 |
| 5095 | 11834.904 |
| 5096 | 11831.713 |
| 5097 | 11828.353 |
| 5098 | 11824.827 |
| 5099 | 11821.349 |
| 5100 | 11817.61 |
| 5101 | 11813.981 |
| 5102 | 11810.5 |
| 5103 | 11806.679 |
| 5104 | 11803.055 |
| 5105 | 11799.394 |
| 5106 | 11796.191 |
| 5107 | 11792.55 |
| 5108 | 11789.368 |
| 5109 | 11785.156 |
| 5110 | 11781.421 |
| 5111 | 11777.952 |
| 5112 | 11774.201 |
| 5113 | 11769.95 |
| 5114 | 11766.325 |
| 5115 | 11762.73 |
| 5116 | 11758.215 |
| 5117 | 11754.008 |
| 5118 | 11750.278 |
| 5119 | 11746.04 |
| 5120 | 11741.432 |
| 5121 | 11737.429 |
| 5122 | 11732.309 |
| 5123 | 11727.834 |
| 5124 | 11722.601 |
| 5125 | 11717.379 |
| 5126 | 11712.147 |
| 5127 | 11707.7 |
| 5128 | 11703.151 |
| 5129 | 11697.593 |
| 5130 | 11692.77 |
| 5131 | 11687.365 |
| 5132 | 11681.967 |
| 5133 | 11676.4 |
| 5134 | 11671.273 |
| 5135 | 11665.027 |
| 5136 | 11658.704 |
| 5137 | 11652.546 |
| 5138 | 11646.482 |
| 5139 | 11640.634 |
| 5140 | 11634.854 |
| 5141 | 11628.777 |
| 5142 | 11622.599 |
| 5143 | 11616.078 |
| 5144 | 11609.248 |
| 5145 | 11602.278 |
| 5146 | 11595.447 |
| 5147 | 11588.409 |
| 5148 | 11580.326 |
| 5149 | 11572.406 |
| 5150 | 11564.375 |
| 5151 | 11555.791 |
| 5152 | 11547.832 |
| 5153 | 11539.405 |
| 5154 | 11530.378 |
| 5155 | 11521.257 |
| 5156 | 11512.081 |
| 5157 | 11502.975 |
| 5158 | 11493.991 |
| 5159 | 11484.719 |
| 5160 | 11475.088 |
| 5161 | 11465.417 |
| 5162 | 11455.902 |
| 5163 | 11445.598 |
| 5164 | 11435.916 |
| 5165 | 11426.358 |
| 5166 | 11416.98 |
| 5167 | 11407.614 |
| 5168 | 11397.347 |
| 5169 | 11387.476 |
| 5170 | 11377.854 |
| 5171 | 11367.19 |
| 5172 | 11357.117 |
| 5173 | 11346.695 |
| 5174 | 11335.936 |
| 5175 | 11325.47 |
| 5176 | 11314.033 |
| 5177 | 11302.572 |
| 5178 | 11290.964 |
| 5179 | 11278.753 |
| 5180 | 11265.63 |
| 5181 | 11252.686 |
| 5182 | 11239.271 |
| 5183 | 11226.448 |
| 5184 | 11212.502 |
| 5185 | 11198.717 |
| 5186 | 11185.414 |
| 5187 | 11170.743 |
| 5188 | 11156.054 |
| 5189 | 11140.704 |
| 5190 | 11127.116 |
| 5191 | 11112.778 |
| 5192 | 11097.462 |
| 5193 | 11082.157 |
| 5194 | 11067.521 |
| 5195 | 11052.102 |
| 5196 | 11036.871 |
| 5197 | 11020.797 |
| 5198 | 11004.402 |
| 5199 | 10988.1 |
| 5200 | 10971.239 |
| 5201 | 10953.974 |
| 5202 | 10937.557 |
| 5203 | 10919.279 |
| 5204 | 10900.357 |
| 5205 | 10882.028 |
| 5206 | 10862.911 |
| 5207 | 10844.963 |
| 5208 | 10825.165 |
| 5209 | 10804.938 |
| 5210 | 10784.811 |
| 5211 | 10764.357 |
| 5212 | 10743.542 |
| 5213 | 10723.414 |
| 5214 | 10701.833 |
| 5215 | 10679.877 |
| 5216 | 10657.103 |
| 5217 | 10634.897 |
| 5218 | 10612.438 |
| 5219 | 10590.062 |
| 5220 | 10567.334 |
| 5221 | 10544.481 |
| 5222 | 10520.716 |
| 5223 | 10498.401 |
| 5224 | 10476.92 |
| 5225 | 10453.89 |
| 5226 | 10431.01 |
| 5227 | 10407.939 |
| 5228 | 10385.09 |
| 5229 | 10362.53 |
| 5230 | 10339.176 |
| 5231 | 10315.911 |
| 5232 | 10293.283 |
| 5233 | 10268.82 |
| 5234 | 10243.022 |
| 5235 | 10216.756 |
| 5236 | 10191.461 |
| 5237 | 10166.607 |
| 5238 | 10138.876 |
| 5239 | 10111.998 |
| 5240 | 10083.506 |
| 5241 | 10055.651 |
| 5242 | 10026.033 |
| 5243 | 9995.844 |
| 5244 | 9966.906 |
| 5245 | 9936.183 |
| 5246 | 9904.951 |
| 5247 | 9874.569 |
| 5248 | 9843.13 |
| 5249 | 9811.008 |
| 5250 | 9778.995 |
| 5251 | 9747.561 |
| 5252 | 9714.83 |
| 5253 | 9682.534 |
| 5254 | 9649.18 |
| 5255 | 9615.279 |
| 5256 | 9580.491 |
| 5257 | 9545.675 |
| 5258 | 9510.637 |
| 5259 | 9473.825 |
| 5260 | 9438.696 |
| 5261 | 9400.502 |
| 5262 | 9361.346 |
| 5263 | 9323.902 |
| 5264 | 9284.246 |
| 5265 | 9245.785 |
| 5266 | 9206.114 |
| 5267 | 9165.072 |
| 5268 | 9124.594 |
| 5269 | 9082.364 |
| 5270 | 9038.12 |
| 5271 | 8996.221 |
| 5272 | 8953.892 |
| 5273 | 8911.07 |
| 5274 | 8866.345 |
| 5275 | 8823.202 |
| 5276 | 8777.94 |
| 5277 | 8734.535 |
| 5278 | 8692.177 |
| 5279 | 8648.9 |
| 5280 | 8606.376 |
| 5281 | 8564.114 |
| 5282 | 8523.149 |
| 5283 | 8483.993 |
| 5284 | 8445.172 |
| 5285 | 8405.628 |
| 5286 | 8366.932 |
| 5287 | 8330.733 |
| 5288 | 8293.315 |
| 5289 | 8256.662 |
| 5290 | 8221.555 |
| 5291 | 8182.883 |
| 5292 | 8144.794 |
| 5293 | 8107.845 |
| 5294 | 8070.756 |
| 5295 | 8034.262 |
| 5296 | 7996.82 |
| 5297 | 7960.196 |
| 5298 | 7923.511 |
| 5299 | 7887.153 |
| 5300 | 7849.633 |
| 5301 | 7811.561 |
| 5302 | 7774.048 |
| 5303 | 7735.078 |
| 5304 | 7696.827 |
| 5305 | 7661.818 |
| 5306 | 7626.237 |
| 5307 | 7591.868 |
| 5308 | 7557.062 |
| 5309 | 7522.442 |
| 5310 | 7488.875 |
| 5311 | 7458.31 |
| 5312 | 7426.621 |
| 5313 | 7396.458 |
| 5314 | 7367.801 |
| 5315 | 7339.151 |
| 5316 | 7312.091 |
| 5317 | 7286.903 |
| 5318 | 7261.61 |
| 5319 | 7237.421 |
| 5320 | 7215.16 |
| 5321 | 7191.559 |
| 5322 | 7169.52 |
| 5323 | 7149.482 |
| 5324 | 7130.069 |
| 5325 | 7112.62 |
| 5326 | 7095.522 |
| 5327 | 7080.987 |
| 5328 | 7066.624 |
| 5329 | 7056.254 |
| 5330 | 7047.669 |
| 5331 | 7039.898 |
| 5332 | 7035.042 |
| 5333 | 7032.546 |
| 5334 | 7033.083 |
| 5335 | 7036.455 |
| 5336 | 7042.086 |
| 5337 | 7050.704 |
| 5338 | 7061.731 |
| 5339 | 7076.359 |
| 5340 | 7094.754 |
| 5341 | 7117.696 |
| 5342 | 7144.916 |
| 5343 | 7174.341 |
| 5344 | 7208.651 |
| 5345 | 7244.447 |
| 5346 | 7284.645 |
| 5347 | 7328.283 |
| 5348 | 7374.47 |
| 5349 | 7421.971 |
| 5350 | 7472.247 |
| 5351 | 7523.706 |
| 5352 | 7577.216 |
| 5353 | 7629.51 |
| 5354 | 7684.67 |
| 5355 | 7740.757 |
| 5356 | 7797.652 |
| 5357 | 7855.208 |
| 5358 | 7911.664 |
| 5359 | 7970.005 |
| 5360 | 8027.704 |
| 5361 | 8086.608 |
| 5362 | 8147.15 |
| 5363 | 8205.709 |
| 5364 | 8263.47 |
| 5365 | 8321.758 |
| 5366 | 8377.516 |
| 5367 | 8434.108 |
| 5368 | 8488.933 |
| 5369 | 8544.62 |
| 5370 | 8600.264 |
| 5371 | 8656.45 |
| 5372 | 8712.312 |
| 5373 | 8767.98 |
| 5374 | 8821.175 |
| 5375 | 8876.417 |
| 5376 | 8931.933 |
| 5377 | 8987.322 |
| 5378 | 9041.246 |
| 5379 | 9094.755 |
| 5380 | 9148.063 |
| 5381 | 9201.774 |
| 5382 | 9255.028 |
| 5383 | 9306.433 |
| 5384 | 9356.375 |
| 5385 | 9407.355 |
| 5386 | 9457.196 |
| 5387 | 9507.501 |
| 5388 | 9556.139 |
| 5389 | 9603.991 |
| 5390 | 9649.091 |
| 5391 | 9694.849 |
| 5392 | 9739.527 |
| 5393 | 9785.169 |
| 5394 | 9829.444 |
| 5395 | 9873.428 |
| 5396 | 9916.887 |
| 5397 | 9960.069 |
| 5398 | 10002.239 |
| 5399 | 10044.163 |
| 5400 | 10084.102 |
| 5401 | 10123.68 |
| 5402 | 10164.473 |
| 5403 | 10205.555 |
| 5404 | 10245.605 |
| 5405 | 10283.421 |
| 5406 | 10322.89 |
| 5407 | 10361.799 |
| 5408 | 10400.437 |
| 5409 | 10438.084 |
| 5410 | 10475.258 |
| 5411 | 10510.792 |
| 5412 | 10545.12 |
| 5413 | 10579.497 |
| 5414 | 10613.088 |
| 5415 | 10647.563 |
| 5416 | 10680.185 |
| 5417 | 10712.458 |
| 5418 | 10745.328 |
| 5419 | 10776.452 |
| 5420 | 10807.84 |
| 5421 | 10837.739 |
| 5422 | 10866.92 |
| 5423 | 10895.675 |
| 5424 | 10923.94 |
| 5425 | 10950.405 |
| 5426 | 10976.691 |
| 5427 | 11002.158 |
| 5428 | 11026.819 |
| 5429 | 11052.274 |
| 5430 | 11077.614 |
| 5431 | 11101.999 |
| 5432 | 11124.962 |
| 5433 | 11147.664 |
| 5434 | 11170.376 |
| 5435 | 11193.448 |
| 5436 | 11215.082 |
| 5437 | 11235.522 |
| 5438 | 11256.391 |
| 5439 | 11276.871 |
| 5440 | 11297.599 |
| 5441 | 11317.632 |
| 5442 | 11337.198 |
| 5443 | 11356.557 |
| 5444 | 11374.896 |
| 5445 | 11394.244 |
| 5446 | 11412.838 |
| 5447 | 11430.496 |
| 5448 | 11447.89 |
| 5449 | 11463.906 |
| 5450 | 11480.462 |
| 5451 | 11496.269 |
| 5452 | 11511.059 |
| 5453 | 11526.316 |
| 5454 | 11541.171 |
| 5455 | 11554.685 |
| 5456 | 11568.452 |
| 5457 | 11582.864 |
| 5458 | 11595.088 |
| 5459 | 11608.13 |
| 5460 | 11620.3 |
| 5461 | 11632.064 |
| 5462 | 11644.599 |
| 5463 | 11657.083 |
| 5464 | 11668.929 |
| 5465 | 11680.815 |
| 5466 | 11692.705 |
| 5467 | 11704.167 |
| 5468 | 11714.892 |
| 5469 | 11727.717 |
| 5470 | 11739.474 |
| 5471 | 11750.626 |
| 5472 | 11761.347 |
| 5473 | 11772.478 |
| 5474 | 11783.799 |
| 5475 | 11794.001 |
| 5476 | 11804.305 |
| 5477 | 11814.557 |
| 5478 | 11824.5 |
| 5479 | 11833.951 |
| 5480 | 11843.3 |
| 5481 | 11853.288 |
| 5482 | 11862.027 |
| 5483 | 11871.02 |
| 5484 | 11880.216 |
| 5485 | 11889.141 |
| 5486 | 11897.234 |
| 5487 | 11904.855 |
| 5488 | 11912.154 |
| 5489 | 11919.063 |
| 5490 | 11926.891 |
| 5491 | 11934.021 |
| 5492 | 11940.727 |
| 5493 | 11948.242 |
| 5494 | 11955.375 |
| 5495 | 11962.157 |
| 5496 | 11968.095 |
| 5497 | 11974.513 |
| 5498 | 11980.605 |
| 5499 | 11987.56 |
| 5500 | 11993.352 |
| 5501 | 11998.466 |
| 5502 | 12004.095 |
| 5503 | 12009.319 |
| 5504 | 12014.038 |
| 5505 | 12019.422 |
| 5506 | 12024.11 |
| 5507 | 12029.703 |
| 5508 | 12034.497 |
| 5509 | 12039.282 |
| 5510 | 12043.958 |
| 5511 | 12048.843 |
| 5512 | 12053.215 |
| 5513 | 12056.779 |
| 5514 | 12060.907 |
| 5515 | 12064.282 |
| 5516 | 12068.438 |
| 5517 | 12072.48 |
| 5518 | 12075.605 |
| 5519 | 12078.823 |
| 5520 | 12082.094 |
| 5521 | 12084.82 |
| 5522 | 12088.311 |
| 5523 | 12090.9 |
| 5524 | 12094.27 |
| 5525 | 12097.891 |
| 5526 | 12100.471 |
| 5527 | 12103.241 |
| 5528 | 12106.288 |
| 5529 | 12109.353 |
| 5530 | 12111.999 |
| 5531 | 12115.014 |
| 5532 | 12117.772 |
| 5533 | 12121.046 |
| 5534 | 12123.581 |
| 5535 | 12126.277 |
| 5536 | 12128.844 |
| 5537 | 12131.191 |
| 5538 | 12133.364 |
| 5539 | 12135.677 |
| 5540 | 12137.968 |
| 5541 | 12140.037 |
| 5542 | 12142.117 |
| 5543 | 12144.171 |
| 5544 | 12145.955 |
| 5545 | 12147.89 |
| 5546 | 12149.369 |
| 5547 | 12151.042 |
| 5548 | 12152.732 |
| 5549 | 12154.413 |
| 5550 | 12156.298 |
| 5551 | 12157.913 |
| 5552 | 12159.433 |
| 5553 | 12160.434 |
| 5554 | 12161.774 |
| 5555 | 12162.241 |
| 5556 | 12163.519 |
| 5557 | 12164.447 |
| 5558 | 12165.791 |
| 5559 | 12166.544 |
| 5560 | 12167.784 |
| 5561 | 12168.159 |
| 5562 | 12169.283 |
| 5563 | 12170.245 |
| 5564 | 12170.817 |
| 5565 | 12171.304 |
| 5566 | 12171.694 |
| 5567 | 12171.778 |
| 5568 | 12172.474 |
| 5569 | 12173.103 |
| 5570 | 12173.428 |
| 5571 | 12174.048 |
| 5572 | 12174.151 |
| 5573 | 12174.506 |
| 5574 | 12174.832 |
| 5575 | 12175.164 |
| 5576 | 12174.937 |
| 5577 | 12175.018 |
| 5578 | 12175.055 |
| 5579 | 12175.016 |
| 5580 | 12175.488 |
| 5581 | 12175.478 |
| 5582 | 12175.103 |
| 5583 | 12175.607 |
| 5584 | 12175.779 |
| 5585 | 12175.401 |
| 5586 | 12174.835 |
| 5587 | 12174.172 |
| 5588 | 12174.524 |
| 5589 | 12173.851 |
| 5590 | 12173.673 |
| 5591 | 12173.51 |
| 5592 | 12173.806 |
| 5593 | 12173.474 |
| 5594 | 12173.093 |
| 5595 | 12172.349 |
| 5596 | 12172.474 |
| 5597 | 12172.494 |
| 5598 | 12171.974 |
| 5599 | 12171.326 |
| 5600 | 12170.884 |
| 5601 | 12170.246 |
| 5602 | 12169.567 |
| 5603 | 12168.864 |
| 5604 | 12168.253 |
| 5605 | 12167.148 |
| 5606 | 12166.535 |
| 5607 | 12165.948 |
| 5608 | 12164.832 |
| 5609 | 12164.29 |
| 5610 | 12163.307 |
| 5611 | 12162.523 |
| 5612 | 12161.612 |
| 5613 | 12160.658 |
| 5614 | 12159.571 |
| 5615 | 12158.723 |
| 5616 | 12157.462 |
| 5617 | 12156.606 |
| 5618 | 12155.581 |
| 5619 | 12154.476 |
| 5620 | 12153.543 |
| 5621 | 12151.977 |
| 5622 | 12150.677 |
| 5623 | 12148.549 |
| 5624 | 12147.232 |
| 5625 | 12145.93 |
| 5626 | 12144.007 |
| 5627 | 12142.388 |
| 5628 | 12141.059 |
| 5629 | 12139.709 |
| 5630 | 12138.038 |
| 5631 | 12136.462 |
| 5632 | 12134.504 |
| 5633 | 12132.781 |
| 5634 | 12130.63 |
| 5635 | 12128.519 |
| 5636 | 12126.988 |
| 5637 | 12124.964 |
| 5638 | 12123.474 |
| 5639 | 12121.167 |
| 5640 | 12118.503 |
| 5641 | 12116.273 |
| 5642 | 12114.288 |
| 5643 | 12112.297 |
| 5644 | 12110.191 |
| 5645 | 12108.03 |
| 5646 | 12105.957 |
| 5647 | 12103.24 |
| 5648 | 12100.889 |
| 5649 | 12098.512 |
| 5650 | 12096.093 |
| 5651 | 12093.623 |
| 5652 | 12091.168 |
| 5653 | 12088.503 |
| 5654 | 12085.186 |
| 5655 | 12082.723 |
| 5656 | 12079.878 |
| 5657 | 12076.904 |
| 5658 | 12073.993 |
| 5659 | 12071.121 |
| 5660 | 12068.227 |
| 5661 | 12065.23 |
| 5662 | 12061.792 |
| 5663 | 12058.422 |
| 5664 | 12055.442 |
| 5665 | 12051.79 |
| 5666 | 12048.701 |
| 5667 | 12045.884 |
| 5668 | 12042.589 |
| 5669 | 12038.418 |
| 5670 | 12035.241 |
| 5671 | 12031.817 |
| 5672 | 12028.399 |
| 5673 | 12024.631 |
| 5674 | 12020.647 |
| 5675 | 12016.328 |
| 5676 | 12012.151 |
| 5677 | 12008.122 |
| 5678 | 12004.313 |
| 5679 | 11999.937 |
| 5680 | 11995.915 |
| 5681 | 11992.344 |
| 5682 | 11987.685 |
| 5683 | 11983.373 |
| 5684 | 11978.727 |
| 5685 | 11974.203 |
| 5686 | 11969.289 |
| 5687 | 11964.48 |
| 5688 | 11959.347 |
| 5689 | 11954.269 |
| 5690 | 11949.687 |
| 5691 | 11944.458 |
| 5692 | 11938.975 |
| 5693 | 11933.967 |
| 5694 | 11928.636 |
| 5695 | 11923.078 |
| 5696 | 11917.708 |
| 5697 | 11912.228 |
| 5698 | 11906.483 |
| 5699 | 11900.734 |
| 5700 | 11893.998 |
| 5701 | 11888.188 |
| 5702 | 11881.792 |
| 5703 | 11875.07 |
| 5704 | 11868.628 |
| 5705 | 11862.506 |
| 5706 | 11856.104 |
| 5707 | 11849.803 |
| 5708 | 11842.664 |
| 5709 | 11835.602 |
| 5710 | 11828.612 |
| 5711 | 11821.819 |
| 5712 | 11814.113 |
| 5713 | 11806.954 |
| 5714 | 11798.929 |
| 5715 | 11792.173 |
| 5716 | 11784.218 |
| 5717 | 11775.449 |
| 5718 | 11767.569 |
| 5719 | 11758.529 |
| 5720 | 11749.993 |
| 5721 | 11740.982 |
| 5722 | 11731.924 |
| 5723 | 11723.015 |
| 5724 | 11713.095 |
| 5725 | 11703.966 |
| 5726 | 11693.685 |
| 5727 | 11683.862 |
| 5728 | 11673.843 |
| 5729 | 11664.387 |
| 5730 | 11654.035 |
| 5731 | 11643.837 |
| 5732 | 11633.422 |
| 5733 | 11622.755 |
| 5734 | 11611.222 |
| 5735 | 11599.668 |
| 5736 | 11587.778 |
| 5737 | 11576.096 |
| 5738 | 11563.846 |
| 5739 | 11550.212 |
| 5740 | 11536.735 |
| 5741 | 11524.551 |
| 5742 | 11511.428 |
| 5743 | 11497.772 |
| 5744 | 11483.382 |
| 5745 | 11469.199 |
| 5746 | 11453.606 |
| 5747 | 11438.953 |
| 5748 | 11422.884 |
| 5749 | 11407.134 |
| 5750 | 11391.643 |
| 5751 | 11375.711 |
| 5752 | 11358.813 |
| 5753 | 11342.081 |
| 5754 | 11324.898 |
| 5755 | 11307.37 |
| 5756 | 11289.673 |
| 5757 | 11272.349 |
| 5758 | 11254.234 |
| 5759 | 11236.355 |
| 5760 | 11282.587 |
| 5761 | 11265.356 |
| 5762 | 11248.644 |
| 5763 | 11231.538 |
| 5764 | 11214.635 |
| 5765 | 11196.548 |
| 5766 | 11177.769 |
| 5767 | 11158.712 |
| 5768 | 11139.394 |
| 5769 | 11119.683 |
| 5770 | 11100.048 |
| 5771 | 11080.173 |
| 5772 | 11059.202 |
| 5773 | 11038.933 |
| 5774 | 11017.404 |
| 5775 | 10996.606 |
| 5776 | 10974.769 |
| 5777 | 10952.51 |
| 5778 | 10930.385 |
| 5779 | 10907.385 |
| 5780 | 10883.404 |
| 5781 | 10859.288 |
| 5782 | 10834.865 |
| 5783 | 10810.183 |
| 5784 | 10785.163 |
| 5785 | 10759.654 |
| 5786 | 10735.077 |
| 5787 | 10709.087 |
| 5788 | 10681.837 |
| 5789 | 10655.519 |
| 5790 | 10629.163 |
| 5791 | 10601.779 |
| 5792 | 10574.125 |
| 5793 | 10545.75 |
| 5794 | 10517.106 |
| 5795 | 10488.231 |
| 5796 | 10458.567 |
| 5797 | 10428.144 |
| 5798 | 10398.596 |
| 5799 | 10368.423 |
| 5800 | 10336.423 |
| 5801 | 10305.433 |
| 5802 | 10272.433 |
| 5803 | 10240.538 |
| 5804 | 10207.702 |
| 5805 | 10175.452 |
| 5806 | 10142.885 |
| 5807 | 10109.798 |
| 5808 | 10076.308 |
| 5809 | 10041.298 |
| 5810 | 10006.462 |
| 5811 | 9971.971 |
| 5812 | 9936.442 |
| 5813 | 9901.346 |
| 5814 | 9866.144 |
| 5815 | 9829.846 |
| 5816 | 9794.846 |
| 5817 | 9757.25 |
| 5818 | 9721.712 |
| 5819 | 9685.769 |
| 5820 | 9649.433 |
| 5821 | 9613.442 |
| 5822 | 9577.663 |
| 5823 | 9540.692 |
| 5824 | 9503.183 |
| 5825 | 9465.337 |
| 5826 | 9428.462 |
| 5827 | 9391.654 |
| 5828 | 9354.375 |
| 5829 | 9315.038 |
| 5830 | 9276.558 |
| 5831 | 9239.019 |
| 5832 | 9201.221 |
| 5833 | 9163.74 |
| 5834 | 9125.269 |
| 5835 | 9087.154 |
| 5836 | 9048.962 |
| 5837 | 9011.317 |
| 5838 | 8972.173 |
| 5839 | 8933.51 |
| 5840 | 8895.433 |
| 5841 | 8857.548 |
| 5842 | 8818.923 |
| 5843 | 8781.212 |
| 5844 | 8741.481 |
| 5845 | 8702.99 |
| 5846 | 8664.365 |
| 5847 | 8626.154 |
| 5848 | 8587.962 |
| 5849 | 8550.413 |
| 5850 | 8511.269 |
| 5851 | 8472.558 |
| 5852 | 8434.933 |
| 5853 | 8397.279 |
| 5854 | 8358.923 |
| 5855 | 8321.25 |
| 5856 | 8284.048 |
| 5857 | 8246.163 |
| 5858 | 8208.481 |
| 5859 | 8172.529 |
| 5860 | 8135.24 |
| 5861 | 8098.452 |
| 5862 | 8061.423 |
| 5863 | 8023.048 |
| 5864 | 7986.519 |
| 5865 | 7950.067 |
| 5866 | 7913.904 |
| 5867 | 7876.25 |
| 5868 | 7841.154 |
| 5869 | 7805.721 |
| 5870 | 7769.683 |
| 5871 | 7734.471 |
| 5872 | 7699.077 |
| 5873 | 7664.346 |
| 5874 | 7629.615 |
| 5875 | 7595.298 |
| 5876 | 7562.25 |
| 5877 | 7528.144 |
| 5878 | 7494.135 |
| 5879 | 7460.385 |
| 5880 | 7427.827 |
| 5881 | 7394.981 |
| 5882 | 7363.481 |
| 5883 | 7330.577 |
| 5884 | 7298.779 |
| 5885 | 7266.817 |
| 5886 | 7236.115 |
| 5887 | 7204.856 |
| 5888 | 7173.423 |
| 5889 | 7141.308 |
| 5890 | 7110.865 |
| 5891 | 7079.865 |
| 5892 | 7048.058 |
| 5893 | 7016.298 |
| 5894 | 6985.606 |
| 5895 | 6955.587 |
| 5896 | 6924.644 |
| 5897 | 6894.24 |
| 5898 | 6864.26 |
| 5899 | 6834.269 |
| 5900 | 6804.327 |
| 5901 | 6774.625 |
| 5902 | 6744.904 |
| 5903 | 6715.654 |
| 5904 | 6686 |
| 5905 | 6656.76 |
| 5906 | 6626.856 |
| 5907 | 6598.5 |
| 5908 | 6570.154 |
| 5909 | 6542.077 |
| 5910 | 6514.856 |
| 5911 | 6487.058 |
| 5912 | 6459.596 |
| 5913 | 6431.779 |
| 5914 | 6404 |
| 5915 | 6377.173 |
| 5916 | 6350.846 |
| 5917 | 6323.25 |
| 5918 | 6296.346 |
| 5919 | 6269.587 |
| 5920 | 6243.038 |
| 5921 | 6216.952 |
| 5922 | 6190.298 |
| 5923 | 6164.654 |
| 5924 | 6138.654 |
| 5925 | 6113.077 |
| 5926 | 6087.615 |
| 5927 | 6062.865 |
| 5928 | 6037.894 |
| 5929 | 6013.615 |
| 5930 | 5988.769 |
| 5931 | 5964.163 |
| 5932 | 5939.481 |
| 5933 | 5915.163 |
| 5934 | 5892.971 |
| 5935 | 5868.288 |
| 5936 | 5844.337 |
| 5937 | 5820.788 |
| 5938 | 5797.827 |
| 5939 | 5775.038 |
| 5940 | 5752.096 |
| 5941 | 5729.385 |
| 5942 | 5707.346 |
| 5943 | 5685.154 |
| 5944 | 5663.106 |
| 5945 | 5640.971 |
| 5946 | 5619.038 |
| 5947 | 5597.76 |
| 5948 | 5576.538 |
| 5949 | 5555.433 |
| 5950 | 5534.106 |
| 5951 | 5512.865 |
| 5952 | 5492.288 |
| 5953 | 5471.115 |
| 5954 | 5450.673 |
| 5955 | 5430.442 |
| 5956 | 5410.413 |
| 5957 | 5390.663 |
| 5958 | 5369.99 |
| 5959 | 5348.337 |
| 5960 | 5327.856 |
| 5961 | 5308.279 |
| 5962 | 5288.048 |
| 5963 | 5267.817 |
| 5964 | 5248.038 |
| 5965 | 5228.865 |
| 5966 | 5208.49 |
| 5967 | 5188.567 |
| 5968 | 5169.356 |
| 5969 | 5150.587 |
| 5970 | 5131.808 |
| 5971 | 5112.923 |
| 5972 | 5093.683 |
| 5973 | 5075.5 |
| 5974 | 5057.25 |
| 5975 | 5039.519 |
| 5976 | 5021.029 |
| 5977 | 5003.183 |
| 5978 | 4986.471 |
| 5979 | 4967.721 |
| 5980 | 4949.606 |
| 5981 | 4933.067 |
| 5982 | 4915.587 |
| 5983 | 4897.817 |
| 5984 | 4880.202 |
| 5985 | 4863.567 |
| 5986 | 4847.212 |
| 5987 | 4831.01 |
| 5988 | 4814.846 |
| 5989 | 4797.76 |
| 5990 | 4781.433 |
| 5991 | 4765.462 |
| 5992 | 4748.654 |
| 5993 | 4731.827 |
| 5994 | 4715.798 |
| 5995 | 4700.76 |
| 5996 | 4685.779 |
| 5997 | 4671.125 |
| 5998 | 4656.644 |
| 5999 | 4641.154 |
| 6000 | 4625.106 |
| 6001 | 4610.577 |
| 6002 | 4596.471 |
| 6003 | 4582.538 |
| 6004 | 4567.577 |
| 6005 | 4552.712 |
| 6006 | 4538.962 |
| 6007 | 4524.087 |
| 6008 | 4509.038 |
| 6009 | 4494.635 |
| 6010 | 4479.317 |
| 6011 | 4463.971 |
| 6012 | 4448.067 |
| 6013 | 4432.038 |
| 6014 | 4416.481 |
| 6015 | 4400.587 |
| 6016 | 4384.337 |
| 6017 | 4368.154 |
| 6018 | 4351.106 |
| 6019 | 4333.298 |
| 6020 | 4317.356 |
| 6021 | 4299.702 |
| 6022 | 4282.019 |
| 6023 | 4264.856 |
| 6024 | 4247.327 |
| 6025 | 4231.231 |
| 6026 | 4215.212 |
| 6027 | 4199.154 |
| 6028 | 4182.404 |
| 6029 | 4167.029 |
| 6030 | 4152.654 |
| 6031 | 4135.587 |
| 6032 | 4120.942 |
| 6033 | 4107.644 |
| 6034 | 4094.192 |
| 6035 | 4080.981 |
| 6036 | 4067.212 |
| 6037 | 4054.288 |
| 6038 | 4041.808 |
| 6039 | 4029.683 |
| 6040 | 4017.298 |
| 6041 | 4006.26 |
| 6042 | 3995.25 |
| 6043 | 3983.654 |
| 6044 | 3973.135 |
| 6045 | 3963.154 |
| 6046 | 3953.933 |
| 6047 | 3945.721 |
| 6048 | 3936.817 |
| 6049 | 3929.769 |
| 6050 | 3923.26 |
| 6051 | 3916.346 |
| 6052 | 3910 |
| 6053 | 3904.279 |
| 6054 | 3899.231 |
| 6055 | 3894 |
| 6056 | 3889.125 |
| 6057 | 3884.24 |
| 6058 | 3880.413 |
| 6059 | 3878.125 |
| 6060 | 3875.442 |
| 6061 | 3873.99 |
| 6062 | 3873.25 |
| 6063 | 3873.74 |
| 6064 | 3875.413 |
| 6065 | 3876.769 |
| 6066 | 3880.269 |
| 6067 | 3884.346 |
| 6068 | 3888.99 |
| 6069 | 3892.99 |
| 6070 | 3898.548 |
| 6071 | 3904.077 |
| 6072 | 3911.154 |
| 6073 | 3918.76 |
| 6074 | 3925.99 |
| 6075 | 3934.212 |
| 6076 | 3942.692 |
| 6077 | 3952.529 |
| 6078 | 3962.769 |
| 6079 | 3973.308 |
| 6080 | 3984.663 |
| 6081 | 3997.433 |
| 6082 | 4010.654 |
| 6083 | 4023.183 |
| 6084 | 4036.394 |
| 6085 | 4049.712 |
| 6086 | 4064.202 |
| 6087 | 4079.385 |
| 6088 | 4095.029 |
| 6089 | 4112.269 |
| 6090 | 4131.125 |
| 6091 | 4150 |
| 6092 | 4171.529 |
| 6093 | 4192.375 |
| 6094 | 4214.442 |
| 6095 | 4237.125 |
| 6096 | 4261.202 |
| 6097 | 4285.029 |
| 6098 | 4309.433 |
| 6099 | 4334.077 |
| 6100 | 4360.481 |
| 6101 | 4386.75 |
| 6102 | 4412.913 |
| 6103 | 4440.087 |
| 6104 | 4467.74 |
| 6105 | 4496.51 |
| 6106 | 4526.654 |
| 6107 | 4557.163 |
| 6108 | 4587.692 |
| 6109 | 4616.548 |
| 6110 | 4646.433 |
| 6111 | 4675.788 |
| 6112 | 4705.135 |
| 6113 | 4734.01 |
| 6114 | 4763.394 |
| 6115 | 4793.663 |
| 6116 | 4823.337 |
| 6117 | 4852.712 |
| 6118 | 4882.231 |
| 6119 | 4912.471 |
| 6120 | 4944.029 |
| 6121 | 4974.981 |
| 6122 | 5007.327 |
| 6123 | 5039.567 |
| 6124 | 5071.788 |
| 6125 | 5103.692 |
| 6126 | 5137.596 |
| 6127 | 5172.981 |
| 6128 | 5208.577 |
| 6129 | 5244.654 |
| 6130 | 5282.077 |
| 6131 | 5319.865 |
| 6132 | 5357.74 |
| 6133 | 5396.231 |
| 6134 | 5435.029 |
| 6135 | 5475.154 |
| 6136 | 5516.173 |
| 6137 | 5557.375 |
| 6138 | 5599.231 |
| 6139 | 5640.817 |
| 6140 | 5683.125 |
| 6141 | 5726.51 |
| 6142 | 5771.702 |
| 6143 | 5815.962 |
| 6144 | 5860.779 |
| 6145 | 5905.337 |
| 6146 | 5949.981 |
| 6147 | 5995.442 |
| 6148 | 6040.673 |
| 6149 | 6086.558 |
| 6150 | 6133.212 |
| 6151 | 6179.558 |
| 6152 | 6227.683 |
| 6153 | 6275.394 |
| 6154 | 6324.308 |
| 6155 | 6375.529 |
| 6156 | 6426.644 |
| 6157 | 6479.904 |
| 6158 | 6532.24 |
| 6159 | 6585.654 |
| 6160 | 6639.76 |
| 6161 | 6691.875 |
| 6162 | 6747.106 |
| 6163 | 6801.221 |
| 6164 | 6855.269 |
| 6165 | 6909.019 |
| 6166 | 6961.856 |
| 6167 | 7014.5 |
| 6168 | 7068.144 |
| 6169 | 7119.702 |
| 6170 | 7170.24 |
| 6171 | 7219.885 |
| 6172 | 7269.548 |
| 6173 | 7317.538 |
| 6174 | 7364.75 |
| 6175 | 7411.365 |
| 6176 | 7456.538 |
| 6177 | 7499.712 |
| 6178 | 7541.952 |
| 6179 | 7584.577 |
| 6180 | 7626.288 |
| 6181 | 7667.51 |
| 6182 | 7709.048 |
| 6183 | 7751.183 |
| 6184 | 7795.596 |
| 6185 | 7838.529 |
| 6186 | 7881.635 |
| 6187 | 7925.481 |
| 6188 | 7970.413 |
| 6189 | 8014.798 |
| 6190 | 8059.952 |
| 6191 | 8106.221 |
| 6192 | 8151.327 |
| 6193 | 8195.394 |
| 6194 | 8241.769 |
| 6195 | 8288.625 |
| 6196 | 8335.788 |
| 6197 | 8382.75 |
| 6198 | 8428.144 |
| 6199 | 8475.337 |
| 6200 | 8520.038 |
| 6201 | 8564.558 |
| 6202 | 8609.115 |
| 6203 | 8651.173 |
| 6204 | 8694.779 |
| 6205 | 8738.433 |
| 6206 | 8781.625 |
| 6207 | 8823.212 |
| 6208 | 8865.51 |
| 6209 | 8907.087 |
| 6210 | 8947.692 |
| 6211 | 8988.76 |
| 6212 | 9029.721 |
| 6213 | 9070.038 |
| 6214 | 9109.596 |
| 6215 | 9149.346 |
| 6216 | 9189.308 |
| 6217 | 9228.24 |
| 6218 | 9267.702 |
| 6219 | 9305.904 |
| 6220 | 9344.74 |
| 6221 | 9381.317 |
| 6222 | 9418.337 |
| 6223 | 9454.788 |
| 6224 | 9491.231 |
| 6225 | 9527.048 |
| 6226 | 9561.798 |
| 6227 | 9595.904 |
| 6228 | 9630.942 |
| 6229 | 9663.885 |
| 6230 | 9696.115 |
| 6231 | 9728.413 |
| 6232 | 9760.731 |
| 6233 | 9791.702 |
| 6234 | 9822.144 |
| 6235 | 9851.24 |
| 6236 | 9879.875 |
| 6237 | 9908.654 |
| 6238 | 9936.625 |
| 6239 | 9963.567 |
| 6240 | 9990.154 |
| 6241 | 10017.096 |
| 6242 | 10043.212 |
| 6243 | 10067.769 |
| 6244 | 10093.519 |
| 6245 | 10119.375 |
| 6246 | 10144.808 |
| 6247 | 10170.048 |
| 6248 | 10194.442 |
| 6249 | 10219.231 |
| 6250 | 10244.212 |
| 6251 | 10268.635 |
| 6252 | 10293.385 |
| 6253 | 10316.721 |
| 6254 | 10340.413 |
| 6255 | 10362.837 |
| 6256 | 10386.077 |
| 6257 | 10409.731 |
| 6258 | 10432.25 |
| 6259 | 10454.846 |
| 6260 | 10476.442 |
| 6261 | 10498.135 |
| 6262 | 10519.337 |
| 6263 | 10539.269 |
| 6264 | 10560 |
| 6265 | 10580.529 |
| 6266 | 10600.817 |
| 6267 | 10621.058 |
| 6268 | 10640.173 |
| 6269 | 10659.75 |
| 6270 | 10678.5 |
| 6271 | 10696.962 |
| 6272 | 10714.817 |
| 6273 | 10732.115 |
| 6274 | 10749.894 |
| 6275 | 10767.404 |
| 6276 | 10784.615 |
| 6277 | 10801.558 |
| 6278 | 10818.269 |
| 6279 | 10834.875 |
| 6280 | 10851.606 |
| 6281 | 10867.173 |
| 6282 | 10882.99 |
| 6283 | 10898.462 |
| 6284 | 10912.885 |
| 6285 | 10928.308 |
| 6286 | 10943.346 |
| 6287 | 10957.75 |
| 6288 | 10972.442 |
| 6289 | 10986.087 |
| 6290 | 11000.365 |
| 6291 | 11014.163 |
| 6292 | 11026.99 |
| 6293 | 11039.471 |
| 6294 | 11051.894 |
| 6295 | 11063.875 |
| 6296 | 11076.087 |
| 6297 | 11087.529 |
| 6298 | 11098.548 |
| 6299 | 11110.25 |
| 6300 | 11121.106 |
| 6301 | 11131.192 |
| 6302 | 11141.548 |
| 6303 | 11152.26 |
| 6304 | 11162.279 |
| 6305 | 11172.183 |
| 6306 | 11182.317 |
| 6307 | 11192.673 |
| 6308 | 11202.913 |
| 6309 | 11212.798 |
| 6310 | 11222.779 |
| 6311 | 11232.587 |
| 6312 | 11241.673 |
| 6313 | 11250.885 |
| 6314 | 11260.673 |
| 6315 | 11270.202 |
| 6316 | 11279.221 |
| 6317 | 11288.692 |
| 6318 | 11297.337 |
| 6319 | 11306.183 |
| 6320 | 11315.183 |
| 6321 | 11323.587 |
| 6322 | 11331.317 |
| 6323 | 11339.394 |
| 6324 | 11347.567 |
| 6325 | 11354.769 |
| 6326 | 11362 |
| 6327 | 11369.5 |
| 6328 | 11377.135 |
| 6329 | 11384.404 |
| 6330 | 11391.731 |
| 6331 | 11398.625 |
| 6332 | 11405.346 |
| 6333 | 11412.135 |
| 6334 | 11418.846 |
| 6335 | 11425.067 |
| 6336 | 11431.587 |
| 6337 | 11438.183 |
| 6338 | 11443.942 |
| 6339 | 11450.173 |
| 6340 | 11456.365 |
| 6341 | 11462.298 |
| 6342 | 11468.058 |
| 6343 | 11474.846 |
| 6344 | 11480.596 |
| 6345 | 11486.058 |
| 6346 | 11491.404 |
| 6347 | 11496.654 |
| 6348 | 11501.817 |
| 6349 | 11506.288 |
| 6350 | 11511.423 |
| 6351 | 11516.721 |
| 6352 | 11520.875 |
| 6353 | 11525.221 |
| 6354 | 11529.356 |
| 6355 | 11532.731 |
| 6356 | 11536.192 |
| 6357 | 11539.529 |
| 6358 | 11543.25 |
| 6359 | 11546.644 |
| 6360 | 11549.038 |
| 6361 | 11551.798 |
| 6362 | 11554.394 |
| 6363 | 11556.913 |
| 6364 | 11559.548 |
| 6365 | 11561.827 |
| 6366 | 11565.202 |
| 6367 | 11568.625 |
| 6368 | 11571.51 |
| 6369 | 11574.375 |
| 6370 | 11577.519 |
| 6371 | 11580.548 |
| 6372 | 11583.144 |
| 6373 | 11585.519 |
| 6374 | 11587.837 |
| 6375 | 11590.462 |
| 6376 | 11593.375 |
| 6377 | 11595.26 |
| 6378 | 11598.038 |
| 6379 | 11601.279 |
| 6380 | 11603.788 |
| 6381 | 11606.587 |
| 6382 | 11608.856 |
| 6383 | 11611.087 |
| 6384 | 11612.837 |
| 6385 | 11614.808 |
| 6386 | 11616.404 |
| 6387 | 11618.635 |
| 6388 | 11620.538 |
| 6389 | 11622.51 |
| 6390 | 11623.904 |
| 6391 | 11625.558 |
| 6392 | 11627.538 |
| 6393 | 11628.923 |
| 6394 | 11630.904 |
| 6395 | 11633.173 |
| 6396 | 11634.75 |
| 6397 | 11635.75 |
| 6398 | 11636.913 |
| 6399 | 11638.173 |
| 6400 | 11638.971 |
| 6401 | 11640.365 |
| 6402 | 11641.567 |
| 6403 | 11642.913 |
| 6404 | 11644.577 |
| 6405 | 11645.298 |
| 6406 | 11646.077 |
| 6407 | 11647.279 |
| 6408 | 11647.933 |
| 6409 | 11648.712 |
| 6410 | 11649.529 |
| 6411 | 11649.75 |
| 6412 | 11650.048 |
| 6413 | 11650.154 |
| 6414 | 11649.837 |
| 6415 | 11648.875 |
| 6416 | 11648.558 |
| 6417 | 11648.442 |
| 6418 | 11647.894 |
| 6419 | 11647.106 |
| 6420 | 11646.558 |
| 6421 | 11645.615 |
| 6422 | 11645.288 |
| 6423 | 11644.308 |
| 6424 | 11643.144 |
| 6425 | 11643.106 |
| 6426 | 11642.096 |
| 6427 | 11641.885 |
| 6428 | 11640.606 |
| 6429 | 11640.288 |
| 6430 | 11639.615 |
| 6431 | 11638.712 |
| 6432 | 11637.058 |
| 6433 | 11636.183 |
| 6434 | 11635.981 |
| 6435 | 11635.279 |
| 6436 | 11634.288 |
| 6437 | 11633.76 |
| 6438 | 11632.971 |
| 6439 | 11632.077 |
| 6440 | 11630.721 |
| 6441 | 11629.644 |
| 6442 | 11628.144 |
| 6443 | 11627.077 |
| 6444 | 11625.625 |
| 6445 | 11624.221 |
| 6446 | 11622.327 |
| 6447 | 11621.317 |
| 6448 | 11619.596 |
| 6449 | 11618.26 |
| 6450 | 11617.01 |
| 6451 | 11615.808 |
| 6452 | 11614.087 |
| 6453 | 11612.827 |
| 6454 | 11611.288 |
| 6455 | 11609.317 |
| 6456 | 11608.529 |
| 6457 | 11606.846 |
| 6458 | 11605.548 |
| 6459 | 11603.635 |
| 6460 | 11602.01 |
| 6461 | 11600.702 |
| 6462 | 11599.048 |
| 6463 | 11596.856 |
| 6464 | 11594.269 |
| 6465 | 11591.596 |
| 6466 | 11589.24 |
| 6467 | 11587.173 |
| 6468 | 11584.904 |
| 6469 | 11582.337 |
| 6470 | 11579.558 |
| 6471 | 11576.606 |
| 6472 | 11573.221 |
| 6473 | 11569.76 |
| 6474 | 11566.231 |
| 6475 | 11562.327 |
| 6476 | 11559.25 |
| 6477 | 11555.577 |
| 6478 | 11551.981 |
| 6479 | 11548.606 |
| 6480 | 11545.587 |
| 6481 | 11542.029 |
| 6482 | 11538.356 |
| 6483 | 11534.596 |
| 6484 | 11531.654 |
| 6485 | 11528.183 |
| 6486 | 11524.933 |
| 6487 | 11521.356 |
| 6488 | 11517.923 |
| 6489 | 11514.269 |
| 6490 | 11511.394 |
| 6491 | 11508.49 |
| 6492 | 11505.317 |
| 6493 | 11502.423 |
| 6494 | 11499.077 |
| 6495 | 11495.913 |
| 6496 | 11492.702 |
| 6497 | 11489.74 |
| 6498 | 11486.481 |
| 6499 | 11483.346 |
| 6500 | 11479.894 |
| 6501 | 11476.731 |
| 6502 | 11473.644 |
| 6503 | 11469.75 |
| 6504 | 11465.615 |
| 6505 | 11462.163 |
| 6506 | 11458.894 |
| 6507 | 11455.298 |
| 6508 | 11451.356 |
| 6509 | 11447.433 |
| 6510 | 11444.288 |
| 6511 | 11440.635 |
| 6512 | 11436.25 |
| 6513 | 11432.587 |
| 6514 | 11429.106 |
| 6515 | 11425.702 |
| 6516 | 11422.288 |
| 6517 | 11418.587 |
| 6518 | 11415.683 |
| 6519 | 11412.135 |
| 6520 | 11408.942 |
| 6521 | 11405.048 |
| 6522 | 11401.933 |
| 6523 | 11398.596 |
| 6524 | 11395.856 |
| 6525 | 11392.288 |
| 6526 | 11389.019 |
| 6527 | 11385.394 |
| 6528 | 11382.288 |
| 6529 | 11379.038 |
| 6530 | 11375.654 |
| 6531 | 11372.683 |
| 6532 | 11370.01 |
| 6533 | 11367.058 |
| 6534 | 11363.856 |
| 6535 | 11360.202 |
| 6536 | 11357.135 |
| 6537 | 11353.144 |
| 6538 | 11349.615 |
| 6539 | 11346.596 |
| 6540 | 11343.087 |
| 6541 | 11340.144 |
| 6542 | 11336.654 |
| 6543 | 11332.846 |
| 6544 | 11329.173 |
| 6545 | 11326.067 |
| 6546 | 11323.135 |
| 6547 | 11319.923 |
| 6548 | 11317.106 |
| 6549 | 11314.135 |
| 6550 | 11310.856 |
| 6551 | 11308.404 |
| 6552 | 11305.635 |
| 6553 | 11303.077 |
| 6554 | 11299.096 |
| 6555 | 11295.923 |
| 6556 | 11293.212 |
| 6557 | 11290.423 |
| 6558 | 11287.365 |
| 6559 | 11284.385 |
| 6560 | 11281.577 |
| 6561 | 11278.769 |
| 6562 | 11275 |
| 6563 | 11271.846 |
| 6564 | 11267.74 |
| 6565 | 11263.971 |
| 6566 | 11259.644 |
| 6567 | 11255.596 |
| 6568 | 11251.269 |
| 6569 | 11246.74 |
| 6570 | 11242.51 |
| 6571 | 11238.135 |
| 6572 | 11234.048 |
| 6573 | 11229.846 |
| 6574 | 11225.5 |
| 6575 | 11220.471 |
| 6576 | 11215.663 |
| 6577 | 11210.962 |
| 6578 | 11206.356 |
| 6579 | 11201.692 |
| 6580 | 11196.721 |
| 6581 | 11191.442 |
| 6582 | 11185.683 |
| 6583 | 11180.548 |
| 6584 | 11174.519 |
| 6585 | 11168.904 |
| 6586 | 11163.337 |
| 6587 | 11157.452 |
| 6588 | 11151.337 |
| 6589 | 11144.827 |
| 6590 | 11138.779 |
| 6591 | 11132.365 |
| 6592 | 11124.885 |
| 6593 | 11117.837 |
| 6594 | 11110.846 |
| 6595 | 11103.865 |
| 6596 | 11096.26 |
| 6597 | 11088.221 |
| 6598 | 11080.606 |
| 6599 | 11072.894 |
| 6600 | 11063.962 |
| 6601 | 11056.154 |
| 6602 | 11047.981 |
| 6603 | 11040 |
| 6604 | 11031.635 |
| 6605 | 11023.25 |
| 6606 | 11014.846 |
| 6607 | 11006.337 |
| 6608 | 10997.894 |
| 6609 | 10988.942 |
| 6610 | 10980.106 |
| 6611 | 10971.135 |
| 6612 | 10962.298 |
| 6613 | 10952.5 |
| 6614 | 10944 |
| 6615 | 10934.24 |
| 6616 | 10924.067 |
| 6617 | 10914.404 |
| 6618 | 10905.337 |
| 6619 | 10894.625 |
| 6620 | 10882.558 |
| 6621 | 10871.846 |
| 6622 | 10860.538 |
| 6623 | 10849.346 |
| 6624 | 10837.375 |
| 6625 | 10825 |
| 6626 | 10814.019 |
| 6627 | 10800.644 |
| 6628 | 10787.51 |
| 6629 | 10774.644 |
| 6630 | 10761.394 |
| 6631 | 10748.577 |
| 6632 | 10736.125 |
| 6633 | 10723.74 |
| 6634 | 10709.981 |
| 6635 | 10696.538 |
| 6636 | 10683.385 |
| 6637 | 10670.24 |
| 6638 | 10656.298 |
| 6639 | 10641.837 |
| 6640 | 10627.587 |
| 6641 | 10613.26 |
| 6642 | 10598.606 |
| 6643 | 10583.221 |
| 6644 | 10567.375 |
| 6645 | 10551.712 |
| 6646 | 10534.952 |
| 6647 | 10519.452 |
| 6648 | 10503.173 |
| 6649 | 10487.279 |
| 6650 | 10471.125 |
| 6651 | 10454.481 |
| 6652 | 10436.942 |
| 6653 | 10418.548 |
| 6654 | 10401.635 |
| 6655 | 10384.125 |
| 6656 | 10366.135 |
| 6657 | 10348.635 |
| 6658 | 10329.635 |
| 6659 | 10310.038 |
| 6660 | 10291.779 |
| 6661 | 10272.913 |
| 6662 | 10253.933 |
| 6663 | 10235.279 |
| 6664 | 10216.519 |
| 6665 | 10197.038 |
| 6666 | 10177.798 |
| 6667 | 10159.375 |
| 6668 | 10140.356 |
| 6669 | 10120.5 |
| 6670 | 10101.962 |
| 6671 | 10082.481 |
| 6672 | 10062.058 |
| 6673 | 10042.298 |
| 6674 | 10022 |
| 6675 | 10001.721 |
| 6676 | 9980.5 |
| 6677 | 9959.135 |
| 6678 | 9935.413 |
| 6679 | 9912.317 |
| 6680 | 9888.913 |
| 6681 | 9866.038 |
| 6682 | 9840.808 |
| 6683 | 9815.644 |
| 6684 | 9789.99 |
| 6685 | 9763.663 |
| 6686 | 9737.798 |
| 6687 | 9711.721 |
| 6688 | 9685.712 |
| 6689 | 9658.663 |
| 6690 | 9631.288 |
| 6691 | 9602.183 |
| 6692 | 9574.808 |
| 6693 | 9545.971 |
| 6694 | 9517.529 |
| 6695 | 9488.115 |
| 6696 | 9457.683 |
| 6697 | 9428.202 |
| 6698 | 9395.856 |
| 6699 | 9364.067 |
| 6700 | 9331.202 |
| 6701 | 9299.24 |
| 6702 | 9265.837 |
| 6703 | 9232.125 |
| 6704 | 9199.087 |
| 6705 | 9165.481 |
| 6706 | 9130.394 |
| 6707 | 9093.856 |
| 6708 | 9057.087 |
| 6709 | 9020.635 |
| 6710 | 8984.375 |
| 6711 | 8946.558 |
| 6712 | 8910.558 |
| 6713 | 8871.933 |
| 6714 | 8832.25 |
| 6715 | 8795.308 |
| 6716 | 8756.846 |
| 6717 | 8717.596 |
| 6718 | 8679.865 |
| 6719 | 8639.865 |
| 6720 | 8601.51 |
| 6721 | 8565.25 |
| 6722 | 8527.885 |
| 6723 | 8491.279 |
| 6724 | 8454.615 |
| 6725 | 8418.779 |
| 6726 | 8384.048 |
| 6727 | 8348.346 |
| 6728 | 8313.096 |
| 6729 | 8279.663 |
| 6730 | 8246.308 |
| 6731 | 8212.923 |
| 6732 | 8178.538 |
| 6733 | 8146.029 |
| 6734 | 8112.683 |
| 6735 | 8080.635 |
| 6736 | 8047.683 |
| 6737 | 8014.279 |
| 6738 | 7980.558 |
| 6739 | 7945.798 |
| 6740 | 7912.173 |
| 6741 | 7879.298 |
| 6742 | 7845.615 |
| 6743 | 7813.837 |
| 6744 | 7779.462 |
| 6745 | 7746.942 |
| 6746 | 7714.769 |
| 6747 | 7682.452 |
| 6748 | 7651.577 |
| 6749 | 7621.913 |
| 6750 | 7590.846 |
| 6751 | 7562.067 |
| 6752 | 7532.663 |
| 6753 | 7506.077 |
| 6754 | 7480.038 |
| 6755 | 7453.048 |
| 6756 | 7427.683 |
| 6757 | 7402.731 |
| 6758 | 7376.702 |
| 6759 | 7354.115 |
| 6760 | 7329.923 |
| 6761 | 7306.587 |
| 6762 | 7285.692 |
| 6763 | 7265.385 |
| 6764 | 7246.212 |
| 6765 | 7228.587 |
| 6766 | 7213.029 |
| 6767 | 7199.279 |
| 6768 | 7185.288 |
| 6769 | 7174.452 |
| 6770 | 7164.663 |
| 6771 | 7156.413 |
| 6772 | 7152.404 |
| 6773 | 7149.798 |
| 6774 | 7150.221 |
| 6775 | 7150.577 |
| 6776 | 7156.01 |
| 6777 | 7164.779 |
| 6778 | 7175.875 |
| 6779 | 7192.308 |
| 6780 | 7209.413 |
| 6781 | 7231.635 |
| 6782 | 7257.413 |
| 6783 | 7286.538 |
| 6784 | 7320.385 |
| 6785 | 7356.817 |
| 6786 | 7395.837 |
| 6787 | 7439.135 |
| 6788 | 7484.904 |
| 6789 | 7533.298 |
| 6790 | 7581.885 |
| 6791 | 7631.019 |
| 6792 | 7683.712 |
| 6793 | 7736.26 |
| 6794 | 7790.298 |
| 6795 | 7845.702 |
| 6796 | 7900.567 |
| 6797 | 7957.865 |
| 6798 | 8015.837 |
| 6799 | 8071.904 |
| 6800 | 8128.567 |
| 6801 | 8185.356 |
| 6802 | 8243.356 |
| 6803 | 8299.981 |
| 6804 | 8356.096 |
| 6805 | 8411.394 |
| 6806 | 8467.558 |
| 6807 | 8523.087 |
| 6808 | 8577.192 |
| 6809 | 8630.269 |
| 6810 | 8684.529 |
| 6811 | 8738.413 |
| 6812 | 8791.721 |
| 6813 | 8843.702 |
| 6814 | 8896.173 |
| 6815 | 8949.692 |
| 6816 | 9003.327 |
| 6817 | 9056.346 |
| 6818 | 9107.212 |
| 6819 | 9159.471 |
| 6820 | 9211.231 |
| 6821 | 9262.769 |
| 6822 | 9314.942 |
| 6823 | 9364.048 |
| 6824 | 9415.048 |
| 6825 | 9465.308 |
| 6826 | 9514.221 |
| 6827 | 9562.298 |
| 6828 | 9609.817 |
| 6829 | 9656.442 |
| 6830 | 9703.385 |
| 6831 | 9749.24 |
| 6832 | 9793.548 |
| 6833 | 9836.385 |
| 6834 | 9879.596 |
| 6835 | 9923.212 |
| 6836 | 9965.24 |
| 6837 | 10007.538 |
| 6838 | 10048.779 |
| 6839 | 10088.615 |
| 6840 | 10128.067 |
| 6841 | 10167.135 |
| 6842 | 10206.471 |
| 6843 | 10244.394 |
| 6844 | 10282.24 |
| 6845 | 10321.038 |
| 6846 | 10357.202 |
| 6847 | 10394.952 |
| 6848 | 10431.567 |
| 6849 | 10467.99 |
| 6850 | 10503.385 |
| 6851 | 10537.356 |
| 6852 | 10571.192 |
| 6853 | 10604.952 |
| 6854 | 10638.279 |
| 6855 | 10671.798 |
| 6856 | 10703.99 |
| 6857 | 10734.798 |
| 6858 | 10765.558 |
| 6859 | 10795.5 |
| 6860 | 10826.385 |
| 6861 | 10855.721 |
| 6862 | 10886.298 |
| 6863 | 10915.048 |
| 6864 | 10944.481 |
| 6865 | 10972.298 |
| 6866 | 10998.75 |
| 6867 | 11024.231 |
| 6868 | 11050.394 |
| 6869 | 11076.115 |
| 6870 | 11100.279 |
| 6871 | 11124.24 |
| 6872 | 11148.692 |
| 6873 | 11171.298 |
| 6874 | 11193.346 |
| 6875 | 11215.596 |
| 6876 | 11236.298 |
| 6877 | 11257.308 |
| 6878 | 11277.404 |
| 6879 | 11298.115 |
| 6880 | 11317.24 |
| 6881 | 11336.817 |
| 6882 | 11356.702 |
| 6883 | 11376.567 |
| 6884 | 11394.644 |
| 6885 | 11412.885 |
| 6886 | 11431.106 |
| 6887 | 11449.221 |
| 6888 | 11466.769 |
| 6889 | 11483.75 |
| 6890 | 11500.567 |
| 6891 | 11517.26 |
| 6892 | 11533.462 |
| 6893 | 11548.875 |
| 6894 | 11563.74 |
| 6895 | 11578.144 |
| 6896 | 11592.192 |
| 6897 | 11606.856 |
| 6898 | 11622.01 |
| 6899 | 11635.481 |
| 6900 | 11648.423 |
| 6901 | 11661.25 |
| 6902 | 11673.837 |
| 6903 | 11686.144 |
| 6904 | 11698.702 |
| 6905 | 11711.481 |
| 6906 | 11724.029 |
| 6907 | 11736.971 |
| 6908 | 11749.067 |
| 6909 | 11760.923 |
| 6910 | 11772.76 |
| 6911 | 11786.183 |
| 6912 | 11797.721 |
| 6913 | 11808.625 |
| 6914 | 11820.202 |
| 6915 | 11831 |
| 6916 | 11842.529 |
| 6917 | 11853.317 |
| 6918 | 11864.375 |
| 6919 | 11875.221 |
| 6920 | 11886.385 |
| 6921 | 11897.308 |
| 6922 | 11907.846 |
| 6923 | 11917.606 |
| 6924 | 11926.76 |
| 6925 | 11936.413 |
| 6926 | 11945.462 |
| 6927 | 11954.663 |
| 6928 | 11963.135 |
| 6929 | 11971.577 |
| 6930 | 11980.288 |
| 6931 | 11988.644 |
| 6932 | 11996.548 |
| 6933 | 12003.76 |
| 6934 | 12011.25 |
| 6935 | 12018.76 |
| 6936 | 12025.577 |
| 6937 | 12031.952 |
| 6938 | 12038.865 |
| 6939 | 12045.596 |
| 6940 | 12051.769 |
| 6941 | 12058.529 |
| 6942 | 12064.173 |
| 6943 | 12069.625 |
| 6944 | 12075.231 |
| 6945 | 12081.038 |
| 6946 | 12085.99 |
| 6947 | 12091.298 |
| 6948 | 12097.298 |
| 6949 | 12102.462 |
| 6950 | 12107.615 |
| 6951 | 12112.135 |
| 6952 | 12117.038 |
| 6953 | 12121.731 |
| 6954 | 12126.596 |
| 6955 | 12130.74 |
| 6956 | 12135.01 |
| 6957 | 12139.962 |
| 6958 | 12144.817 |
| 6959 | 12148.5 |
| 6960 | 12152.692 |
| 6961 | 12156.625 |
| 6962 | 12159.875 |
| 6963 | 12163.875 |
| 6964 | 12167.404 |
| 6965 | 12170.663 |
| 6966 | 12173.731 |
| 6967 | 12177.26 |
| 6968 | 12180.856 |
| 6969 | 12183.644 |
| 6970 | 12186.481 |
| 6971 | 12190.125 |
| 6972 | 12193.567 |
| 6973 | 12196.577 |
| 6974 | 12200.317 |
| 6975 | 12203.567 |
| 6976 | 12207.346 |
| 6977 | 12210.596 |
| 6978 | 12213.413 |
| 6979 | 12216.346 |
| 6980 | 12219.24 |
| 6981 | 12222.365 |
| 6982 | 12224.721 |
| 6983 | 12227.144 |
| 6984 | 12229.712 |
| 6985 | 12232.308 |
| 6986 | 12234.135 |
| 6987 | 12236.356 |
| 6988 | 12238.577 |
| 6989 | 12240.952 |
| 6990 | 12243.442 |
| 6991 | 12245.26 |
| 6992 | 12247.25 |
| 6993 | 12249.779 |
| 6994 | 12252.163 |
| 6995 | 12253.865 |
| 6996 | 12255.558 |
| 6997 | 12256.923 |
| 6998 | 12258.375 |
| 6999 | 12260.096 |
| 7000 | 12261.856 |
| 7001 | 12263.933 |
| 7002 | 12265.904 |
| 7003 | 12267.721 |
| 7004 | 12268.856 |
| 7005 | 12270.125 |
| 7006 | 12271.433 |
| 7007 | 12272.442 |
| 7008 | 12273.51 |
| 7009 | 12274.51 |
| 7010 | 12275.317 |
| 7011 | 12276.471 |
| 7012 | 12276.904 |
| 7013 | 12277.808 |
| 7014 | 12279.01 |
| 7015 | 12279.096 |
| 7016 | 12280.144 |
| 7017 | 12280.529 |
| 7018 | 12281.25 |
| 7019 | 12282.442 |
| 7020 | 12283.548 |
| 7021 | 12284.058 |
| 7022 | 12284.625 |
| 7023 | 12285.077 |
| 7024 | 12285.913 |
| 7025 | 12286.385 |
| 7026 | 12287.288 |
| 7027 | 12288.971 |
| 7028 | 12289.837 |
| 7029 | 12290.385 |
| 7030 | 12290.856 |
| 7031 | 12291.308 |
| 7032 | 12292.058 |
| 7033 | 12292.25 |
| 7034 | 12292.481 |
| 7035 | 12293.058 |
| 7036 | 12293.058 |
| 7037 | 12293.548 |
| 7038 | 12293.904 |
| 7039 | 12293.644 |
| 7040 | 12293.817 |
| 7041 | 12294.067 |
| 7042 | 12294.288 |
| 7043 | 12294.058 |
| 7044 | 12294.423 |
| 7045 | 12294.808 |
| 7046 | 12294.125 |
| 7047 | 12294.673 |
| 7048 | 12294.692 |
| 7049 | 12294.644 |
| 7050 | 12294.779 |
| 7051 | 12294.481 |
| 7052 | 12294.173 |
| 7053 | 12294.279 |
| 7054 | 12294.115 |
| 7055 | 12293.808 |
| 7056 | 12294.038 |
| 7057 | 12293.913 |
| 7058 | 12293.269 |
| 7059 | 12292.846 |
| 7060 | 12292.308 |
| 7061 | 12291.721 |
| 7062 | 12291.798 |
| 7063 | 12291.01 |
| 7064 | 12290.625 |
| 7065 | 12290.173 |
| 7066 | 12289.231 |
| 7067 | 12288.308 |
| 7068 | 12287.933 |
| 7069 | 12287.163 |
| 7070 | 12286.75 |
| 7071 | 12286.212 |
| 7072 | 12285.788 |
| 7073 | 12285.356 |
| 7074 | 12284.558 |
| 7075 | 12283.875 |
| 7076 | 12282.933 |
| 7077 | 12282.923 |
| 7078 | 12282.365 |
| 7079 | 12282.01 |
| 7080 | 12281.779 |
| 7081 | 12280.779 |
| 7082 | 12279.865 |
| 7083 | 12279.202 |
| 7084 | 12278.913 |
| 7085 | 12278.125 |
| 7086 | 12277.433 |
| 7087 | 12276.731 |
| 7088 | 12275.702 |
| 7089 | 12274.721 |
| 7090 | 12273.615 |
| 7091 | 12272.558 |
| 7092 | 12271.615 |
| 7093 | 12270.375 |
| 7094 | 12268.683 |
| 7095 | 12267.654 |
| 7096 | 12266.644 |
| 7097 | 12265.74 |
| 7098 | 12264.538 |
| 7099 | 12263.038 |
| 7100 | 12261.538 |
| 7101 | 12259.769 |
| 7102 | 12258.019 |
| 7103 | 12256.423 |
| 7104 | 12255.202 |
| 7105 | 12254.125 |
| 7106 | 12252.673 |
| 7107 | 12250.615 |
| 7108 | 12249.154 |
| 7109 | 12247.827 |
| 7110 | 12246.76 |
| 7111 | 12245.212 |
| 7112 | 12243.25 |
| 7113 | 12241.683 |
| 7114 | 12239.846 |
| 7115 | 12238.51 |
| 7116 | 12236.74 |
| 7117 | 12234.981 |
| 7118 | 12232.971 |
| 7119 | 12231.24 |
| 7120 | 12229.423 |
| 7121 | 12228.115 |
| 7122 | 12225.933 |
| 7123 | 12224.26 |
| 7124 | 12221.808 |
| 7125 | 12219.788 |
| 7126 | 12217.327 |
| 7127 | 12214.942 |
| 7128 | 12212.817 |
| 7129 | 12210.49 |
| 7130 | 12208.029 |
| 7131 | 12205.933 |
| 7132 | 12203.942 |
| 7133 | 12201.317 |
| 7134 | 12198.202 |
| 7135 | 12195.673 |
| 7136 | 12192.817 |
| 7137 | 12190.048 |
| 7138 | 12187.519 |
| 7139 | 12184.779 |
| 7140 | 12181.875 |
| 7141 | 12179.077 |
| 7142 | 12176.413 |
| 7143 | 12173.885 |
| 7144 | 12171.481 |
| 7145 | 12168.529 |
| 7146 | 12165.971 |
| 7147 | 12163.356 |
| 7148 | 12160.692 |
| 7149 | 12157.731 |
| 7150 | 12154.875 |
| 7151 | 12151.683 |
| 7152 | 12148.817 |
| 7153 | 12145.712 |
| 7154 | 12142.231 |
| 7155 | 12139.192 |
| 7156 | 12135.894 |
| 7157 | 12131.827 |
| 7158 | 12128.01 |
| 7159 | 12124.25 |
| 7160 | 12120.394 |
| 7161 | 12116.865 |
| 7162 | 12113.067 |
| 7163 | 12109.231 |
| 7164 | 12105.317 |
| 7165 | 12101.24 |
| 7166 | 12096.904 |
| 7167 | 12092.702 |
| 7168 | 12088.577 |
| 7169 | 12084.452 |
| 7170 | 12080.202 |
| 7171 | 12075.087 |
| 7172 | 12071.106 |
| 7173 | 12066.731 |
| 7174 | 12062.192 |
| 7175 | 12057.76 |
| 7176 | 12053.365 |
| 7177 | 12048.587 |
| 7178 | 12043.288 |
| 7179 | 12038.702 |
| 7180 | 12033.865 |
| 7181 | 12029.077 |
| 7182 | 12023.442 |
| 7183 | 12018.529 |
| 7184 | 12012.962 |
| 7185 | 12008.125 |
| 7186 | 12002.625 |
| 7187 | 11997.192 |
| 7188 | 11991.683 |
| 7189 | 11986.327 |
| 7190 | 11980.26 |
| 7191 | 11974.933 |
| 7192 | 11969.663 |
| 7193 | 11963.606 |
| 7194 | 11957.298 |
| 7195 | 11951.365 |
| 7196 | 11945.346 |
| 7197 | 11939.279 |
| 7198 | 11933.212 |
| 7199 | 11927.173 |
| 7200 | 11897.279 |
| 7201 | 11890.683 |
| 7202 | 11883.827 |
| 7203 | 11877.404 |
| 7204 | 11870.26 |
| 7205 | 11863.721 |
| 7206 | 11856.51 |
| 7207 | 11849.875 |
| 7208 | 11843.615 |
| 7209 | 11836.567 |
| 7210 | 11829.692 |
| 7211 | 11822.625 |
| 7212 | 11815.635 |
| 7213 | 11807.856 |
| 7214 | 11800.452 |
| 7215 | 11792.856 |
| 7216 | 11785.163 |
| 7217 | 11777.308 |
| 7218 | 11769.106 |
| 7219 | 11761.308 |
| 7220 | 11753.394 |
| 7221 | 11744.596 |
| 7222 | 11736.01 |
| 7223 | 11727.308 |
| 7224 | 11718.567 |
| 7225 | 11709.885 |
| 7226 | 11701.404 |
| 7227 | 11692.615 |
| 7228 | 11683.779 |
| 7229 | 11674.221 |
| 7230 | 11664.24 |
| 7231 | 11654.712 |
| 7232 | 11645.587 |
| 7233 | 11635.606 |
| 7234 | 11626.087 |
| 7235 | 11616.279 |
| 7236 | 11606.337 |
| 7237 | 11596.385 |
| 7238 | 11586.75 |
| 7239 | 11576.49 |
| 7240 | 11566.538 |
| 7241 | 11555.596 |
| 7242 | 11544.808 |
| 7243 | 11534.577 |
| 7244 | 11523.779 |
| 7245 | 11512.327 |
| 7246 | 11501.231 |
| 7247 | 11490.048 |
| 7248 | 11479.144 |
| 7249 | 11468.269 |
| 7250 | 11456.481 |
| 7251 | 11445.327 |
| 7252 | 11432.942 |
| 7253 | 11421.058 |
| 7254 | 11409.356 |
| 7255 | 11397.048 |
| 7256 | 11385.202 |
| 7257 | 11372.644 |
| 7258 | 11359.923 |
| 7259 | 11347.548 |
| 7260 | 11336.077 |
| 7261 | 11323.385 |
| 7262 | 11310.904 |
| 7263 | 11298.712 |
| 7264 | 11285.644 |
| 7265 | 11273.452 |
| 7266 | 11259.952 |
| 7267 | 11246.962 |
| 7268 | 11234.192 |
| 7269 | 11221.212 |
| 7270 | 11207.769 |
| 7271 | 11193.817 |
| 7272 | 11180.163 |
| 7273 | 11166.356 |
| 7274 | 11152.481 |
| 7275 | 11138.115 |
| 7276 | 11124.221 |
| 7277 | 11109.846 |
| 7278 | 11095.74 |
| 7279 | 11081.827 |
| 7280 | 11067.087 |
| 7281 | 11052.096 |
| 7282 | 11036.125 |
| 7283 | 11020.433 |
| 7284 | 11004.548 |
| 7285 | 10989.144 |
| 7286 | 10972.894 |
| 7287 | 10956.702 |
| 7288 | 10940.327 |
| 7289 | 10923.846 |
| 7290 | 10906.779 |
| 7291 | 10889.529 |
| 7292 | 10872.26 |
| 7293 | 10854.894 |
| 7294 | 10837.596 |
| 7295 | 10820.894 |
| 7296 | 10803.462 |
| 7297 | 10785.894 |
| 7298 | 10767.769 |
| 7299 | 10750.019 |
| 7300 | 10732.25 |
| 7301 | 10713.923 |
| 7302 | 10694.913 |
| 7303 | 10676.125 |
| 7304 | 10657.808 |
| 7305 | 10639.221 |
| 7306 | 10620.25 |
| 7307 | 10601.125 |
| 7308 | 10582.24 |
| 7309 | 10564.202 |
| 7310 | 10544.49 |
| 7311 | 10525.788 |
| 7312 | 10506.615 |
| 7313 | 10487.356 |
| 7314 | 10467.942 |
| 7315 | 10448.49 |
| 7316 | 10428.942 |
| 7317 | 10409.048 |
| 7318 | 10389.413 |
| 7319 | 10370.279 |
| 7320 | 10350.404 |
| 7321 | 10330.279 |
| 7322 | 10310.673 |
| 7323 | 10291.5 |
| 7324 | 10270.74 |
| 7325 | 10250.375 |
| 7326 | 10230.596 |
| 7327 | 10210.5 |
| 7328 | 10190.529 |
| 7329 | 10171.163 |
| 7330 | 10150.596 |
| 7331 | 10128.952 |
| 7332 | 10108.279 |
| 7333 | 10086.433 |
| 7334 | 10065.106 |
| 7335 | 10044.481 |
| 7336 | 10022.24 |
| 7337 | 10000.683 |
| 7338 | 9979.163 |
| 7339 | 9957.096 |
| 7340 | 9934.923 |
| 7341 | 9912.462 |
| 7342 | 9889.25 |
| 7343 | 9866.519 |
| 7344 | 9843.837 |
| 7345 | 9821.76 |
| 7346 | 9799.288 |
| 7347 | 9775.923 |
| 7348 | 9752.462 |
| 7349 | 9728.798 |
| 7350 | 9704.51 |
| 7351 | 9680.462 |
| 7352 | 9656.375 |
| 7353 | 9632.308 |
| 7354 | 9608.192 |
| 7355 | 9584 |
| 7356 | 9560.048 |
| 7357 | 9535.24 |
| 7358 | 9509.327 |
| 7359 | 9484.115 |
| 7360 | 9458 |
| 7361 | 9432.106 |
| 7362 | 9405.865 |
| 7363 | 9379.952 |
| 7364 | 9353.144 |
| 7365 | 9327.144 |
| 7366 | 9300.808 |
| 7367 | 9273.663 |
| 7368 | 9247.462 |
| 7369 | 9220.442 |
| 7370 | 9193.356 |
| 7371 | 9166.577 |
| 7372 | 9139.673 |
| 7373 | 9113.115 |
| 7374 | 9086.654 |
| 7375 | 9058.779 |
| 7376 | 9031.788 |
| 7377 | 9004.99 |
| 7378 | 8977.99 |
| 7379 | 8950.231 |
| 7380 | 8923.183 |
| 7381 | 8896.048 |
| 7382 | 8870.192 |
| 7383 | 8843.298 |
| 7384 | 8815.99 |
| 7385 | 8789.135 |
| 7386 | 8761.567 |
| 7387 | 8733.404 |
| 7388 | 8705.952 |
| 7389 | 8677.817 |
| 7390 | 8650.087 |
| 7391 | 8622.298 |
| 7392 | 8594.077 |
| 7393 | 8565.846 |
| 7394 | 8535.971 |
| 7395 | 8506.375 |
| 7396 | 8477.596 |
| 7397 | 8448.779 |
| 7398 | 8420.606 |
| 7399 | 8391.048 |
| 7400 | 8361.558 |
| 7401 | 8333.298 |
| 7402 | 8304.49 |
| 7403 | 8274.817 |
| 7404 | 8246 |
| 7405 | 8216.625 |
| 7406 | 8187.904 |
| 7407 | 8158.962 |
| 7408 | 8130.288 |
| 7409 | 8100.76 |
| 7410 | 8070.962 |
| 7411 | 8041.413 |
| 7412 | 8011.99 |
| 7413 | 7982.385 |
| 7414 | 7953.683 |
| 7415 | 7923.952 |
| 7416 | 7895.144 |
| 7417 | 7865.192 |
| 7418 | 7833.904 |
| 7419 | 7804.798 |
| 7420 | 7773.317 |
| 7421 | 7742.788 |
| 7422 | 7712.529 |
| 7423 | 7682.413 |
| 7424 | 7651.048 |
| 7425 | 7620.221 |
| 7426 | 7589.317 |
| 7427 | 7558.404 |
| 7428 | 7528.346 |
| 7429 | 7497.269 |
| 7430 | 7466.144 |
| 7431 | 7436.635 |
| 7432 | 7406.615 |
| 7433 | 7375.327 |
| 7434 | 7344.308 |
| 7435 | 7313.337 |
| 7436 | 7282.019 |
| 7437 | 7251.375 |
| 7438 | 7219.154 |
| 7439 | 7186.625 |
| 7440 | 7154.981 |
| 7441 | 7123.798 |
| 7442 | 7090.471 |
| 7443 | 7058.087 |
| 7444 | 7025.048 |
| 7445 | 6991.51 |
| 7446 | 6958.125 |
| 7447 | 6924.269 |
| 7448 | 6889.49 |
| 7449 | 6854.144 |
| 7450 | 6817.24 |
| 7451 | 6779.058 |
| 7452 | 6739.721 |
| 7453 | 6700.529 |
| 7454 | 6659.798 |
| 7455 | 6618.49 |
| 7456 | 6577.163 |
| 7457 | 6534.231 |
| 7458 | 6490.279 |
| 7459 | 6445.615 |
| 7460 | 6400.808 |
| 7461 | 6356.971 |
| 7462 | 6310.606 |
| 7463 | 6263.654 |
| 7464 | 6218.183 |
| 7465 | 6172.5 |
| 7466 | 6127.337 |
| 7467 | 6081.538 |
| 7468 | 6036.231 |
| 7469 | 5991.654 |
| 7470 | 5947.25 |
| 7471 | 5902.827 |
| 7472 | 5857.875 |
| 7473 | 5814.481 |
| 7474 | 5772.817 |
| 7475 | 5729.933 |
| 7476 | 5689.087 |
| 7477 | 5648.538 |
| 7478 | 5607.779 |
| 7479 | 5567.779 |
| 7480 | 5527.288 |
| 7481 | 5488.885 |
| 7482 | 5450.308 |
| 7483 | 5412.404 |
| 7484 | 5375.538 |
| 7485 | 5339.846 |
| 7486 | 5304.74 |
| 7487 | 5270.99 |
| 7488 | 5236.019 |
| 7489 | 5200.952 |
| 7490 | 5168.317 |
| 7491 | 5137.625 |
| 7492 | 5108.24 |
| 7493 | 5078.221 |
| 7494 | 5049.587 |
| 7495 | 5022.135 |
| 7496 | 4995.5 |
| 7497 | 4969.317 |
| 7498 | 4945.029 |
| 7499 | 4920.49 |
| 7500 | 4896.452 |
| 7501 | 4874.279 |
| 7502 | 4853.375 |
| 7503 | 4833.106 |
| 7504 | 4814.923 |
| 7505 | 4796.683 |
| 7506 | 4779.442 |
| 7507 | 4762.817 |
| 7508 | 4747.702 |
| 7509 | 4733.106 |
| 7510 | 4720.115 |
| 7511 | 4706.692 |
| 7512 | 4695.394 |
| 7513 | 4683.721 |
| 7514 | 4672.558 |
| 7515 | 4662.49 |
| 7516 | 4653.298 |
| 7517 | 4645.221 |
| 7518 | 4637.404 |
| 7519 | 4629.971 |
| 7520 | 4621.913 |
| 7521 | 4615.731 |
| 7522 | 4610.337 |
| 7523 | 4604.865 |
| 7524 | 4600.144 |
| 7525 | 4596.615 |
| 7526 | 4593.433 |
| 7527 | 4591.144 |
| 7528 | 4588.24 |
| 7529 | 4586.962 |
| 7530 | 4586.356 |
| 7531 | 4586.433 |
| 7532 | 4586.74 |
| 7533 | 4587.49 |
| 7534 | 4587.962 |
| 7535 | 4589.75 |
| 7536 | 4592.135 |
| 7537 | 4595.558 |
| 7538 | 4599.625 |
| 7539 | 4603.625 |
| 7540 | 4608.144 |
| 7541 | 4613.644 |
| 7542 | 4619.712 |
| 7543 | 4626.337 |
| 7544 | 4632.558 |
| 7545 | 4639.827 |
| 7546 | 4646.212 |
| 7547 | 4652.606 |
| 7548 | 4659.615 |
| 7549 | 4667.625 |
| 7550 | 4674.99 |
| 7551 | 4683.663 |
| 7552 | 4692.875 |
| 7553 | 4702.26 |
| 7554 | 4712.356 |
| 7555 | 4722.798 |
| 7556 | 4733.308 |
| 7557 | 4744.115 |
| 7558 | 4754.692 |
| 7559 | 4766.115 |
| 7560 | 4776.202 |
| 7561 | 4787.846 |
| 7562 | 4799.365 |
| 7563 | 4812.038 |
| 7564 | 4825 |
| 7565 | 4836.615 |
| 7566 | 4848.837 |
| 7567 | 4862.317 |
| 7568 | 4876.135 |
| 7569 | 4889.183 |
| 7570 | 4902.596 |
| 7571 | 4916.462 |
| 7572 | 4931.308 |
| 7573 | 4945.49 |
| 7574 | 4960.135 |
| 7575 | 4974.817 |
| 7576 | 4991.442 |
| 7577 | 5008.163 |
| 7578 | 5024.596 |
| 7579 | 5042.135 |
| 7580 | 5058.519 |
| 7581 | 5075.298 |
| 7582 | 5093.279 |
| 7583 | 5110.048 |
| 7584 | 5127.817 |
| 7585 | 5146.096 |
| 7586 | 5163.644 |
| 7587 | 5182.048 |
| 7588 | 5200.135 |
| 7589 | 5218.837 |
| 7590 | 5237.058 |
| 7591 | 5256.24 |
| 7592 | 5275.808 |
| 7593 | 5295.144 |
| 7594 | 5314.894 |
| 7595 | 5334.442 |
| 7596 | 5354.827 |
| 7597 | 5375.067 |
| 7598 | 5395.962 |
| 7599 | 5416.683 |
| 7600 | 5438.279 |
| 7601 | 5459.269 |
| 7602 | 5480.038 |
| 7603 | 5501.192 |
| 7604 | 5523.288 |
| 7605 | 5544.952 |
| 7606 | 5565.846 |
| 7607 | 5586.587 |
| 7608 | 5607.721 |
| 7609 | 5628.183 |
| 7610 | 5648.067 |
| 7611 | 5668.125 |
| 7612 | 5687.923 |
| 7613 | 5707.837 |
| 7614 | 5727.673 |
| 7615 | 5746.029 |
| 7616 | 5764.692 |
| 7617 | 5783.712 |
| 7618 | 5802.423 |
| 7619 | 5821.904 |
| 7620 | 5839.712 |
| 7621 | 5858.462 |
| 7622 | 5877.221 |
| 7623 | 5896.413 |
| 7624 | 5914.99 |
| 7625 | 5934.346 |
| 7626 | 5953.692 |
| 7627 | 5972.423 |
| 7628 | 5991.663 |
| 7629 | 6011.692 |
| 7630 | 6031.519 |
| 7631 | 6051.567 |
| 7632 | 6073.077 |
| 7633 | 6094.385 |
| 7634 | 6115.269 |
| 7635 | 6138.154 |
| 7636 | 6159.26 |
| 7637 | 6182 |
| 7638 | 6203.625 |
| 7639 | 6225.606 |
| 7640 | 6247.154 |
| 7641 | 6269.721 |
| 7642 | 6292.394 |
| 7643 | 6314.183 |
| 7644 | 6336.519 |
| 7645 | 6358.952 |
| 7646 | 6382.452 |
| 7647 | 6405.452 |
| 7648 | 6427.577 |
| 7649 | 6450.75 |
| 7650 | 6474.625 |
| 7651 | 6498.202 |
| 7652 | 6522.135 |
| 7653 | 6546.731 |
| 7654 | 6571.019 |
| 7655 | 6596.433 |
| 7656 | 6621.837 |
| 7657 | 6648.029 |
| 7658 | 6674.019 |
| 7659 | 6702.519 |
| 7660 | 6729.663 |
| 7661 | 6756.019 |
| 7662 | 6783.269 |
| 7663 | 6810.25 |
| 7664 | 6837.5 |
| 7665 | 6864.385 |
| 7666 | 6891.5 |
| 7667 | 6918.712 |
| 7668 | 6946.76 |
| 7669 | 6973.644 |
| 7670 | 7000.75 |
| 7671 | 7027.135 |
| 7672 | 7053.144 |
| 7673 | 7078.952 |
| 7674 | 7103.625 |
| 7675 | 7128.077 |
| 7676 | 7152.933 |
| 7677 | 7175.952 |
| 7678 | 7199.048 |
| 7679 | 7220.942 |
| 7680 | 7243.76 |
| 7681 | 7266.048 |
| 7682 | 7288.471 |
| 7683 | 7310.865 |
| 7684 | 7333.337 |
| 7685 | 7356.337 |
| 7686 | 7379.538 |
| 7687 | 7402.462 |
| 7688 | 7426.173 |
| 7689 | 7450.404 |
| 7690 | 7474.317 |
| 7691 | 7497.981 |
| 7692 | 7522.942 |
| 7693 | 7547.192 |
| 7694 | 7571.173 |
| 7695 | 7595.423 |
| 7696 | 7620.702 |
| 7697 | 7645.01 |
| 7698 | 7670.308 |
| 7699 | 7694.808 |
| 7700 | 7720.26 |
| 7701 | 7744.51 |
| 7702 | 7769.712 |
| 7703 | 7795.375 |
| 7704 | 7820.298 |
| 7705 | 7844.952 |
| 7706 | 7870.673 |
| 7707 | 7896.702 |
| 7708 | 7921.625 |
| 7709 | 7946.212 |
| 7710 | 7971.462 |
| 7711 | 7996.058 |
| 7712 | 8020.692 |
| 7713 | 8046.404 |
| 7714 | 8072.26 |
| 7715 | 8098.058 |
| 7716 | 8124.76 |
| 7717 | 8150.125 |
| 7718 | 8177.942 |
| 7719 | 8206.663 |
| 7720 | 8235.663 |
| 7721 | 8264.433 |
| 7722 | 8292.798 |
| 7723 | 8321.202 |
| 7724 | 8349.798 |
| 7725 | 8378.096 |
| 7726 | 8405.529 |
| 7727 | 8433.058 |
| 7728 | 8461.635 |
| 7729 | 8489.404 |
| 7730 | 8516.731 |
| 7731 | 8542.99 |
| 7732 | 8568.346 |
| 7733 | 8592.923 |
| 7734 | 8616.808 |
| 7735 | 8640.635 |
| 7736 | 8664.231 |
| 7737 | 8686.51 |
| 7738 | 8708.048 |
| 7739 | 8729.538 |
| 7740 | 8750.029 |
| 7741 | 8770.038 |
| 7742 | 8790.106 |
| 7743 | 8809.981 |
| 7744 | 8828.721 |
| 7745 | 8849.067 |
| 7746 | 8869.413 |
| 7747 | 8889.731 |
| 7748 | 8910 |
| 7749 | 8929.952 |
| 7750 | 8950.337 |
| 7751 | 8971.298 |
| 7752 | 8992.481 |
| 7753 | 9013.75 |
| 7754 | 9034.75 |
| 7755 | 9056.279 |
| 7756 | 9077.173 |
| 7757 | 9099.375 |
| 7758 | 9119.76 |
| 7759 | 9141.029 |
| 7760 | 9161.798 |
| 7761 | 9182.942 |
| 7762 | 9203.837 |
| 7763 | 9225.106 |
| 7764 | 9246.038 |
| 7765 | 9266.519 |
| 7766 | 9287.808 |
| 7767 | 9308.692 |
| 7768 | 9328.933 |
| 7769 | 9349.615 |
| 7770 | 9369.048 |
| 7771 | 9388.481 |
| 7772 | 9407.962 |
| 7773 | 9427.663 |
| 7774 | 9447.798 |
| 7775 | 9468.25 |
| 7776 | 9488.375 |
| 7777 | 9508.308 |
| 7778 | 9528.346 |
| 7779 | 9549.317 |
| 7780 | 9570.365 |
| 7781 | 9591.471 |
| 7782 | 9611.49 |
| 7783 | 9631.135 |
| 7784 | 9651.5 |
| 7785 | 9671.971 |
| 7786 | 9692.154 |
| 7787 | 9712.375 |
| 7788 | 9731.673 |
| 7789 | 9750.865 |
| 7790 | 9769.923 |
| 7791 | 9788.163 |
| 7792 | 9807.519 |
| 7793 | 9825.615 |
| 7794 | 9843.394 |
| 7795 | 9860.173 |
| 7796 | 9876.212 |
| 7797 | 9890.981 |
| 7798 | 9905.548 |
| 7799 | 9919.702 |
| 7800 | 9934.308 |
| 7801 | 9948.558 |
| 7802 | 9962.692 |
| 7803 | 9975.567 |
| 7804 | 9989.327 |
| 7805 | 10003.337 |
| 7806 | 10016.51 |
| 7807 | 10030.356 |
| 7808 | 10043.981 |
| 7809 | 10057.481 |
| 7810 | 10071.788 |
| 7811 | 10086.192 |
| 7812 | 10100.327 |
| 7813 | 10114.442 |
| 7814 | 10128.26 |
| 7815 | 10142.827 |
| 7816 | 10156.76 |
| 7817 | 10170.096 |
| 7818 | 10183.798 |
| 7819 | 10197.99 |
| 7820 | 10211.962 |
| 7821 | 10224.894 |
| 7822 | 10238.288 |
| 7823 | 10252.394 |
| 7824 | 10265.442 |
| 7825 | 10278.519 |
| 7826 | 10291.654 |
| 7827 | 10304.25 |
| 7828 | 10317.933 |
| 7829 | 10331.644 |
| 7830 | 10344.471 |
| 7831 | 10357.481 |
| 7832 | 10370.625 |
| 7833 | 10384.202 |
| 7834 | 10397.25 |
| 7835 | 10410.231 |
| 7836 | 10422.712 |
| 7837 | 10435.74 |
| 7838 | 10448.731 |
| 7839 | 10462.635 |
| 7840 | 10475.894 |
| 7841 | 10488.779 |
| 7842 | 10501.529 |
| 7843 | 10514.673 |
| 7844 | 10527.683 |
| 7845 | 10540.644 |
| 7846 | 10553.567 |
| 7847 | 10566.096 |
| 7848 | 10578.567 |
| 7849 | 10590.212 |
| 7850 | 10602.462 |
| 7851 | 10614.288 |
| 7852 | 10626.288 |
| 7853 | 10637.875 |
| 7854 | 10648.558 |
| 7855 | 10659.596 |
| 7856 | 10669.76 |
| 7857 | 10679.846 |
| 7858 | 10689.99 |
| 7859 | 10699.837 |
| 7860 | 10709.212 |
| 7861 | 10718.615 |
| 7862 | 10727.76 |
| 7863 | 10736.337 |
| 7864 | 10745.433 |
| 7865 | 10753.75 |
| 7866 | 10762.817 |
| 7867 | 10772.067 |
| 7868 | 10781.192 |
| 7869 | 10789.519 |
| 7870 | 10798.394 |
| 7871 | 10807.731 |
| 7872 | 10816.692 |
| 7873 | 10825.24 |
| 7874 | 10833.558 |
| 7875 | 10842.952 |
| 7876 | 10850.99 |
| 7877 | 10860.202 |
| 7878 | 10868.683 |
| 7879 | 10877.087 |
| 7880 | 10885.769 |
| 7881 | 10893.731 |
| 7882 | 10902.615 |
| 7883 | 10910.519 |
| 7884 | 10918.212 |
| 7885 | 10926.567 |
| 7886 | 10934.346 |
| 7887 | 10942.885 |
| 7888 | 10950.24 |
| 7889 | 10958.558 |
| 7890 | 10966.894 |
| 7891 | 10974.452 |
| 7892 | 10982.433 |
| 7893 | 10989.106 |
| 7894 | 10995.74 |
| 7895 | 11003.067 |
| 7896 | 11009.721 |
| 7897 | 11016.827 |
| 7898 | 11023.913 |
| 7899 | 11031.606 |
| 7900 | 11038.135 |
| 7901 | 11045.163 |
| 7902 | 11052.317 |
| 7903 | 11059.769 |
| 7904 | 11066.337 |
| 7905 | 11073.577 |
| 7906 | 11080.308 |
| 7907 | 11087.058 |
| 7908 | 11093.702 |
| 7909 | 11100.269 |
| 7910 | 11106.798 |
| 7911 | 11112.827 |
| 7912 | 11118.865 |
| 7913 | 11124.394 |
| 7914 | 11130.577 |
| 7915 | 11136.058 |
| 7916 | 11140.817 |
| 7917 | 11145.75 |
| 7918 | 11150.346 |
| 7919 | 11155.442 |
| 7920 | 11160.173 |
| 7921 | 11163.933 |
| 7922 | 11167.942 |
| 7923 | 11172.096 |
| 7924 | 11176.413 |
| 7925 | 11180.212 |
| 7926 | 11184.327 |
| 7927 | 11188.279 |
| 7928 | 11192.538 |
| 7929 | 11196.548 |
| 7930 | 11200.394 |
| 7931 | 11204.404 |
| 7932 | 11208.163 |
| 7933 | 11211.51 |
| 7934 | 11215.288 |
| 7935 | 11219.058 |
| 7936 | 11222.221 |
| 7937 | 11225.529 |
| 7938 | 11228.558 |
| 7939 | 11233.01 |
| 7940 | 11235.462 |
| 7941 | 11238.615 |
| 7942 | 11242 |
| 7943 | 11245.385 |
| 7944 | 11248.654 |
| 7945 | 11251.731 |
| 7946 | 11254.413 |
| 7947 | 11257.298 |
| 7948 | 11259.856 |
| 7949 | 11262.644 |
| 7950 | 11265.087 |
| 7951 | 11267.615 |
| 7952 | 11270.019 |
| 7953 | 11272.567 |
| 7954 | 11274.385 |
| 7955 | 11276.846 |
| 7956 | 11279.337 |
| 7957 | 11281.904 |
| 7958 | 11284.606 |
| 7959 | 11287.135 |
| 7960 | 11289.442 |
| 7961 | 11291.548 |
| 7962 | 11293.654 |
| 7963 | 11296.125 |
| 7964 | 11298.721 |
| 7965 | 11301 |
| 7966 | 11303.385 |
| 7967 | 11305.183 |
| 7968 | 11307.24 |
| 7969 | 11309.404 |
| 7970 | 11311.308 |
| 7971 | 11313.24 |
| 7972 | 11314.875 |
| 7973 | 11315.923 |
| 7974 | 11317.798 |
| 7975 | 11319.298 |
| 7976 | 11320.817 |
| 7977 | 11321.913 |
| 7978 | 11323.154 |
| 7979 | 11324.115 |
| 7980 | 11324.442 |
| 7981 | 11325.558 |
| 7982 | 11326.298 |
| 7983 | 11326.952 |
| 7984 | 11328 |
| 7985 | 11329.067 |
| 7986 | 11330.481 |
| 7987 | 11330.933 |
| 7988 | 11331.712 |
| 7989 | 11332.5 |
| 7990 | 11333.231 |
| 7991 | 11333.75 |
| 7992 | 11334.221 |
| 7993 | 11334.971 |
| 7994 | 11336.173 |
| 7995 | 11336.846 |
| 7996 | 11337.394 |
| 7997 | 11337.846 |
| 7998 | 11337.356 |
| 7999 | 11338.308 |
| 8000 | 11338.913 |
| 8001 | 11338.558 |
| 8002 | 11338.885 |
| 8003 | 11338.596 |
| 8004 | 11338.962 |
| 8005 | 11338.875 |
| 8006 | 11338.577 |
| 8007 | 11337.942 |
| 8008 | 11336.904 |
| 8009 | 11335.769 |
| 8010 | 11334.606 |
| 8011 | 11333.885 |
| 8012 | 11332.269 |
| 8013 | 11330.933 |
| 8014 | 11329.212 |
| 8015 | 11327.019 |
| 8016 | 11326 |
| 8017 | 11324.221 |
| 8018 | 11322.471 |
| 8019 | 11320.692 |
| 8020 | 11318.106 |
| 8021 | 11315.808 |
| 8022 | 11313.779 |
| 8023 | 11311.538 |
| 8024 | 11309.25 |
| 8025 | 11305.808 |
| 8026 | 11303.125 |
| 8027 | 11299.413 |
| 8028 | 11296.712 |
| 8029 | 11292.788 |
| 8030 | 11289.24 |
| 8031 | 11285.981 |
| 8032 | 11282.202 |
| 8033 | 11277.587 |
| 8034 | 11272.481 |
| 8035 | 11268.029 |
| 8036 | 11263.394 |
| 8037 | 11258.394 |
| 8038 | 11253.663 |
| 8039 | 11248.827 |
| 8040 | 11243.279 |
| 8041 | 11237.212 |
| 8042 | 11232.087 |
| 8043 | 11226.221 |
| 8044 | 11220.423 |
| 8045 | 11214.577 |
| 8046 | 11207.923 |
| 8047 | 11201.933 |
| 8048 | 11196.596 |
| 8049 | 11189.99 |
| 8050 | 11183.192 |
| 8051 | 11176.673 |
| 8052 | 11170.019 |
| 8053 | 11163.538 |
| 8054 | 11157.067 |
| 8055 | 11150.192 |
| 8056 | 11142.702 |
| 8057 | 11134.962 |
| 8058 | 11127.327 |
| 8059 | 11119.596 |
| 8060 | 11112.183 |
| 8061 | 11103.327 |
| 8062 | 11094.673 |
| 8063 | 11086.096 |
| 8064 | 11077.654 |
| 8065 | 11069.096 |
| 8066 | 11059.904 |
| 8067 | 11050.904 |
| 8068 | 11041.577 |
| 8069 | 11031.413 |
| 8070 | 11021.625 |
| 8071 | 11011.904 |
| 8072 | 11000.933 |
| 8073 | 10990.423 |
| 8074 | 10979.942 |
| 8075 | 10969.221 |
| 8076 | 10958.74 |
| 8077 | 10947.76 |
| 8078 | 10935.635 |
| 8079 | 10923.356 |
| 8080 | 10911.288 |
| 8081 | 10898.548 |
| 8082 | 10886.519 |
| 8083 | 10873.808 |
| 8084 | 10861.365 |
| 8085 | 10847.529 |
| 8086 | 10834.788 |
| 8087 | 10821.212 |
| 8088 | 10807.673 |
| 8089 | 10793.625 |
| 8090 | 10779.183 |
| 8091 | 10765.317 |
| 8092 | 10750.692 |
| 8093 | 10736.029 |
| 8094 | 10719.365 |
| 8095 | 10704.154 |
| 8096 | 10689 |
| 8097 | 10673.596 |
| 8098 | 10656.471 |
| 8099 | 10640.26 |
| 8100 | 10624.212 |
| 8101 | 10609.317 |
| 8102 | 10593.731 |
| 8103 | 10578.365 |
| 8104 | 10562.885 |
| 8105 | 10546.606 |
| 8106 | 10530.913 |
| 8107 | 10515.75 |
| 8108 | 10499.375 |
| 8109 | 10482.048 |
| 8110 | 10466.115 |
| 8111 | 10448.308 |
| 8112 | 10431.375 |
| 8113 | 10414.125 |
| 8114 | 10396.038 |
| 8115 | 10379.288 |
| 8116 | 10362.087 |
| 8117 | 10344.154 |
| 8118 | 10325.625 |
| 8119 | 10306.913 |
| 8120 | 10288.423 |
| 8121 | 10269.346 |
| 8122 | 10249.692 |
| 8123 | 10228.952 |
| 8124 | 10207.337 |
| 8125 | 10185.731 |
| 8126 | 10164.423 |
| 8127 | 10143.769 |
| 8128 | 10121.442 |
| 8129 | 10099.856 |
| 8130 | 10076.596 |
| 8131 | 10053.548 |
| 8132 | 10030.673 |
| 8133 | 10007.202 |
| 8134 | 9982.625 |
| 8135 | 9958.356 |
| 8136 | 9932.99 |
| 8137 | 9907.654 |
| 8138 | 9881.779 |
| 8139 | 9855.779 |
| 8140 | 9829.567 |
| 8141 | 9801.692 |
| 8142 | 9774.423 |
| 8143 | 9746.712 |
| 8144 | 9717.442 |
| 8145 | 9688.202 |
| 8146 | 9658.865 |
| 8147 | 9627.654 |
| 8148 | 9597.115 |
| 8149 | 9564.933 |
| 8150 | 9533.327 |
| 8151 | 9500.154 |
| 8152 | 9467.26 |
| 8153 | 9431.606 |
| 8154 | 9397.077 |
| 8155 | 9361.308 |
| 8156 | 9325.548 |
| 8157 | 9287.51 |
| 8158 | 9251.606 |
| 8159 | 9214.365 |
| 8160 | 9177.721 |
| 8161 | 9140.038 |
| 8162 | 9102.913 |
| 8163 | 9065.683 |
| 8164 | 9030.087 |
| 8165 | 8993.654 |
| 8166 | 8956.952 |
| 8167 | 8920.317 |
| 8168 | 8883.077 |
| 8169 | 8846.856 |
| 8170 | 8808.846 |
| 8171 | 8771.317 |
| 8172 | 8733.317 |
| 8173 | 8695.904 |
| 8174 | 8657.75 |
| 8175 | 8618.558 |
| 8176 | 8581.029 |
| 8177 | 8542.74 |
| 8178 | 8501.933 |
| 8179 | 8462.423 |
| 8180 | 8421.827 |
| 8181 | 8381.663 |
| 8182 | 8341.106 |
| 8183 | 8301 |
| 8184 | 8262.077 |
| 8185 | 8224.26 |
| 8186 | 8185.962 |
| 8187 | 8147.413 |
| 8188 | 8109.01 |
| 8189 | 8073.529 |
| 8190 | 8037.404 |
| 8191 | 8002.731 |
| 8192 | 7970.029 |
| 8193 | 7938.712 |
| 8194 | 7906.827 |
| 8195 | 7876.029 |
| 8196 | 7846.337 |
| 8197 | 7816.106 |
| 8198 | 7785.962 |
| 8199 | 7757.192 |
| 8200 | 7728.346 |
| 8201 | 7701.24 |
| 8202 | 7673.144 |
| 8203 | 7646.692 |
| 8204 | 7622.49 |
| 8205 | 7598.308 |
| 8206 | 7575.183 |
| 8207 | 7553.865 |
| 8208 | 7535.029 |
| 8209 | 7517.673 |
| 8210 | 7501.125 |
| 8211 | 7485.76 |
| 8212 | 7471.5 |
| 8213 | 7460.096 |
| 8214 | 7449.837 |
| 8215 | 7443.962 |
| 8216 | 7438.51 |
| 8217 | 7437.663 |
| 8218 | 7438.567 |
| 8219 | 7443.01 |
| 8220 | 7450.019 |
| 8221 | 7460.346 |
| 8222 | 7474.702 |
| 8223 | 7492.096 |
| 8224 | 7512.163 |
| 8225 | 7534.962 |
| 8226 | 7561.394 |
| 8227 | 7591.346 |
| 8228 | 7624.029 |
| 8229 | 7657.692 |
| 8230 | 7693.519 |
| 8231 | 7731.173 |
| 8232 | 7770.538 |
| 8233 | 7810.115 |
| 8234 | 7851.606 |
| 8235 | 7893.212 |
| 8236 | 7937.567 |
| 8237 | 7983.865 |
| 8238 | 8032.067 |
| 8239 | 8077.99 |
| 8240 | 8124.99 |
| 8241 | 8171.606 |
| 8242 | 8217.173 |
| 8243 | 8262.75 |
| 8244 | 8310.279 |
| 8245 | 8357.115 |
| 8246 | 8406.221 |
| 8247 | 8452.183 |
| 8248 | 8500.125 |
| 8249 | 8548.538 |
| 8250 | 8595.981 |
| 8251 | 8643.635 |
| 8252 | 8690.029 |
| 8253 | 8736.846 |
| 8254 | 8784.173 |
| 8255 | 8832.029 |
| 8256 | 8878.538 |
| 8257 | 8925.115 |
| 8258 | 8971.096 |
| 8259 | 9016.413 |
| 8260 | 9061.904 |
| 8261 | 9107.202 |
| 8262 | 9152.606 |
| 8263 | 9198.231 |
| 8264 | 9243.019 |
| 8265 | 9286.077 |
| 8266 | 9329.394 |
| 8267 | 9371.404 |
| 8268 | 9414.288 |
| 8269 | 9455.5 |
| 8270 | 9495.875 |
| 8271 | 9535.76 |
| 8272 | 9576 |
| 8273 | 9614.885 |
| 8274 | 9653.606 |
| 8275 | 9691.577 |
| 8276 | 9727.904 |
| 8277 | 9763.981 |
| 8278 | 9800.308 |
| 8279 | 9835.5 |
| 8280 | 9869.548 |
| 8281 | 9905.644 |
| 8282 | 9939.5 |
| 8283 | 9973.606 |
| 8284 | 10007.548 |
| 8285 | 10039.654 |
| 8286 | 10073.385 |
| 8287 | 10106.385 |
| 8288 | 10139.375 |
| 8289 | 10171.712 |
| 8290 | 10204.375 |
| 8291 | 10236.49 |
| 8292 | 10267.221 |
| 8293 | 10296.856 |
| 8294 | 10326.99 |
| 8295 | 10357.779 |
| 8296 | 10387.375 |
| 8297 | 10416.26 |
| 8298 | 10444.99 |
| 8299 | 10472.587 |
| 8300 | 10498.567 |
| 8301 | 10524.567 |
| 8302 | 10550.577 |
| 8303 | 10576.154 |
| 8304 | 10601.327 |
| 8305 | 10626.885 |
| 8306 | 10651.375 |
| 8307 | 10674.962 |
| 8308 | 10697.702 |
| 8309 | 10721.404 |
| 8310 | 10744.221 |
| 8311 | 10765.577 |
| 8312 | 10787.279 |
| 8313 | 10808.519 |
| 8314 | 10829.462 |
| 8315 | 10850.365 |
| 8316 | 10871.26 |
| 8317 | 10891.452 |
| 8318 | 10911.337 |
| 8319 | 10931.798 |
| 8320 | 10951.5 |
| 8321 | 10972.202 |
| 8322 | 10992.404 |
| 8323 | 11011.26 |
| 8324 | 11030.058 |
| 8325 | 11049.721 |
| 8326 | 11069.212 |
| 8327 | 11088.298 |
| 8328 | 11107.567 |
| 8329 | 11124.721 |
| 8330 | 11142.019 |
| 8331 | 11159.202 |
| 8332 | 11175.76 |
| 8333 | 11192.462 |
| 8334 | 11208.462 |
| 8335 | 11223.788 |
| 8336 | 11239.087 |
| 8337 | 11253.51 |
| 8338 | 11267.058 |
| 8339 | 11281.298 |
| 8340 | 11294.962 |
| 8341 | 11309.135 |
| 8342 | 11322.885 |
| 8343 | 11336.663 |
| 8344 | 11349.99 |
| 8345 | 11362.933 |
| 8346 | 11376.048 |
| 8347 | 11388.76 |
| 8348 | 11401.962 |
| 8349 | 11414.971 |
| 8350 | 11428.413 |
| 8351 | 11440.731 |
| 8352 | 11452.5 |
| 8353 | 11464.654 |
| 8354 | 11476.654 |
| 8355 | 11488.202 |
| 8356 | 11500.115 |
| 8357 | 11511.625 |
| 8358 | 11522.596 |
| 8359 | 11533.538 |
| 8360 | 11544.327 |
| 8361 | 11555 |
| 8362 | 11565.788 |
| 8363 | 11576.106 |
| 8364 | 11585.846 |
| 8365 | 11595.779 |
| 8366 | 11605.163 |
| 8367 | 11614.269 |
| 8368 | 11623.596 |
| 8369 | 11632.856 |
| 8370 | 11641.375 |
| 8371 | 11650.125 |
| 8372 | 11657.577 |
| 8373 | 11665.125 |
| 8374 | 11672.635 |
| 8375 | 11680.596 |
| 8376 | 11687.923 |
| 8377 | 11695.75 |
| 8378 | 11703.183 |
| 8379 | 11710.154 |
| 8380 | 11716.885 |
| 8381 | 11724.048 |
| 8382 | 11730.913 |
| 8383 | 11738.038 |
| 8384 | 11744.442 |
| 8385 | 11750.962 |
| 8386 | 11756.5 |
| 8387 | 11762.904 |
| 8388 | 11769.567 |
| 8389 | 11775.683 |
| 8390 | 11781.404 |
| 8391 | 11787.587 |
| 8392 | 11793.654 |
| 8393 | 11798.683 |
| 8394 | 11804.279 |
| 8395 | 11809.644 |
| 8396 | 11814.413 |
| 8397 | 11818.712 |
| 8398 | 11824.154 |
| 8399 | 11829.077 |
| 8400 | 11833.788 |
| 8401 | 11838.462 |
| 8402 | 11842.481 |
| 8403 | 11846.952 |
| 8404 | 11851.183 |
| 8405 | 11855.288 |
| 8406 | 11859.058 |
| 8407 | 11863.221 |
| 8408 | 11867.212 |
| 8409 | 11870.663 |
| 8410 | 11874.587 |
| 8411 | 11878.721 |
| 8412 | 11881.644 |
| 8413 | 11885.673 |
| 8414 | 11889.538 |
| 8415 | 11893.673 |
| 8416 | 11897.49 |
| 8417 | 11900.952 |
| 8418 | 11904.346 |
| 8419 | 11907.923 |
| 8420 | 11911.779 |
| 8421 | 11915.26 |
| 8422 | 11918.163 |
| 8423 | 11921.442 |
| 8424 | 11924.135 |
| 8425 | 11927.442 |
| 8426 | 11930.615 |
| 8427 | 11932.856 |
| 8428 | 11935.356 |
| 8429 | 11938.087 |
| 8430 | 11940.721 |
| 8431 | 11943.846 |
| 8432 | 11946.01 |
| 8433 | 11948.5 |
| 8434 | 11950.962 |
| 8435 | 11953.471 |
| 8436 | 11955.99 |
| 8437 | 11958.096 |
| 8438 | 11960.038 |
| 8439 | 11962.058 |
| 8440 | 11964.327 |
| 8441 | 11966.596 |
| 8442 | 11969.058 |
| 8443 | 11971.25 |
| 8444 | 11973.692 |
| 8445 | 11975.654 |
| 8446 | 11976.808 |
| 8447 | 11979.01 |
| 8448 | 11981.279 |
| 8449 | 11983.471 |
| 8450 | 11985.231 |
| 8451 | 11986.933 |
| 8452 | 11988.375 |
| 8453 | 11990.279 |
| 8454 | 11992.029 |
| 8455 | 11993.798 |
| 8456 | 11994.894 |
| 8457 | 11996.048 |
| 8458 | 11997.615 |
| 8459 | 11999.154 |
| 8460 | 12000.404 |
| 8461 | 12001.827 |
| 8462 | 12002.942 |
| 8463 | 12004.596 |
| 8464 | 12005.442 |
| 8465 | 12006.038 |
| 8466 | 12007.51 |
| 8467 | 12008.75 |
| 8468 | 12009.077 |
| 8469 | 12009.788 |
| 8470 | 12010.279 |
| 8471 | 12011.721 |
| 8472 | 12012.346 |
| 8473 | 12013.26 |
| 8474 | 12014.192 |
| 8475 | 12014.519 |
| 8476 | 12014.942 |
| 8477 | 12015.875 |
| 8478 | 12016.606 |
| 8479 | 12017.827 |
| 8480 | 12018.25 |
| 8481 | 12018.731 |
| 8482 | 12018.99 |
| 8483 | 12019.615 |
| 8484 | 12019.952 |
| 8485 | 12020.808 |
| 8486 | 12021.596 |
| 8487 | 12022.183 |
| 8488 | 12022.413 |
| 8489 | 12022.904 |
| 8490 | 12023.548 |
| 8491 | 12024.163 |
| 8492 | 12025 |
| 8493 | 12025.683 |
| 8494 | 12026.269 |
| 8495 | 12026.298 |
| 8496 | 12026.731 |
| 8497 | 12027.519 |
| 8498 | 12027.75 |
| 8499 | 12027.894 |
| 8500 | 12027.702 |
| 8501 | 12027.471 |
| 8502 | 12028.058 |
| 8503 | 12028.712 |
| 8504 | 12029.154 |
| 8505 | 12029.192 |
| 8506 | 12029.577 |
| 8507 | 12029.769 |
| 8508 | 12030.038 |
| 8509 | 12030.567 |
| 8510 | 12030.856 |
| 8511 | 12030.865 |
| 8512 | 12030.971 |
| 8513 | 12031.308 |
| 8514 | 12031.154 |
| 8515 | 12031.115 |
| 8516 | 12031.212 |
| 8517 | 12031.096 |
| 8518 | 12031.221 |
| 8519 | 12030.798 |
| 8520 | 12030.481 |
| 8521 | 12030.144 |
| 8522 | 12030.327 |
| 8523 | 12029.692 |
| 8524 | 12029.308 |
| 8525 | 12028.913 |
| 8526 | 12029.038 |
| 8527 | 12028.75 |
| 8528 | 12028.615 |
| 8529 | 12028.769 |
| 8530 | 12028.423 |
| 8531 | 12027.913 |
| 8532 | 12027.404 |
| 8533 | 12027.808 |
| 8534 | 12027.481 |
| 8535 | 12027.356 |
| 8536 | 12027.038 |
| 8537 | 12026.577 |
| 8538 | 12026.221 |
| 8539 | 12025.76 |
| 8540 | 12025.183 |
| 8541 | 12024.644 |
| 8542 | 12023.981 |
| 8543 | 12022.913 |
| 8544 | 12021.894 |
| 8545 | 12020.971 |
| 8546 | 12020.26 |
| 8547 | 12019.644 |
| 8548 | 12018.702 |
| 8549 | 12017.885 |
| 8550 | 12016.452 |
| 8551 | 12015.317 |
| 8552 | 12014.096 |
| 8553 | 12013.212 |
| 8554 | 12012.74 |
| 8555 | 12011.827 |
| 8556 | 12010.202 |
| 8557 | 12008.865 |
| 8558 | 12007.913 |
| 8559 | 12006.567 |
| 8560 | 12005.192 |
| 8561 | 12003.894 |
| 8562 | 12002.49 |
| 8563 | 12000.769 |
| 8564 | 11999.26 |
| 8565 | 11998 |
| 8566 | 11996.827 |
| 8567 | 11995.51 |
| 8568 | 11993.952 |
| 8569 | 11992.538 |
| 8570 | 11991.317 |
| 8571 | 11990.337 |
| 8572 | 11988.692 |
| 8573 | 11987.298 |
| 8574 | 11985.952 |
| 8575 | 11984.413 |
| 8576 | 11982.692 |
| 8577 | 11980.76 |
| 8578 | 11978.731 |
| 8579 | 11976.99 |
| 8580 | 11975.24 |
| 8581 | 11973.423 |
| 8582 | 11971.346 |
| 8583 | 11969.202 |
| 8584 | 11966.913 |
| 8585 | 11965.404 |
| 8586 | 11963.76 |
| 8587 | 11961.952 |
| 8588 | 11960.173 |
| 8589 | 11957.952 |
| 8590 | 11955.923 |
| 8591 | 11954.029 |
| 8592 | 11951.712 |
| 8593 | 11949.577 |
| 8594 | 11947.067 |
| 8595 | 11944.74 |
| 8596 | 11942.125 |
| 8597 | 11939.048 |
| 8598 | 11936.538 |
| 8599 | 11933.692 |
| 8600 | 11930.673 |
| 8601 | 11927.788 |
| 8602 | 11924.827 |
| 8603 | 11921.923 |
| 8604 | 11919.077 |
| 8605 | 11916.279 |
| 8606 | 11913.058 |
| 8607 | 11909.433 |
| 8608 | 11906.394 |
| 8609 | 11903.385 |
| 8610 | 11900.288 |
| 8611 | 11897.288 |
| 8612 | 11893.702 |
| 8613 | 11890.74 |
| 8614 | 11887.481 |
| 8615 | 11883.74 |
| 8616 | 11880.337 |
| 8617 | 11876.702 |
| 8618 | 11872.779 |
| 8619 | 11869.346 |
| 8620 | 11865.308 |
| 8621 | 11861.096 |
| 8622 | 11856.606 |
| 8623 | 11852.721 |
| 8624 | 11848.01 |
| 8625 | 11843.529 |
| 8626 | 11838.798 |
| 8627 | 11833.798 |
| 8628 | 11829.25 |
| 8629 | 11824.548 |
| 8630 | 11819.058 |
| 8631 | 11814.337 |
| 8632 | 11809.538 |
| 8633 | 11804.413 |
| 8634 | 11798.356 |
| 8635 | 11792.529 |
| 8636 | 11786.327 |
| 8637 | 11780.567 |
| 8638 | 11774.635 |
| 8639 | 11768.019 |